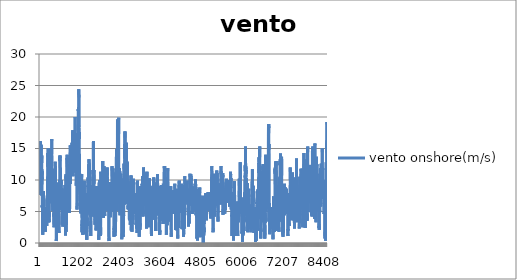
| Category | vento onshore(m/s) |
|---|---|
| 0 | 10.6 |
| 1 | 11 |
| 2 | 11.8 |
| 3 | 12.4 |
| 4 | 12.6 |
| 5 | 12.8 |
| 6 | 13.1 |
| 7 | 13.4 |
| 8 | 13.9 |
| 9 | 14.9 |
| 10 | 16.2 |
| 11 | 15.9 |
| 12 | 15.4 |
| 13 | 15.2 |
| 14 | 13.8 |
| 15 | 13.1 |
| 16 | 10.7 |
| 17 | 9 |
| 18 | 7.6 |
| 19 | 8.2 |
| 20 | 8.9 |
| 21 | 8.7 |
| 22 | 8.4 |
| 23 | 8.2 |
| 24 | 12.3 |
| 25 | 10.7 |
| 26 | 11.8 |
| 27 | 11 |
| 28 | 10.5 |
| 29 | 10.9 |
| 30 | 11.9 |
| 31 | 12.5 |
| 32 | 12.4 |
| 33 | 12.4 |
| 34 | 14 |
| 35 | 15.3 |
| 36 | 15.6 |
| 37 | 14.7 |
| 38 | 14.5 |
| 39 | 12.3 |
| 40 | 12.6 |
| 41 | 11.6 |
| 42 | 10.6 |
| 43 | 10.1 |
| 44 | 10.6 |
| 45 | 10.5 |
| 46 | 13.8 |
| 47 | 12.4 |
| 48 | 13.9 |
| 49 | 13.4 |
| 50 | 12.5 |
| 51 | 11.5 |
| 52 | 11 |
| 53 | 11.7 |
| 54 | 10.2 |
| 55 | 11.4 |
| 56 | 10.1 |
| 57 | 10.4 |
| 58 | 10.5 |
| 59 | 9.3 |
| 60 | 8.6 |
| 61 | 7.5 |
| 62 | 8 |
| 63 | 7.5 |
| 64 | 6 |
| 65 | 5.7 |
| 66 | 6 |
| 67 | 5.8 |
| 68 | 5.6 |
| 69 | 5.9 |
| 70 | 4.9 |
| 71 | 7.1 |
| 72 | 5.2 |
| 73 | 4.1 |
| 74 | 4.2 |
| 75 | 4 |
| 76 | 4 |
| 77 | 1.3 |
| 78 | 1.9 |
| 79 | 3.3 |
| 80 | 4.5 |
| 81 | 6.2 |
| 82 | 7.2 |
| 83 | 7 |
| 84 | 6.5 |
| 85 | 6.1 |
| 86 | 4.8 |
| 87 | 3.1 |
| 88 | 2.8 |
| 89 | 2.8 |
| 90 | 2.8 |
| 91 | 4.2 |
| 92 | 4.7 |
| 93 | 5.9 |
| 94 | 7.5 |
| 95 | 8.2 |
| 96 | 7.6 |
| 97 | 6.8 |
| 98 | 6.7 |
| 99 | 7.4 |
| 100 | 8.2 |
| 101 | 8.3 |
| 102 | 7.3 |
| 103 | 7.5 |
| 104 | 7.9 |
| 105 | 7.9 |
| 106 | 7.8 |
| 107 | 7.2 |
| 108 | 6.2 |
| 109 | 5.8 |
| 110 | 6.9 |
| 111 | 5.7 |
| 112 | 5.4 |
| 113 | 4.5 |
| 114 | 4.7 |
| 115 | 4 |
| 116 | 4.8 |
| 117 | 4.5 |
| 118 | 4.7 |
| 119 | 4.4 |
| 120 | 4.4 |
| 121 | 4 |
| 122 | 3.3 |
| 123 | 2.9 |
| 124 | 3.7 |
| 125 | 4.2 |
| 126 | 4.2 |
| 127 | 4.3 |
| 128 | 4 |
| 129 | 4.1 |
| 130 | 4.1 |
| 131 | 3.6 |
| 132 | 3.5 |
| 133 | 3.6 |
| 134 | 3.2 |
| 135 | 2.9 |
| 136 | 2.4 |
| 137 | 1.9 |
| 138 | 2.6 |
| 139 | 3.6 |
| 140 | 4.2 |
| 141 | 4.2 |
| 142 | 4.5 |
| 143 | 4.5 |
| 144 | 4.4 |
| 145 | 4 |
| 146 | 3.3 |
| 147 | 2.9 |
| 148 | 3.7 |
| 149 | 4.2 |
| 150 | 4.2 |
| 151 | 4.3 |
| 152 | 4 |
| 153 | 4.1 |
| 154 | 4.1 |
| 155 | 3.6 |
| 156 | 3.5 |
| 157 | 3.6 |
| 158 | 3.2 |
| 159 | 2.9 |
| 160 | 2.4 |
| 161 | 1.8 |
| 162 | 2.6 |
| 163 | 3.5 |
| 164 | 4.3 |
| 165 | 4.4 |
| 166 | 4.5 |
| 167 | 4.5 |
| 168 | 3.9 |
| 169 | 3.6 |
| 170 | 3.8 |
| 171 | 4.3 |
| 172 | 5 |
| 173 | 5.1 |
| 174 | 5 |
| 175 | 4.6 |
| 176 | 4.2 |
| 177 | 4.1 |
| 178 | 3.8 |
| 179 | 3.4 |
| 180 | 3.3 |
| 181 | 3.1 |
| 182 | 3.1 |
| 183 | 3.2 |
| 184 | 3.4 |
| 185 | 4 |
| 186 | 4.4 |
| 187 | 5 |
| 188 | 5.5 |
| 189 | 5.7 |
| 190 | 5.8 |
| 191 | 5.5 |
| 192 | 5.4 |
| 193 | 4.4 |
| 194 | 3.5 |
| 195 | 2.7 |
| 196 | 4.1 |
| 197 | 4.3 |
| 198 | 4.5 |
| 199 | 4 |
| 200 | 4.5 |
| 201 | 4.9 |
| 202 | 5.1 |
| 203 | 5.1 |
| 204 | 5.5 |
| 205 | 5.6 |
| 206 | 5.3 |
| 207 | 5.1 |
| 208 | 5.5 |
| 209 | 5.8 |
| 210 | 6 |
| 211 | 6.4 |
| 212 | 6.4 |
| 213 | 6.3 |
| 214 | 7.2 |
| 215 | 5 |
| 216 | 5.6 |
| 217 | 5.6 |
| 218 | 5.7 |
| 219 | 6.5 |
| 220 | 7.9 |
| 221 | 9.4 |
| 222 | 10.4 |
| 223 | 10.5 |
| 224 | 10.7 |
| 225 | 10.7 |
| 226 | 11.7 |
| 227 | 11.9 |
| 228 | 12.6 |
| 229 | 14.3 |
| 230 | 13.6 |
| 231 | 12.2 |
| 232 | 12.5 |
| 233 | 12.7 |
| 234 | 12.6 |
| 235 | 12.1 |
| 236 | 12.2 |
| 237 | 12.1 |
| 238 | 13 |
| 239 | 15 |
| 240 | 10.1 |
| 241 | 10.6 |
| 242 | 9 |
| 243 | 8.5 |
| 244 | 7.5 |
| 245 | 6.9 |
| 246 | 6.8 |
| 247 | 6.8 |
| 248 | 4.9 |
| 249 | 3.9 |
| 250 | 3.3 |
| 251 | 4.3 |
| 252 | 4.6 |
| 253 | 4.7 |
| 254 | 4.5 |
| 255 | 5.3 |
| 256 | 7 |
| 257 | 6.4 |
| 258 | 5.4 |
| 259 | 4.9 |
| 260 | 4.8 |
| 261 | 4.4 |
| 262 | 4.3 |
| 263 | 4.1 |
| 264 | 4.9 |
| 265 | 4.1 |
| 266 | 3.3 |
| 267 | 3.2 |
| 268 | 3.2 |
| 269 | 3.3 |
| 270 | 3.3 |
| 271 | 3.9 |
| 272 | 5 |
| 273 | 6.3 |
| 274 | 6.9 |
| 275 | 7.2 |
| 276 | 7.9 |
| 277 | 9.1 |
| 278 | 10.1 |
| 279 | 10.8 |
| 280 | 11.2 |
| 281 | 11.6 |
| 282 | 12.3 |
| 283 | 12.9 |
| 284 | 13.5 |
| 285 | 14.1 |
| 286 | 14 |
| 287 | 14.4 |
| 288 | 13.6 |
| 289 | 12.5 |
| 290 | 12.2 |
| 291 | 14.3 |
| 292 | 14.9 |
| 293 | 10.3 |
| 294 | 7.3 |
| 295 | 8.2 |
| 296 | 7.6 |
| 297 | 6.9 |
| 298 | 6.8 |
| 299 | 6.5 |
| 300 | 6.3 |
| 301 | 6.5 |
| 302 | 7.6 |
| 303 | 9.1 |
| 304 | 9.4 |
| 305 | 10 |
| 306 | 9.8 |
| 307 | 9.3 |
| 308 | 9.4 |
| 309 | 8.4 |
| 310 | 7.9 |
| 311 | 8.5 |
| 312 | 8.6 |
| 313 | 8.4 |
| 314 | 8.5 |
| 315 | 7.4 |
| 316 | 6.9 |
| 317 | 6.6 |
| 318 | 7.3 |
| 319 | 7.8 |
| 320 | 7.6 |
| 321 | 7 |
| 322 | 8.3 |
| 323 | 8.5 |
| 324 | 9.4 |
| 325 | 9.7 |
| 326 | 10.2 |
| 327 | 10.9 |
| 328 | 10.4 |
| 329 | 9.1 |
| 330 | 8.8 |
| 331 | 8.6 |
| 332 | 8.7 |
| 333 | 10.5 |
| 334 | 12 |
| 335 | 12.4 |
| 336 | 12.7 |
| 337 | 12.1 |
| 338 | 12.1 |
| 339 | 13.1 |
| 340 | 14.6 |
| 341 | 15.9 |
| 342 | 16.1 |
| 343 | 16.5 |
| 344 | 16.2 |
| 345 | 15.5 |
| 346 | 15.6 |
| 347 | 13.8 |
| 348 | 10.8 |
| 349 | 9.3 |
| 350 | 10.3 |
| 351 | 11.2 |
| 352 | 10.1 |
| 353 | 10.2 |
| 354 | 10.6 |
| 355 | 10.2 |
| 356 | 10.3 |
| 357 | 9.5 |
| 358 | 9 |
| 359 | 8.8 |
| 360 | 9.4 |
| 361 | 9.1 |
| 362 | 8.7 |
| 363 | 7.7 |
| 364 | 7.2 |
| 365 | 6.4 |
| 366 | 6.1 |
| 367 | 7.4 |
| 368 | 6.4 |
| 369 | 5.7 |
| 370 | 5.1 |
| 371 | 6.1 |
| 372 | 7.7 |
| 373 | 8 |
| 374 | 8.6 |
| 375 | 8.6 |
| 376 | 8.2 |
| 377 | 9.1 |
| 378 | 10.3 |
| 379 | 10.1 |
| 380 | 9.4 |
| 381 | 9.4 |
| 382 | 10 |
| 383 | 11.8 |
| 384 | 7.3 |
| 385 | 7.8 |
| 386 | 7.7 |
| 387 | 7.4 |
| 388 | 6.5 |
| 389 | 6.2 |
| 390 | 6.8 |
| 391 | 7.7 |
| 392 | 8 |
| 393 | 7 |
| 394 | 6.4 |
| 395 | 7.3 |
| 396 | 6.5 |
| 397 | 6.3 |
| 398 | 6.3 |
| 399 | 5.2 |
| 400 | 5.2 |
| 401 | 4.2 |
| 402 | 4.7 |
| 403 | 4.4 |
| 404 | 3.6 |
| 405 | 3.2 |
| 406 | 2.5 |
| 407 | 2.7 |
| 408 | 4.6 |
| 409 | 5.3 |
| 410 | 5.7 |
| 411 | 6 |
| 412 | 6.2 |
| 413 | 6.5 |
| 414 | 7.1 |
| 415 | 7.3 |
| 416 | 6.2 |
| 417 | 5.6 |
| 418 | 5.2 |
| 419 | 5.2 |
| 420 | 5.6 |
| 421 | 5.6 |
| 422 | 5.7 |
| 423 | 6.1 |
| 424 | 6 |
| 425 | 6.3 |
| 426 | 6.7 |
| 427 | 8.2 |
| 428 | 10.6 |
| 429 | 11.3 |
| 430 | 11.4 |
| 431 | 11.3 |
| 432 | 11 |
| 433 | 10.6 |
| 434 | 10.3 |
| 435 | 10.2 |
| 436 | 10.1 |
| 437 | 10.5 |
| 438 | 10.8 |
| 439 | 10.6 |
| 440 | 10.5 |
| 441 | 10.8 |
| 442 | 11.3 |
| 443 | 11.7 |
| 444 | 12.1 |
| 445 | 12.6 |
| 446 | 12.9 |
| 447 | 12.9 |
| 448 | 12.7 |
| 449 | 12.3 |
| 450 | 12 |
| 451 | 11.6 |
| 452 | 11.3 |
| 453 | 11 |
| 454 | 10.7 |
| 455 | 10.4 |
| 456 | 9.6 |
| 457 | 9.3 |
| 458 | 9.1 |
| 459 | 8.5 |
| 460 | 8 |
| 461 | 7.8 |
| 462 | 7.6 |
| 463 | 7.2 |
| 464 | 6.7 |
| 465 | 6.4 |
| 466 | 6.2 |
| 467 | 6 |
| 468 | 5.9 |
| 469 | 5.8 |
| 470 | 5.6 |
| 471 | 5.4 |
| 472 | 5.1 |
| 473 | 4.6 |
| 474 | 4.1 |
| 475 | 3.1 |
| 476 | 1.8 |
| 477 | 0.8 |
| 478 | 0.3 |
| 479 | 0.7 |
| 480 | 1.9 |
| 481 | 2.2 |
| 482 | 2.1 |
| 483 | 2.5 |
| 484 | 3.1 |
| 485 | 4 |
| 486 | 4.2 |
| 487 | 4 |
| 488 | 4.6 |
| 489 | 5.1 |
| 490 | 5.5 |
| 491 | 5.8 |
| 492 | 6.1 |
| 493 | 6.8 |
| 494 | 7.3 |
| 495 | 7.8 |
| 496 | 7.8 |
| 497 | 7.8 |
| 498 | 8 |
| 499 | 8.2 |
| 500 | 8.3 |
| 501 | 8.3 |
| 502 | 7.9 |
| 503 | 7.7 |
| 504 | 8.8 |
| 505 | 8.1 |
| 506 | 7.5 |
| 507 | 6.7 |
| 508 | 6.4 |
| 509 | 6.7 |
| 510 | 7 |
| 511 | 7.3 |
| 512 | 8 |
| 513 | 8.8 |
| 514 | 9 |
| 515 | 9.2 |
| 516 | 9.3 |
| 517 | 8.8 |
| 518 | 8.8 |
| 519 | 8.3 |
| 520 | 7.2 |
| 521 | 6.6 |
| 522 | 6.3 |
| 523 | 6 |
| 524 | 5.4 |
| 525 | 5.2 |
| 526 | 4.9 |
| 527 | 4.3 |
| 528 | 6.9 |
| 529 | 6.5 |
| 530 | 6.7 |
| 531 | 6.5 |
| 532 | 6.3 |
| 533 | 6.6 |
| 534 | 7.2 |
| 535 | 7.5 |
| 536 | 8 |
| 537 | 8.3 |
| 538 | 8.5 |
| 539 | 8.7 |
| 540 | 9.2 |
| 541 | 9.6 |
| 542 | 9.5 |
| 543 | 9.5 |
| 544 | 9.7 |
| 545 | 9.7 |
| 546 | 9.6 |
| 547 | 9.4 |
| 548 | 9.3 |
| 549 | 9.2 |
| 550 | 8.9 |
| 551 | 8.4 |
| 552 | 2.8 |
| 553 | 1.6 |
| 554 | 1.9 |
| 555 | 2.7 |
| 556 | 4 |
| 557 | 5.3 |
| 558 | 5.4 |
| 559 | 5.2 |
| 560 | 5.2 |
| 561 | 5.2 |
| 562 | 5.7 |
| 563 | 6.9 |
| 564 | 6.9 |
| 565 | 7.1 |
| 566 | 6.9 |
| 567 | 7.5 |
| 568 | 7.8 |
| 569 | 8 |
| 570 | 8.1 |
| 571 | 8.5 |
| 572 | 9.3 |
| 573 | 9.8 |
| 574 | 10.2 |
| 575 | 10.3 |
| 576 | 13.6 |
| 577 | 13.3 |
| 578 | 13.3 |
| 579 | 13 |
| 580 | 13.2 |
| 581 | 13.5 |
| 582 | 13.6 |
| 583 | 13.7 |
| 584 | 13.5 |
| 585 | 13.9 |
| 586 | 13.9 |
| 587 | 13.6 |
| 588 | 13.5 |
| 589 | 13.3 |
| 590 | 12.7 |
| 591 | 12.1 |
| 592 | 12.1 |
| 593 | 12 |
| 594 | 12.1 |
| 595 | 12.1 |
| 596 | 12.2 |
| 597 | 12.1 |
| 598 | 11.9 |
| 599 | 11.4 |
| 600 | 8.3 |
| 601 | 8.1 |
| 602 | 7.2 |
| 603 | 6.4 |
| 604 | 6.6 |
| 605 | 7.8 |
| 606 | 9.3 |
| 607 | 9.7 |
| 608 | 9.2 |
| 609 | 8.6 |
| 610 | 8.4 |
| 611 | 8.2 |
| 612 | 8.1 |
| 613 | 8 |
| 614 | 8.4 |
| 615 | 9.1 |
| 616 | 9.6 |
| 617 | 9.5 |
| 618 | 9.4 |
| 619 | 9.7 |
| 620 | 10 |
| 621 | 9.8 |
| 622 | 9.3 |
| 623 | 9.2 |
| 624 | 7 |
| 625 | 6.6 |
| 626 | 6.3 |
| 627 | 5.8 |
| 628 | 5.4 |
| 629 | 5.2 |
| 630 | 6.5 |
| 631 | 7.8 |
| 632 | 8.3 |
| 633 | 7.4 |
| 634 | 6.4 |
| 635 | 5.9 |
| 636 | 6.4 |
| 637 | 7.4 |
| 638 | 8.5 |
| 639 | 8.7 |
| 640 | 8.5 |
| 641 | 8.3 |
| 642 | 8.2 |
| 643 | 8.4 |
| 644 | 8.6 |
| 645 | 8 |
| 646 | 7.1 |
| 647 | 5.7 |
| 648 | 5.2 |
| 649 | 4.1 |
| 650 | 3.3 |
| 651 | 2.9 |
| 652 | 2.9 |
| 653 | 3.4 |
| 654 | 4.2 |
| 655 | 4.8 |
| 656 | 4.9 |
| 657 | 5.3 |
| 658 | 5.8 |
| 659 | 5.1 |
| 660 | 4.3 |
| 661 | 4.7 |
| 662 | 4.9 |
| 663 | 5.3 |
| 664 | 5.5 |
| 665 | 5 |
| 666 | 4.1 |
| 667 | 3.2 |
| 668 | 2.6 |
| 669 | 2.6 |
| 670 | 2.9 |
| 671 | 3.1 |
| 672 | 4.5 |
| 673 | 4.6 |
| 674 | 4.5 |
| 675 | 4.4 |
| 676 | 4.4 |
| 677 | 4.9 |
| 678 | 5.7 |
| 679 | 5.8 |
| 680 | 6.1 |
| 681 | 6.1 |
| 682 | 5.7 |
| 683 | 5.7 |
| 684 | 5.6 |
| 685 | 5.5 |
| 686 | 5.7 |
| 687 | 6.1 |
| 688 | 6.4 |
| 689 | 6.7 |
| 690 | 6.8 |
| 691 | 6.9 |
| 692 | 6.8 |
| 693 | 6.2 |
| 694 | 5.4 |
| 695 | 4.8 |
| 696 | 6.5 |
| 697 | 6.3 |
| 698 | 6.1 |
| 699 | 5.7 |
| 700 | 5.4 |
| 701 | 5.6 |
| 702 | 6.3 |
| 703 | 6.8 |
| 704 | 7.2 |
| 705 | 7.5 |
| 706 | 7.9 |
| 707 | 8.1 |
| 708 | 7.6 |
| 709 | 7.3 |
| 710 | 7.2 |
| 711 | 8 |
| 712 | 7 |
| 713 | 6.2 |
| 714 | 5.5 |
| 715 | 6.3 |
| 716 | 6.9 |
| 717 | 6.6 |
| 718 | 6.9 |
| 719 | 8.2 |
| 720 | 3.7 |
| 721 | 4.5 |
| 722 | 5.5 |
| 723 | 6.2 |
| 724 | 6.7 |
| 725 | 6.7 |
| 726 | 6.9 |
| 727 | 6.9 |
| 728 | 6.9 |
| 729 | 7.3 |
| 730 | 7.4 |
| 731 | 7.9 |
| 732 | 8.9 |
| 733 | 9.2 |
| 734 | 7.9 |
| 735 | 7.5 |
| 736 | 7.3 |
| 737 | 6.5 |
| 738 | 5.9 |
| 739 | 5.7 |
| 740 | 5.6 |
| 741 | 5.3 |
| 742 | 5.8 |
| 743 | 5.5 |
| 744 | 3.4 |
| 745 | 2.2 |
| 746 | 1.4 |
| 747 | 1.2 |
| 748 | 4.3 |
| 749 | 5.4 |
| 750 | 6.9 |
| 751 | 7.6 |
| 752 | 8.3 |
| 753 | 8.6 |
| 754 | 8.8 |
| 755 | 8.6 |
| 756 | 8.6 |
| 757 | 8.7 |
| 758 | 9.3 |
| 759 | 10.3 |
| 760 | 10.9 |
| 761 | 10.6 |
| 762 | 10.2 |
| 763 | 10.6 |
| 764 | 8.1 |
| 765 | 4.5 |
| 766 | 3.2 |
| 767 | 2.1 |
| 768 | 2 |
| 769 | 1.8 |
| 770 | 2 |
| 771 | 2.8 |
| 772 | 3.4 |
| 773 | 3.4 |
| 774 | 3.8 |
| 775 | 4.2 |
| 776 | 5 |
| 777 | 5.8 |
| 778 | 6.9 |
| 779 | 8.3 |
| 780 | 8.5 |
| 781 | 8.4 |
| 782 | 8.1 |
| 783 | 8.1 |
| 784 | 8.2 |
| 785 | 8.3 |
| 786 | 8.2 |
| 787 | 9 |
| 788 | 10.2 |
| 789 | 10.8 |
| 790 | 8.8 |
| 791 | 8.8 |
| 792 | 13.4 |
| 793 | 14 |
| 794 | 14 |
| 795 | 13.2 |
| 796 | 13.5 |
| 797 | 12.6 |
| 798 | 12.3 |
| 799 | 12.3 |
| 800 | 12.3 |
| 801 | 12 |
| 802 | 12.5 |
| 803 | 9.4 |
| 804 | 9.7 |
| 805 | 8.4 |
| 806 | 8.1 |
| 807 | 8.7 |
| 808 | 9.1 |
| 809 | 9.4 |
| 810 | 10.3 |
| 811 | 10.8 |
| 812 | 10.5 |
| 813 | 9.9 |
| 814 | 9.9 |
| 815 | 9.8 |
| 816 | 6.4 |
| 817 | 6.3 |
| 818 | 6.6 |
| 819 | 6.9 |
| 820 | 6.3 |
| 821 | 5.7 |
| 822 | 6.6 |
| 823 | 7.5 |
| 824 | 8.1 |
| 825 | 9.4 |
| 826 | 8 |
| 827 | 7.8 |
| 828 | 7.8 |
| 829 | 7.4 |
| 830 | 6.3 |
| 831 | 6.3 |
| 832 | 6.9 |
| 833 | 7.4 |
| 834 | 7.4 |
| 835 | 7.2 |
| 836 | 7.2 |
| 837 | 7.7 |
| 838 | 7.7 |
| 839 | 8.2 |
| 840 | 5.8 |
| 841 | 5.4 |
| 842 | 5.4 |
| 843 | 5.6 |
| 844 | 6.1 |
| 845 | 6.4 |
| 846 | 6.8 |
| 847 | 6.8 |
| 848 | 6.9 |
| 849 | 6.9 |
| 850 | 7 |
| 851 | 7.2 |
| 852 | 7.2 |
| 853 | 7 |
| 854 | 6.9 |
| 855 | 6.7 |
| 856 | 6.8 |
| 857 | 7.2 |
| 858 | 7.4 |
| 859 | 7.6 |
| 860 | 7.9 |
| 861 | 7.9 |
| 862 | 7.8 |
| 863 | 8.3 |
| 864 | 4.8 |
| 865 | 5.3 |
| 866 | 5.2 |
| 867 | 5.5 |
| 868 | 5.5 |
| 869 | 5.5 |
| 870 | 6.8 |
| 871 | 8.6 |
| 872 | 9.7 |
| 873 | 11 |
| 874 | 12 |
| 875 | 12.6 |
| 876 | 13 |
| 877 | 13.6 |
| 878 | 14.1 |
| 879 | 14.2 |
| 880 | 14.3 |
| 881 | 14.4 |
| 882 | 14.5 |
| 883 | 14.8 |
| 884 | 15.1 |
| 885 | 15.5 |
| 886 | 15.6 |
| 887 | 15.3 |
| 888 | 14 |
| 889 | 13.2 |
| 890 | 12.1 |
| 891 | 11.3 |
| 892 | 10.2 |
| 893 | 9.4 |
| 894 | 10.5 |
| 895 | 11 |
| 896 | 11.8 |
| 897 | 12.2 |
| 898 | 11.9 |
| 899 | 11.3 |
| 900 | 10.9 |
| 901 | 10.8 |
| 902 | 10.8 |
| 903 | 11.1 |
| 904 | 11.5 |
| 905 | 12 |
| 906 | 12.5 |
| 907 | 13.3 |
| 908 | 14.1 |
| 909 | 14.3 |
| 910 | 13.8 |
| 911 | 13.4 |
| 912 | 13.4 |
| 913 | 12.7 |
| 914 | 11.8 |
| 915 | 11.7 |
| 916 | 11.6 |
| 917 | 11.8 |
| 918 | 12.8 |
| 919 | 13.2 |
| 920 | 13.6 |
| 921 | 13.2 |
| 922 | 12.5 |
| 923 | 12 |
| 924 | 11.4 |
| 925 | 10.7 |
| 926 | 11 |
| 927 | 12.1 |
| 928 | 13 |
| 929 | 13.2 |
| 930 | 13.8 |
| 931 | 14.3 |
| 932 | 15 |
| 933 | 15.4 |
| 934 | 15.6 |
| 935 | 15.9 |
| 936 | 15.3 |
| 937 | 14.3 |
| 938 | 13.6 |
| 939 | 13.4 |
| 940 | 13.5 |
| 941 | 14.1 |
| 942 | 14.5 |
| 943 | 14.7 |
| 944 | 14.4 |
| 945 | 14.2 |
| 946 | 13.8 |
| 947 | 13.4 |
| 948 | 12.8 |
| 949 | 13.1 |
| 950 | 14.4 |
| 951 | 15.8 |
| 952 | 16.9 |
| 953 | 17.4 |
| 954 | 17.7 |
| 955 | 17.8 |
| 956 | 17.9 |
| 957 | 17.7 |
| 958 | 17.1 |
| 959 | 16.3 |
| 960 | 13.1 |
| 961 | 12.2 |
| 962 | 11.4 |
| 963 | 10.6 |
| 964 | 11 |
| 965 | 11.8 |
| 966 | 12.7 |
| 967 | 13.6 |
| 968 | 13.1 |
| 969 | 12.6 |
| 970 | 12.6 |
| 971 | 12.5 |
| 972 | 12.2 |
| 973 | 12.2 |
| 974 | 12.2 |
| 975 | 12.3 |
| 976 | 13 |
| 977 | 13.9 |
| 978 | 14.7 |
| 979 | 15.3 |
| 980 | 15.8 |
| 981 | 16 |
| 982 | 15.9 |
| 983 | 15.6 |
| 984 | 14.6 |
| 985 | 13.7 |
| 986 | 12.8 |
| 987 | 12.8 |
| 988 | 12.7 |
| 989 | 12.1 |
| 990 | 11.6 |
| 991 | 11.6 |
| 992 | 11.6 |
| 993 | 11.2 |
| 994 | 11.3 |
| 995 | 11.7 |
| 996 | 12.2 |
| 997 | 12.8 |
| 998 | 13.3 |
| 999 | 13.7 |
| 1000 | 13.6 |
| 1001 | 13.6 |
| 1002 | 14.1 |
| 1003 | 15.4 |
| 1004 | 16 |
| 1005 | 15.8 |
| 1006 | 15.2 |
| 1007 | 14.3 |
| 1008 | 16.2 |
| 1009 | 16.1 |
| 1010 | 15.4 |
| 1011 | 15.3 |
| 1012 | 15.1 |
| 1013 | 15.1 |
| 1014 | 15.5 |
| 1015 | 16.3 |
| 1016 | 17.2 |
| 1017 | 17.2 |
| 1018 | 17.4 |
| 1019 | 17.3 |
| 1020 | 17.5 |
| 1021 | 18.1 |
| 1022 | 18.6 |
| 1023 | 18.8 |
| 1024 | 18.9 |
| 1025 | 19.5 |
| 1026 | 20 |
| 1027 | 20 |
| 1028 | 19.9 |
| 1029 | 19.8 |
| 1030 | 19 |
| 1031 | 18.1 |
| 1032 | 17.1 |
| 1033 | 16.7 |
| 1034 | 15.1 |
| 1035 | 13.9 |
| 1036 | 12.8 |
| 1037 | 13.5 |
| 1038 | 15.7 |
| 1039 | 16.9 |
| 1040 | 16.8 |
| 1041 | 15.7 |
| 1042 | 15.1 |
| 1043 | 15.4 |
| 1044 | 16.4 |
| 1045 | 16.9 |
| 1046 | 17.1 |
| 1047 | 17 |
| 1048 | 17.1 |
| 1049 | 17.2 |
| 1050 | 17.2 |
| 1051 | 17.2 |
| 1052 | 17.4 |
| 1053 | 17.2 |
| 1054 | 16.7 |
| 1055 | 16.3 |
| 1056 | 12.6 |
| 1057 | 11.9 |
| 1058 | 11.2 |
| 1059 | 10 |
| 1060 | 9.1 |
| 1061 | 9.6 |
| 1062 | 11.1 |
| 1063 | 11.8 |
| 1064 | 13.3 |
| 1065 | 12.3 |
| 1066 | 12.5 |
| 1067 | 12.9 |
| 1068 | 12.8 |
| 1069 | 13.3 |
| 1070 | 12.9 |
| 1071 | 12.4 |
| 1072 | 12.7 |
| 1073 | 13.1 |
| 1074 | 13.3 |
| 1075 | 13.5 |
| 1076 | 13.3 |
| 1077 | 13.4 |
| 1078 | 13.4 |
| 1079 | 13.4 |
| 1080 | 8.7 |
| 1081 | 8.2 |
| 1082 | 7.5 |
| 1083 | 6.6 |
| 1084 | 5.8 |
| 1085 | 5.3 |
| 1086 | 6.4 |
| 1087 | 8.1 |
| 1088 | 8.7 |
| 1089 | 9.3 |
| 1090 | 10.1 |
| 1091 | 10.8 |
| 1092 | 10.8 |
| 1093 | 11.3 |
| 1094 | 11.7 |
| 1095 | 12.2 |
| 1096 | 12.8 |
| 1097 | 13.1 |
| 1098 | 13.2 |
| 1099 | 13.8 |
| 1100 | 14.5 |
| 1101 | 15 |
| 1102 | 15.3 |
| 1103 | 15.3 |
| 1104 | 14.3 |
| 1105 | 14.2 |
| 1106 | 14.1 |
| 1107 | 12.6 |
| 1108 | 11.2 |
| 1109 | 12 |
| 1110 | 14.2 |
| 1111 | 15.1 |
| 1112 | 15.3 |
| 1113 | 16.4 |
| 1114 | 18 |
| 1115 | 19.1 |
| 1116 | 19.1 |
| 1117 | 19.7 |
| 1118 | 20.5 |
| 1119 | 21.2 |
| 1120 | 21.3 |
| 1121 | 21 |
| 1122 | 21 |
| 1123 | 21.5 |
| 1124 | 21 |
| 1125 | 20.7 |
| 1126 | 19.7 |
| 1127 | 19.1 |
| 1128 | 18.5 |
| 1129 | 20 |
| 1130 | 19.8 |
| 1131 | 18.4 |
| 1132 | 18.7 |
| 1133 | 18.8 |
| 1134 | 20.7 |
| 1135 | 23.8 |
| 1136 | 24.4 |
| 1137 | 23.1 |
| 1138 | 22.3 |
| 1139 | 22.4 |
| 1140 | 20.4 |
| 1141 | 19.3 |
| 1142 | 19 |
| 1143 | 19 |
| 1144 | 18.3 |
| 1145 | 17.1 |
| 1146 | 16.5 |
| 1147 | 17.6 |
| 1148 | 17.3 |
| 1149 | 17.4 |
| 1150 | 15.9 |
| 1151 | 15 |
| 1152 | 11.7 |
| 1153 | 12.7 |
| 1154 | 13.1 |
| 1155 | 12.4 |
| 1156 | 12.1 |
| 1157 | 10.7 |
| 1158 | 10 |
| 1159 | 10.3 |
| 1160 | 9.5 |
| 1161 | 11 |
| 1162 | 9.3 |
| 1163 | 8.5 |
| 1164 | 9.2 |
| 1165 | 9.9 |
| 1166 | 10.1 |
| 1167 | 9.8 |
| 1168 | 9.7 |
| 1169 | 8.5 |
| 1170 | 8.2 |
| 1171 | 8.6 |
| 1172 | 8.8 |
| 1173 | 8.9 |
| 1174 | 8 |
| 1175 | 7.7 |
| 1176 | 8.2 |
| 1177 | 7.4 |
| 1178 | 6.9 |
| 1179 | 6.7 |
| 1180 | 7.4 |
| 1181 | 7.3 |
| 1182 | 7 |
| 1183 | 6.4 |
| 1184 | 6.9 |
| 1185 | 5.9 |
| 1186 | 6.3 |
| 1187 | 5.5 |
| 1188 | 5.9 |
| 1189 | 5.2 |
| 1190 | 5.3 |
| 1191 | 4.9 |
| 1192 | 4.7 |
| 1193 | 4.9 |
| 1194 | 5.7 |
| 1195 | 6.5 |
| 1196 | 6.7 |
| 1197 | 6.3 |
| 1198 | 7.3 |
| 1199 | 7.5 |
| 1200 | 5.3 |
| 1201 | 5.2 |
| 1202 | 5.5 |
| 1203 | 6 |
| 1204 | 6.9 |
| 1205 | 8.1 |
| 1206 | 9 |
| 1207 | 9.3 |
| 1208 | 8.8 |
| 1209 | 8.2 |
| 1210 | 8.2 |
| 1211 | 8.6 |
| 1212 | 9 |
| 1213 | 9.6 |
| 1214 | 10 |
| 1215 | 10.5 |
| 1216 | 10.5 |
| 1217 | 10.6 |
| 1218 | 10.9 |
| 1219 | 10.8 |
| 1220 | 10.8 |
| 1221 | 10.9 |
| 1222 | 10.4 |
| 1223 | 10 |
| 1224 | 5.9 |
| 1225 | 5.4 |
| 1226 | 6.5 |
| 1227 | 4 |
| 1228 | 3.2 |
| 1229 | 2.7 |
| 1230 | 2.8 |
| 1231 | 1.7 |
| 1232 | 2.8 |
| 1233 | 3.6 |
| 1234 | 2.7 |
| 1235 | 3 |
| 1236 | 2.9 |
| 1237 | 3 |
| 1238 | 3 |
| 1239 | 2.6 |
| 1240 | 2 |
| 1241 | 2.3 |
| 1242 | 2.2 |
| 1243 | 1.6 |
| 1244 | 2 |
| 1245 | 4 |
| 1246 | 3.4 |
| 1247 | 1.3 |
| 1248 | 3 |
| 1249 | 3.5 |
| 1250 | 3.9 |
| 1251 | 4.6 |
| 1252 | 5.4 |
| 1253 | 5.3 |
| 1254 | 6 |
| 1255 | 6 |
| 1256 | 6.4 |
| 1257 | 5.9 |
| 1258 | 5.6 |
| 1259 | 4.9 |
| 1260 | 5 |
| 1261 | 5.6 |
| 1262 | 6 |
| 1263 | 5.9 |
| 1264 | 5.8 |
| 1265 | 5.6 |
| 1266 | 5.5 |
| 1267 | 5.5 |
| 1268 | 5.4 |
| 1269 | 5.4 |
| 1270 | 5.4 |
| 1271 | 5.3 |
| 1272 | 2.5 |
| 1273 | 2.5 |
| 1274 | 2.8 |
| 1275 | 3.4 |
| 1276 | 3.8 |
| 1277 | 4.1 |
| 1278 | 4.7 |
| 1279 | 5 |
| 1280 | 5.6 |
| 1281 | 5.8 |
| 1282 | 6.2 |
| 1283 | 6.6 |
| 1284 | 7 |
| 1285 | 6.4 |
| 1286 | 6.2 |
| 1287 | 6.9 |
| 1288 | 6.8 |
| 1289 | 7.1 |
| 1290 | 7.9 |
| 1291 | 8.1 |
| 1292 | 8.2 |
| 1293 | 8.2 |
| 1294 | 8.7 |
| 1295 | 9.9 |
| 1296 | 2.1 |
| 1297 | 2.1 |
| 1298 | 1.9 |
| 1299 | 1.4 |
| 1300 | 1.9 |
| 1301 | 3.5 |
| 1302 | 4 |
| 1303 | 4.6 |
| 1304 | 4.9 |
| 1305 | 4.6 |
| 1306 | 4.1 |
| 1307 | 3.8 |
| 1308 | 3.6 |
| 1309 | 3.9 |
| 1310 | 4.2 |
| 1311 | 4.7 |
| 1312 | 3.8 |
| 1313 | 4.3 |
| 1314 | 4.7 |
| 1315 | 5.1 |
| 1316 | 4.3 |
| 1317 | 3.8 |
| 1318 | 3.8 |
| 1319 | 4.7 |
| 1320 | 6.4 |
| 1321 | 6.1 |
| 1322 | 6.4 |
| 1323 | 6.7 |
| 1324 | 7 |
| 1325 | 6.9 |
| 1326 | 7.1 |
| 1327 | 6.7 |
| 1328 | 7.2 |
| 1329 | 7.1 |
| 1330 | 7.7 |
| 1331 | 7.9 |
| 1332 | 7.7 |
| 1333 | 7.1 |
| 1334 | 7.9 |
| 1335 | 5.7 |
| 1336 | 6.8 |
| 1337 | 7.5 |
| 1338 | 5.7 |
| 1339 | 5.4 |
| 1340 | 6.2 |
| 1341 | 6.3 |
| 1342 | 7.2 |
| 1343 | 7.8 |
| 1344 | 7.1 |
| 1345 | 7 |
| 1346 | 7.1 |
| 1347 | 7.4 |
| 1348 | 7.7 |
| 1349 | 7.8 |
| 1350 | 7.7 |
| 1351 | 7.4 |
| 1352 | 6.9 |
| 1353 | 6.4 |
| 1354 | 6.7 |
| 1355 | 7.2 |
| 1356 | 6.1 |
| 1357 | 5.3 |
| 1358 | 4.4 |
| 1359 | 3.1 |
| 1360 | 2.3 |
| 1361 | 1.8 |
| 1362 | 1.4 |
| 1363 | 1.5 |
| 1364 | 2 |
| 1365 | 2.7 |
| 1366 | 3.1 |
| 1367 | 4.1 |
| 1368 | 0.5 |
| 1369 | 1.3 |
| 1370 | 2 |
| 1371 | 2.3 |
| 1372 | 2.5 |
| 1373 | 3.6 |
| 1374 | 4 |
| 1375 | 3.4 |
| 1376 | 3.4 |
| 1377 | 3.3 |
| 1378 | 2.9 |
| 1379 | 2.7 |
| 1380 | 2.7 |
| 1381 | 3.3 |
| 1382 | 4 |
| 1383 | 4.2 |
| 1384 | 4.1 |
| 1385 | 4.1 |
| 1386 | 4.3 |
| 1387 | 5 |
| 1388 | 5.3 |
| 1389 | 5.4 |
| 1390 | 6.1 |
| 1391 | 6 |
| 1392 | 6.2 |
| 1393 | 6 |
| 1394 | 6.1 |
| 1395 | 6.4 |
| 1396 | 7.2 |
| 1397 | 7.7 |
| 1398 | 8.1 |
| 1399 | 9.1 |
| 1400 | 9 |
| 1401 | 8.9 |
| 1402 | 9.3 |
| 1403 | 9.8 |
| 1404 | 10.4 |
| 1405 | 10.5 |
| 1406 | 9.5 |
| 1407 | 8.7 |
| 1408 | 8.1 |
| 1409 | 7.6 |
| 1410 | 7.3 |
| 1411 | 7.6 |
| 1412 | 7.7 |
| 1413 | 7.9 |
| 1414 | 7.9 |
| 1415 | 8.6 |
| 1416 | 8.7 |
| 1417 | 8.7 |
| 1418 | 8.3 |
| 1419 | 7.7 |
| 1420 | 7.2 |
| 1421 | 6.7 |
| 1422 | 7.5 |
| 1423 | 9.8 |
| 1424 | 12.1 |
| 1425 | 12.5 |
| 1426 | 12.5 |
| 1427 | 11.6 |
| 1428 | 10.9 |
| 1429 | 10.8 |
| 1430 | 10.2 |
| 1431 | 10.3 |
| 1432 | 10.8 |
| 1433 | 11.3 |
| 1434 | 10.9 |
| 1435 | 12.2 |
| 1436 | 13.3 |
| 1437 | 13.2 |
| 1438 | 11.1 |
| 1439 | 9.6 |
| 1440 | 11.2 |
| 1441 | 9.4 |
| 1442 | 8.3 |
| 1443 | 8.7 |
| 1444 | 7.7 |
| 1445 | 6.7 |
| 1446 | 6.1 |
| 1447 | 7 |
| 1448 | 7.8 |
| 1449 | 8.1 |
| 1450 | 8.2 |
| 1451 | 8.4 |
| 1452 | 9 |
| 1453 | 9.6 |
| 1454 | 10.5 |
| 1455 | 9.8 |
| 1456 | 8.8 |
| 1457 | 8.9 |
| 1458 | 8.6 |
| 1459 | 7.4 |
| 1460 | 6.7 |
| 1461 | 5.6 |
| 1462 | 4.4 |
| 1463 | 5.1 |
| 1464 | 9.2 |
| 1465 | 7.8 |
| 1466 | 6.6 |
| 1467 | 5.9 |
| 1468 | 5.7 |
| 1469 | 5.3 |
| 1470 | 5.5 |
| 1471 | 5.2 |
| 1472 | 4.7 |
| 1473 | 4.2 |
| 1474 | 4.1 |
| 1475 | 5.3 |
| 1476 | 5.4 |
| 1477 | 4.9 |
| 1478 | 5.6 |
| 1479 | 6.3 |
| 1480 | 6.2 |
| 1481 | 5.5 |
| 1482 | 4.9 |
| 1483 | 4.6 |
| 1484 | 4 |
| 1485 | 2.3 |
| 1486 | 1.1 |
| 1487 | 3.5 |
| 1488 | 7.4 |
| 1489 | 7.7 |
| 1490 | 7.6 |
| 1491 | 7.6 |
| 1492 | 8 |
| 1493 | 7.6 |
| 1494 | 7.7 |
| 1495 | 7.4 |
| 1496 | 6.9 |
| 1497 | 6.9 |
| 1498 | 7.2 |
| 1499 | 7.1 |
| 1500 | 7.3 |
| 1501 | 7.4 |
| 1502 | 7.6 |
| 1503 | 7.6 |
| 1504 | 7.2 |
| 1505 | 7.1 |
| 1506 | 7.1 |
| 1507 | 7.2 |
| 1508 | 7.1 |
| 1509 | 6.5 |
| 1510 | 6.7 |
| 1511 | 7.2 |
| 1512 | 8.9 |
| 1513 | 8.6 |
| 1514 | 8.2 |
| 1515 | 8.2 |
| 1516 | 8.7 |
| 1517 | 7.8 |
| 1518 | 7.1 |
| 1519 | 8.1 |
| 1520 | 6.9 |
| 1521 | 6.7 |
| 1522 | 8.3 |
| 1523 | 7.7 |
| 1524 | 7.9 |
| 1525 | 7.5 |
| 1526 | 6.5 |
| 1527 | 6.7 |
| 1528 | 7.4 |
| 1529 | 7.1 |
| 1530 | 7.3 |
| 1531 | 6.4 |
| 1532 | 6 |
| 1533 | 6 |
| 1534 | 7.4 |
| 1535 | 7 |
| 1536 | 7.7 |
| 1537 | 7.8 |
| 1538 | 8.7 |
| 1539 | 9.1 |
| 1540 | 8 |
| 1541 | 6.4 |
| 1542 | 5.2 |
| 1543 | 4.8 |
| 1544 | 4.2 |
| 1545 | 5.1 |
| 1546 | 5.5 |
| 1547 | 6.6 |
| 1548 | 6.9 |
| 1549 | 9 |
| 1550 | 11.1 |
| 1551 | 11.6 |
| 1552 | 10.9 |
| 1553 | 9.9 |
| 1554 | 8.5 |
| 1555 | 8.6 |
| 1556 | 9.1 |
| 1557 | 11.1 |
| 1558 | 11.3 |
| 1559 | 11.9 |
| 1560 | 15.1 |
| 1561 | 16.2 |
| 1562 | 15.5 |
| 1563 | 13.6 |
| 1564 | 12.5 |
| 1565 | 11.8 |
| 1566 | 11.2 |
| 1567 | 11.1 |
| 1568 | 10.9 |
| 1569 | 10.5 |
| 1570 | 10.2 |
| 1571 | 9.8 |
| 1572 | 9.6 |
| 1573 | 9.6 |
| 1574 | 9.4 |
| 1575 | 10.8 |
| 1576 | 11.6 |
| 1577 | 9.4 |
| 1578 | 8.3 |
| 1579 | 8.2 |
| 1580 | 7.4 |
| 1581 | 7.3 |
| 1582 | 8.3 |
| 1583 | 8 |
| 1584 | 7.5 |
| 1585 | 7.4 |
| 1586 | 6.4 |
| 1587 | 6.3 |
| 1588 | 6.1 |
| 1589 | 6.6 |
| 1590 | 6.7 |
| 1591 | 6.3 |
| 1592 | 5.8 |
| 1593 | 5.3 |
| 1594 | 5 |
| 1595 | 5 |
| 1596 | 4.7 |
| 1597 | 5 |
| 1598 | 6.1 |
| 1599 | 4.7 |
| 1600 | 4.8 |
| 1601 | 4.9 |
| 1602 | 5 |
| 1603 | 4.1 |
| 1604 | 4.1 |
| 1605 | 4.2 |
| 1606 | 3.3 |
| 1607 | 2.9 |
| 1608 | 3.8 |
| 1609 | 4.1 |
| 1610 | 4.4 |
| 1611 | 4.7 |
| 1612 | 4.7 |
| 1613 | 4.4 |
| 1614 | 4.5 |
| 1615 | 4.8 |
| 1616 | 4.7 |
| 1617 | 4.7 |
| 1618 | 5 |
| 1619 | 5.3 |
| 1620 | 5.4 |
| 1621 | 5.4 |
| 1622 | 5.2 |
| 1623 | 5 |
| 1624 | 4.8 |
| 1625 | 4.1 |
| 1626 | 3.8 |
| 1627 | 4.3 |
| 1628 | 5.6 |
| 1629 | 6.6 |
| 1630 | 6.7 |
| 1631 | 6 |
| 1632 | 4.3 |
| 1633 | 3.8 |
| 1634 | 3 |
| 1635 | 2 |
| 1636 | 1.9 |
| 1637 | 2.4 |
| 1638 | 3.8 |
| 1639 | 4.1 |
| 1640 | 4.4 |
| 1641 | 4.6 |
| 1642 | 5 |
| 1643 | 5.4 |
| 1644 | 6.1 |
| 1645 | 7.2 |
| 1646 | 8 |
| 1647 | 8.3 |
| 1648 | 8.6 |
| 1649 | 8.8 |
| 1650 | 8.8 |
| 1651 | 8.8 |
| 1652 | 8.8 |
| 1653 | 9 |
| 1654 | 8.8 |
| 1655 | 8.9 |
| 1656 | 8.8 |
| 1657 | 8.4 |
| 1658 | 7 |
| 1659 | 5.9 |
| 1660 | 5.6 |
| 1661 | 5.4 |
| 1662 | 5.3 |
| 1663 | 3.7 |
| 1664 | 2.6 |
| 1665 | 3.7 |
| 1666 | 5.3 |
| 1667 | 5.8 |
| 1668 | 5.2 |
| 1669 | 4.1 |
| 1670 | 2.8 |
| 1671 | 2.2 |
| 1672 | 2.6 |
| 1673 | 3.2 |
| 1674 | 3.2 |
| 1675 | 3.1 |
| 1676 | 3.6 |
| 1677 | 3.9 |
| 1678 | 5 |
| 1679 | 5.6 |
| 1680 | 9 |
| 1681 | 9.1 |
| 1682 | 9 |
| 1683 | 8.5 |
| 1684 | 8.1 |
| 1685 | 8 |
| 1686 | 7.4 |
| 1687 | 8.3 |
| 1688 | 9 |
| 1689 | 8.6 |
| 1690 | 7.7 |
| 1691 | 8.3 |
| 1692 | 8.2 |
| 1693 | 7.4 |
| 1694 | 6.6 |
| 1695 | 7.2 |
| 1696 | 6.7 |
| 1697 | 5.7 |
| 1698 | 6.1 |
| 1699 | 6 |
| 1700 | 5.9 |
| 1701 | 6.2 |
| 1702 | 5.9 |
| 1703 | 6.1 |
| 1704 | 4.3 |
| 1705 | 4.2 |
| 1706 | 3.9 |
| 1707 | 3.7 |
| 1708 | 3.5 |
| 1709 | 3.2 |
| 1710 | 2.7 |
| 1711 | 2.6 |
| 1712 | 2.7 |
| 1713 | 2.8 |
| 1714 | 2.7 |
| 1715 | 2.6 |
| 1716 | 2.6 |
| 1717 | 2.1 |
| 1718 | 1.8 |
| 1719 | 1.5 |
| 1720 | 0.7 |
| 1721 | 0.5 |
| 1722 | 1.5 |
| 1723 | 2.3 |
| 1724 | 3.6 |
| 1725 | 4.7 |
| 1726 | 4.3 |
| 1727 | 4.1 |
| 1728 | 6 |
| 1729 | 7 |
| 1730 | 7.8 |
| 1731 | 8.7 |
| 1732 | 9.2 |
| 1733 | 9.3 |
| 1734 | 9.6 |
| 1735 | 9.6 |
| 1736 | 8.8 |
| 1737 | 8.4 |
| 1738 | 7.6 |
| 1739 | 7.1 |
| 1740 | 7.4 |
| 1741 | 6.2 |
| 1742 | 6.8 |
| 1743 | 6.6 |
| 1744 | 6.9 |
| 1745 | 7.4 |
| 1746 | 8.4 |
| 1747 | 7.8 |
| 1748 | 8 |
| 1749 | 9.3 |
| 1750 | 10 |
| 1751 | 10.1 |
| 1752 | 8.3 |
| 1753 | 8.5 |
| 1754 | 9 |
| 1755 | 8.7 |
| 1756 | 8.2 |
| 1757 | 7.8 |
| 1758 | 6.5 |
| 1759 | 6.3 |
| 1760 | 6.6 |
| 1761 | 5.5 |
| 1762 | 5.2 |
| 1763 | 5.2 |
| 1764 | 4.3 |
| 1765 | 3.7 |
| 1766 | 2.9 |
| 1767 | 2.1 |
| 1768 | 1.4 |
| 1769 | 1.1 |
| 1770 | 1.3 |
| 1771 | 1.8 |
| 1772 | 1.5 |
| 1773 | 1.3 |
| 1774 | 2.5 |
| 1775 | 3.5 |
| 1776 | 11.3 |
| 1777 | 11 |
| 1778 | 10.9 |
| 1779 | 10.5 |
| 1780 | 10.4 |
| 1781 | 10.4 |
| 1782 | 9.7 |
| 1783 | 10 |
| 1784 | 9.8 |
| 1785 | 9.8 |
| 1786 | 9.7 |
| 1787 | 8.6 |
| 1788 | 7.1 |
| 1789 | 8.3 |
| 1790 | 9.1 |
| 1791 | 9.4 |
| 1792 | 9.1 |
| 1793 | 8.8 |
| 1794 | 8.6 |
| 1795 | 8.2 |
| 1796 | 8.3 |
| 1797 | 8.8 |
| 1798 | 8.5 |
| 1799 | 7.3 |
| 1800 | 9.3 |
| 1801 | 8.5 |
| 1802 | 7.6 |
| 1803 | 6.8 |
| 1804 | 6.4 |
| 1805 | 6.5 |
| 1806 | 6.6 |
| 1807 | 8 |
| 1808 | 8.1 |
| 1809 | 7.1 |
| 1810 | 7.5 |
| 1811 | 8.1 |
| 1812 | 6.9 |
| 1813 | 6.6 |
| 1814 | 7.1 |
| 1815 | 7.2 |
| 1816 | 7 |
| 1817 | 6 |
| 1818 | 6 |
| 1819 | 6.9 |
| 1820 | 5 |
| 1821 | 4.4 |
| 1822 | 5.1 |
| 1823 | 4.4 |
| 1824 | 6.4 |
| 1825 | 6.7 |
| 1826 | 6.9 |
| 1827 | 7.6 |
| 1828 | 8.8 |
| 1829 | 9.5 |
| 1830 | 10.2 |
| 1831 | 10.8 |
| 1832 | 11.3 |
| 1833 | 11.5 |
| 1834 | 11.8 |
| 1835 | 11.8 |
| 1836 | 13 |
| 1837 | 12.9 |
| 1838 | 11.7 |
| 1839 | 10.8 |
| 1840 | 10.4 |
| 1841 | 9.6 |
| 1842 | 7.4 |
| 1843 | 6.5 |
| 1844 | 7.1 |
| 1845 | 7.3 |
| 1846 | 8.3 |
| 1847 | 9.2 |
| 1848 | 8.3 |
| 1849 | 10 |
| 1850 | 10.7 |
| 1851 | 10.3 |
| 1852 | 10.3 |
| 1853 | 8.5 |
| 1854 | 7 |
| 1855 | 6.7 |
| 1856 | 4.7 |
| 1857 | 4 |
| 1858 | 6.1 |
| 1859 | 6.9 |
| 1860 | 7.6 |
| 1861 | 8.8 |
| 1862 | 8.6 |
| 1863 | 8.9 |
| 1864 | 10.4 |
| 1865 | 9.4 |
| 1866 | 9.1 |
| 1867 | 8 |
| 1868 | 8.3 |
| 1869 | 8.7 |
| 1870 | 8.3 |
| 1871 | 8.2 |
| 1872 | 12.2 |
| 1873 | 11.4 |
| 1874 | 10.6 |
| 1875 | 10 |
| 1876 | 9.3 |
| 1877 | 8.7 |
| 1878 | 7.4 |
| 1879 | 6.9 |
| 1880 | 7.4 |
| 1881 | 8.3 |
| 1882 | 9 |
| 1883 | 8.8 |
| 1884 | 6.7 |
| 1885 | 7.7 |
| 1886 | 8.8 |
| 1887 | 8.3 |
| 1888 | 6.7 |
| 1889 | 5.4 |
| 1890 | 4.5 |
| 1891 | 4.3 |
| 1892 | 4.4 |
| 1893 | 7.1 |
| 1894 | 7.5 |
| 1895 | 8.2 |
| 1896 | 8.6 |
| 1897 | 8.9 |
| 1898 | 8.7 |
| 1899 | 8.9 |
| 1900 | 9.2 |
| 1901 | 9.1 |
| 1902 | 9.1 |
| 1903 | 9.3 |
| 1904 | 9.5 |
| 1905 | 9 |
| 1906 | 8.4 |
| 1907 | 7.4 |
| 1908 | 8 |
| 1909 | 8.4 |
| 1910 | 8.8 |
| 1911 | 9.1 |
| 1912 | 8.6 |
| 1913 | 6.8 |
| 1914 | 5.1 |
| 1915 | 6.2 |
| 1916 | 8.2 |
| 1917 | 9.1 |
| 1918 | 8.3 |
| 1919 | 8.2 |
| 1920 | 8.2 |
| 1921 | 8.9 |
| 1922 | 8.7 |
| 1923 | 7.9 |
| 1924 | 7.6 |
| 1925 | 7.7 |
| 1926 | 8.2 |
| 1927 | 8.7 |
| 1928 | 7.8 |
| 1929 | 7.6 |
| 1930 | 8.3 |
| 1931 | 8 |
| 1932 | 7.4 |
| 1933 | 6.8 |
| 1934 | 5.9 |
| 1935 | 5.5 |
| 1936 | 5.5 |
| 1937 | 5.9 |
| 1938 | 6 |
| 1939 | 5.5 |
| 1940 | 6.2 |
| 1941 | 8.3 |
| 1942 | 8.1 |
| 1943 | 7.6 |
| 1944 | 11.2 |
| 1945 | 11.2 |
| 1946 | 11.8 |
| 1947 | 10.9 |
| 1948 | 11 |
| 1949 | 9.1 |
| 1950 | 8.7 |
| 1951 | 8.5 |
| 1952 | 9.9 |
| 1953 | 9.3 |
| 1954 | 8.5 |
| 1955 | 8.6 |
| 1956 | 8.2 |
| 1957 | 7.8 |
| 1958 | 6.9 |
| 1959 | 6.6 |
| 1960 | 7.5 |
| 1961 | 8.6 |
| 1962 | 9.5 |
| 1963 | 10.3 |
| 1964 | 10.3 |
| 1965 | 10.5 |
| 1966 | 11.6 |
| 1967 | 12 |
| 1968 | 10.8 |
| 1969 | 11.1 |
| 1970 | 10.7 |
| 1971 | 9.9 |
| 1972 | 9.2 |
| 1973 | 8.3 |
| 1974 | 7.6 |
| 1975 | 7.9 |
| 1976 | 8.3 |
| 1977 | 8.3 |
| 1978 | 8.4 |
| 1979 | 8.5 |
| 1980 | 7.9 |
| 1981 | 7.3 |
| 1982 | 7.6 |
| 1983 | 8.1 |
| 1984 | 7.8 |
| 1985 | 7.5 |
| 1986 | 7.3 |
| 1987 | 7.1 |
| 1988 | 6.4 |
| 1989 | 6.1 |
| 1990 | 6.2 |
| 1991 | 5.5 |
| 1992 | 5.6 |
| 1993 | 5.7 |
| 1994 | 6 |
| 1995 | 6.2 |
| 1996 | 6.1 |
| 1997 | 5.7 |
| 1998 | 5.4 |
| 1999 | 5.9 |
| 2000 | 6.2 |
| 2001 | 5.6 |
| 2002 | 5.2 |
| 2003 | 5.2 |
| 2004 | 5.7 |
| 2005 | 5.8 |
| 2006 | 5.2 |
| 2007 | 5 |
| 2008 | 4.7 |
| 2009 | 4.1 |
| 2010 | 3.3 |
| 2011 | 2.8 |
| 2012 | 2.1 |
| 2013 | 1.5 |
| 2014 | 1 |
| 2015 | 0.8 |
| 2016 | 0.5 |
| 2017 | 0.3 |
| 2018 | 0.8 |
| 2019 | 1.9 |
| 2020 | 3.8 |
| 2021 | 4.9 |
| 2022 | 5.7 |
| 2023 | 5.9 |
| 2024 | 6.4 |
| 2025 | 6.4 |
| 2026 | 6.3 |
| 2027 | 6 |
| 2028 | 6.1 |
| 2029 | 6.1 |
| 2030 | 5.6 |
| 2031 | 4.9 |
| 2032 | 4.6 |
| 2033 | 5.4 |
| 2034 | 5.4 |
| 2035 | 6.5 |
| 2036 | 5.6 |
| 2037 | 6.6 |
| 2038 | 6.8 |
| 2039 | 7.5 |
| 2040 | 9.7 |
| 2041 | 9.1 |
| 2042 | 8.3 |
| 2043 | 7.9 |
| 2044 | 7.6 |
| 2045 | 7.3 |
| 2046 | 6.7 |
| 2047 | 7 |
| 2048 | 7.3 |
| 2049 | 7.4 |
| 2050 | 6.1 |
| 2051 | 4.1 |
| 2052 | 4.6 |
| 2053 | 6.6 |
| 2054 | 6.9 |
| 2055 | 6 |
| 2056 | 5.1 |
| 2057 | 4.8 |
| 2058 | 5.2 |
| 2059 | 5.7 |
| 2060 | 5.4 |
| 2061 | 5.5 |
| 2062 | 5.7 |
| 2063 | 5.8 |
| 2064 | 4.6 |
| 2065 | 5.1 |
| 2066 | 5.4 |
| 2067 | 5.7 |
| 2068 | 6.1 |
| 2069 | 6.7 |
| 2070 | 6.9 |
| 2071 | 7.2 |
| 2072 | 7.4 |
| 2073 | 7.1 |
| 2074 | 6.4 |
| 2075 | 5.8 |
| 2076 | 6.4 |
| 2077 | 7.7 |
| 2078 | 6.7 |
| 2079 | 7.8 |
| 2080 | 8 |
| 2081 | 7.7 |
| 2082 | 7.3 |
| 2083 | 7.3 |
| 2084 | 7.1 |
| 2085 | 7 |
| 2086 | 7.7 |
| 2087 | 8.3 |
| 2088 | 6.5 |
| 2089 | 5.2 |
| 2090 | 5.1 |
| 2091 | 5 |
| 2092 | 4.9 |
| 2093 | 5.3 |
| 2094 | 5.9 |
| 2095 | 7 |
| 2096 | 7.1 |
| 2097 | 6.7 |
| 2098 | 6.4 |
| 2099 | 7 |
| 2100 | 6.7 |
| 2101 | 7.1 |
| 2102 | 8.1 |
| 2103 | 9.9 |
| 2104 | 11.5 |
| 2105 | 12.2 |
| 2106 | 12.3 |
| 2107 | 12.1 |
| 2108 | 11.5 |
| 2109 | 10.8 |
| 2110 | 9.8 |
| 2111 | 8.8 |
| 2112 | 9.1 |
| 2113 | 8.3 |
| 2114 | 7.9 |
| 2115 | 7.4 |
| 2116 | 6.9 |
| 2117 | 6.2 |
| 2118 | 5.5 |
| 2119 | 6.5 |
| 2120 | 6.8 |
| 2121 | 6.5 |
| 2122 | 7 |
| 2123 | 7.5 |
| 2124 | 8.1 |
| 2125 | 9.3 |
| 2126 | 10.3 |
| 2127 | 11 |
| 2128 | 11.7 |
| 2129 | 11.9 |
| 2130 | 11.6 |
| 2131 | 11.1 |
| 2132 | 10.8 |
| 2133 | 10.5 |
| 2134 | 10.3 |
| 2135 | 8.9 |
| 2136 | 8.9 |
| 2137 | 7.5 |
| 2138 | 6.5 |
| 2139 | 6.3 |
| 2140 | 6.6 |
| 2141 | 6.6 |
| 2142 | 6.5 |
| 2143 | 7.5 |
| 2144 | 7.5 |
| 2145 | 7.1 |
| 2146 | 7 |
| 2147 | 7.6 |
| 2148 | 8.7 |
| 2149 | 9.4 |
| 2150 | 10.1 |
| 2151 | 10.2 |
| 2152 | 10.3 |
| 2153 | 10.8 |
| 2154 | 11.2 |
| 2155 | 11.3 |
| 2156 | 11 |
| 2157 | 10.5 |
| 2158 | 9.8 |
| 2159 | 8.8 |
| 2160 | 6 |
| 2161 | 4.6 |
| 2162 | 3.7 |
| 2163 | 2.9 |
| 2164 | 2.3 |
| 2165 | 1.8 |
| 2166 | 1 |
| 2167 | 1.9 |
| 2168 | 2.4 |
| 2169 | 2.5 |
| 2170 | 2.1 |
| 2171 | 2.7 |
| 2172 | 5.1 |
| 2173 | 7.4 |
| 2174 | 8 |
| 2175 | 8.6 |
| 2176 | 9.3 |
| 2177 | 9.9 |
| 2178 | 10 |
| 2179 | 10.2 |
| 2180 | 10 |
| 2181 | 9.6 |
| 2182 | 8.9 |
| 2183 | 8.1 |
| 2184 | 7.6 |
| 2185 | 6.1 |
| 2186 | 4.6 |
| 2187 | 3.6 |
| 2188 | 3.5 |
| 2189 | 3.8 |
| 2190 | 3.9 |
| 2191 | 2.2 |
| 2192 | 1.1 |
| 2193 | 2.5 |
| 2194 | 4.3 |
| 2195 | 3.3 |
| 2196 | 3.2 |
| 2197 | 3.1 |
| 2198 | 2.2 |
| 2199 | 1.7 |
| 2200 | 2 |
| 2201 | 3 |
| 2202 | 3.9 |
| 2203 | 4.8 |
| 2204 | 5.4 |
| 2205 | 5 |
| 2206 | 4.4 |
| 2207 | 4.4 |
| 2208 | 3 |
| 2209 | 3 |
| 2210 | 3.2 |
| 2211 | 3.3 |
| 2212 | 3.4 |
| 2213 | 3.7 |
| 2214 | 3.7 |
| 2215 | 4.3 |
| 2216 | 4.2 |
| 2217 | 4.9 |
| 2218 | 5.7 |
| 2219 | 5.7 |
| 2220 | 5.7 |
| 2221 | 5.6 |
| 2222 | 5.8 |
| 2223 | 7 |
| 2224 | 8.3 |
| 2225 | 8.8 |
| 2226 | 8.9 |
| 2227 | 9 |
| 2228 | 9.1 |
| 2229 | 10.3 |
| 2230 | 8.1 |
| 2231 | 11.8 |
| 2232 | 11.2 |
| 2233 | 11.4 |
| 2234 | 14.9 |
| 2235 | 14.1 |
| 2236 | 14 |
| 2237 | 13.9 |
| 2238 | 13 |
| 2239 | 12.6 |
| 2240 | 10.9 |
| 2241 | 11.5 |
| 2242 | 11.6 |
| 2243 | 13.8 |
| 2244 | 13.6 |
| 2245 | 13.8 |
| 2246 | 13.3 |
| 2247 | 13.7 |
| 2248 | 13.6 |
| 2249 | 11.8 |
| 2250 | 11.6 |
| 2251 | 11.4 |
| 2252 | 10.9 |
| 2253 | 10.1 |
| 2254 | 10.1 |
| 2255 | 8.8 |
| 2256 | 5.1 |
| 2257 | 7.1 |
| 2258 | 7.8 |
| 2259 | 6.2 |
| 2260 | 7.9 |
| 2261 | 9.6 |
| 2262 | 6.8 |
| 2263 | 11.2 |
| 2264 | 15.1 |
| 2265 | 17.1 |
| 2266 | 19.6 |
| 2267 | 19.3 |
| 2268 | 17.7 |
| 2269 | 15.7 |
| 2270 | 14.1 |
| 2271 | 12.4 |
| 2272 | 12.4 |
| 2273 | 11.9 |
| 2274 | 11 |
| 2275 | 11 |
| 2276 | 12.2 |
| 2277 | 11.5 |
| 2278 | 13.5 |
| 2279 | 16.3 |
| 2280 | 17.6 |
| 2281 | 17 |
| 2282 | 16.5 |
| 2283 | 16 |
| 2284 | 15.4 |
| 2285 | 15 |
| 2286 | 13.7 |
| 2287 | 13.1 |
| 2288 | 10.8 |
| 2289 | 11.1 |
| 2290 | 9.3 |
| 2291 | 9.9 |
| 2292 | 12.7 |
| 2293 | 14.5 |
| 2294 | 15.9 |
| 2295 | 16.4 |
| 2296 | 16.8 |
| 2297 | 16.3 |
| 2298 | 17.4 |
| 2299 | 19.4 |
| 2300 | 19.9 |
| 2301 | 17.3 |
| 2302 | 13.2 |
| 2303 | 9.8 |
| 2304 | 8.6 |
| 2305 | 8.8 |
| 2306 | 9.6 |
| 2307 | 10.3 |
| 2308 | 10.3 |
| 2309 | 10.1 |
| 2310 | 9.7 |
| 2311 | 8.3 |
| 2312 | 8.8 |
| 2313 | 9.3 |
| 2314 | 9 |
| 2315 | 8.4 |
| 2316 | 10.3 |
| 2317 | 10.6 |
| 2318 | 9.2 |
| 2319 | 9.8 |
| 2320 | 10.5 |
| 2321 | 10.5 |
| 2322 | 10.2 |
| 2323 | 10 |
| 2324 | 11.9 |
| 2325 | 11.9 |
| 2326 | 9.9 |
| 2327 | 10.2 |
| 2328 | 10.8 |
| 2329 | 10 |
| 2330 | 11.4 |
| 2331 | 10.7 |
| 2332 | 10.6 |
| 2333 | 10.3 |
| 2334 | 9.7 |
| 2335 | 8.2 |
| 2336 | 7.7 |
| 2337 | 7.6 |
| 2338 | 7.3 |
| 2339 | 6.6 |
| 2340 | 5.4 |
| 2341 | 4.4 |
| 2342 | 6.4 |
| 2343 | 6.3 |
| 2344 | 5.7 |
| 2345 | 4.8 |
| 2346 | 4.9 |
| 2347 | 5.2 |
| 2348 | 6.2 |
| 2349 | 6.2 |
| 2350 | 5.4 |
| 2351 | 6.3 |
| 2352 | 7 |
| 2353 | 7.2 |
| 2354 | 6.8 |
| 2355 | 7.7 |
| 2356 | 7.7 |
| 2357 | 7.4 |
| 2358 | 7 |
| 2359 | 7 |
| 2360 | 8.1 |
| 2361 | 9.6 |
| 2362 | 10.3 |
| 2363 | 10 |
| 2364 | 11 |
| 2365 | 10.7 |
| 2366 | 10.4 |
| 2367 | 10.1 |
| 2368 | 8.9 |
| 2369 | 7.7 |
| 2370 | 7.2 |
| 2371 | 7.3 |
| 2372 | 7.2 |
| 2373 | 7.4 |
| 2374 | 6.8 |
| 2375 | 7.3 |
| 2376 | 8.8 |
| 2377 | 8.8 |
| 2378 | 8.5 |
| 2379 | 8.7 |
| 2380 | 8.7 |
| 2381 | 7.9 |
| 2382 | 7.5 |
| 2383 | 6.6 |
| 2384 | 6.2 |
| 2385 | 6.1 |
| 2386 | 6.4 |
| 2387 | 6.6 |
| 2388 | 5.9 |
| 2389 | 5.1 |
| 2390 | 3.6 |
| 2391 | 2.8 |
| 2392 | 1.9 |
| 2393 | 0.6 |
| 2394 | 0.5 |
| 2395 | 0.6 |
| 2396 | 0.7 |
| 2397 | 0.7 |
| 2398 | 1.5 |
| 2399 | 2.3 |
| 2400 | 3.8 |
| 2401 | 4.3 |
| 2402 | 4.7 |
| 2403 | 4.9 |
| 2404 | 5 |
| 2405 | 5.5 |
| 2406 | 6.7 |
| 2407 | 6.6 |
| 2408 | 6.6 |
| 2409 | 7.2 |
| 2410 | 7.1 |
| 2411 | 6.8 |
| 2412 | 6.4 |
| 2413 | 5.9 |
| 2414 | 5.2 |
| 2415 | 4.5 |
| 2416 | 4.4 |
| 2417 | 5.1 |
| 2418 | 6.9 |
| 2419 | 8.9 |
| 2420 | 9.3 |
| 2421 | 8.6 |
| 2422 | 8 |
| 2423 | 7.5 |
| 2424 | 10.2 |
| 2425 | 7.6 |
| 2426 | 6 |
| 2427 | 5.5 |
| 2428 | 5.2 |
| 2429 | 5 |
| 2430 | 2.4 |
| 2431 | 2.8 |
| 2432 | 1.8 |
| 2433 | 2.2 |
| 2434 | 2.4 |
| 2435 | 1.6 |
| 2436 | 1.4 |
| 2437 | 1 |
| 2438 | 1.3 |
| 2439 | 2.5 |
| 2440 | 3.1 |
| 2441 | 3.6 |
| 2442 | 4.2 |
| 2443 | 4.9 |
| 2444 | 3.9 |
| 2445 | 3.8 |
| 2446 | 4.4 |
| 2447 | 4.6 |
| 2448 | 6.1 |
| 2449 | 6.6 |
| 2450 | 6.4 |
| 2451 | 6.7 |
| 2452 | 7.7 |
| 2453 | 8.2 |
| 2454 | 8.4 |
| 2455 | 9.1 |
| 2456 | 11.5 |
| 2457 | 12.2 |
| 2458 | 12.6 |
| 2459 | 11.7 |
| 2460 | 11.7 |
| 2461 | 10.3 |
| 2462 | 9 |
| 2463 | 7.8 |
| 2464 | 7.4 |
| 2465 | 7.2 |
| 2466 | 7.2 |
| 2467 | 7 |
| 2468 | 6.1 |
| 2469 | 6.5 |
| 2470 | 6.9 |
| 2471 | 7 |
| 2472 | 9.4 |
| 2473 | 9.5 |
| 2474 | 8.7 |
| 2475 | 8 |
| 2476 | 9.3 |
| 2477 | 8.6 |
| 2478 | 9.5 |
| 2479 | 12.2 |
| 2480 | 13 |
| 2481 | 15 |
| 2482 | 15.7 |
| 2483 | 13.4 |
| 2484 | 17.7 |
| 2485 | 16.7 |
| 2486 | 15.8 |
| 2487 | 14.3 |
| 2488 | 12.6 |
| 2489 | 11 |
| 2490 | 9.4 |
| 2491 | 9.6 |
| 2492 | 10.3 |
| 2493 | 11.3 |
| 2494 | 10.8 |
| 2495 | 11.4 |
| 2496 | 13.2 |
| 2497 | 11.9 |
| 2498 | 11.5 |
| 2499 | 11.5 |
| 2500 | 11 |
| 2501 | 10.7 |
| 2502 | 10.8 |
| 2503 | 10.7 |
| 2504 | 10 |
| 2505 | 10.5 |
| 2506 | 10.6 |
| 2507 | 10.1 |
| 2508 | 9.2 |
| 2509 | 8.7 |
| 2510 | 9 |
| 2511 | 10 |
| 2512 | 10.3 |
| 2513 | 9.4 |
| 2514 | 8.5 |
| 2515 | 6.9 |
| 2516 | 11.3 |
| 2517 | 14.2 |
| 2518 | 13.6 |
| 2519 | 12.5 |
| 2520 | 14.7 |
| 2521 | 15.6 |
| 2522 | 14.9 |
| 2523 | 12.7 |
| 2524 | 12.8 |
| 2525 | 15.9 |
| 2526 | 14.2 |
| 2527 | 11 |
| 2528 | 12 |
| 2529 | 12.6 |
| 2530 | 14.3 |
| 2531 | 13.9 |
| 2532 | 11.4 |
| 2533 | 9.8 |
| 2534 | 12.2 |
| 2535 | 13 |
| 2536 | 13 |
| 2537 | 10.1 |
| 2538 | 8.8 |
| 2539 | 9.8 |
| 2540 | 10.2 |
| 2541 | 10.2 |
| 2542 | 9.4 |
| 2543 | 8.5 |
| 2544 | 8.8 |
| 2545 | 10.6 |
| 2546 | 11.1 |
| 2547 | 11.5 |
| 2548 | 12.4 |
| 2549 | 12.8 |
| 2550 | 9.6 |
| 2551 | 7.9 |
| 2552 | 8.8 |
| 2553 | 9.5 |
| 2554 | 9.8 |
| 2555 | 9.5 |
| 2556 | 7.6 |
| 2557 | 6.7 |
| 2558 | 6.2 |
| 2559 | 7.4 |
| 2560 | 8.7 |
| 2561 | 7.9 |
| 2562 | 7.2 |
| 2563 | 6.8 |
| 2564 | 8.5 |
| 2565 | 9.3 |
| 2566 | 9.8 |
| 2567 | 8.7 |
| 2568 | 8.1 |
| 2569 | 7.9 |
| 2570 | 7.7 |
| 2571 | 7.2 |
| 2572 | 6.9 |
| 2573 | 7 |
| 2574 | 7.2 |
| 2575 | 7 |
| 2576 | 6.4 |
| 2577 | 5.8 |
| 2578 | 5.3 |
| 2579 | 5.9 |
| 2580 | 5.4 |
| 2581 | 5.6 |
| 2582 | 6.8 |
| 2583 | 7 |
| 2584 | 7.5 |
| 2585 | 7.5 |
| 2586 | 7.3 |
| 2587 | 7.4 |
| 2588 | 7.3 |
| 2589 | 7.9 |
| 2590 | 7.5 |
| 2591 | 7.3 |
| 2592 | 6.2 |
| 2593 | 6.3 |
| 2594 | 6.6 |
| 2595 | 7.1 |
| 2596 | 7.2 |
| 2597 | 7.5 |
| 2598 | 8.2 |
| 2599 | 8.9 |
| 2600 | 9.2 |
| 2601 | 9.2 |
| 2602 | 8.7 |
| 2603 | 8.1 |
| 2604 | 8.6 |
| 2605 | 9.2 |
| 2606 | 8.6 |
| 2607 | 8.4 |
| 2608 | 8 |
| 2609 | 7.5 |
| 2610 | 6.9 |
| 2611 | 6.2 |
| 2612 | 5.2 |
| 2613 | 4.3 |
| 2614 | 3.6 |
| 2615 | 3.8 |
| 2616 | 4.1 |
| 2617 | 4.5 |
| 2618 | 5.1 |
| 2619 | 5.7 |
| 2620 | 6 |
| 2621 | 6.4 |
| 2622 | 6.2 |
| 2623 | 5.8 |
| 2624 | 5.4 |
| 2625 | 5.2 |
| 2626 | 5.2 |
| 2627 | 5.2 |
| 2628 | 5.5 |
| 2629 | 5.9 |
| 2630 | 6.1 |
| 2631 | 6.2 |
| 2632 | 6.1 |
| 2633 | 6.4 |
| 2634 | 6.7 |
| 2635 | 6.2 |
| 2636 | 5.6 |
| 2637 | 6 |
| 2638 | 5.5 |
| 2639 | 5 |
| 2640 | 2.9 |
| 2641 | 2.8 |
| 2642 | 3.1 |
| 2643 | 4 |
| 2644 | 5 |
| 2645 | 5.6 |
| 2646 | 6.5 |
| 2647 | 7.6 |
| 2648 | 8 |
| 2649 | 7.7 |
| 2650 | 6.9 |
| 2651 | 6.6 |
| 2652 | 6.5 |
| 2653 | 6.3 |
| 2654 | 6.3 |
| 2655 | 6.5 |
| 2656 | 7.3 |
| 2657 | 8.4 |
| 2658 | 9.6 |
| 2659 | 9.8 |
| 2660 | 9.3 |
| 2661 | 8.6 |
| 2662 | 7.8 |
| 2663 | 6.6 |
| 2664 | 10.7 |
| 2665 | 8.7 |
| 2666 | 7.2 |
| 2667 | 6.1 |
| 2668 | 5.5 |
| 2669 | 5.4 |
| 2670 | 5.1 |
| 2671 | 2 |
| 2672 | 2.6 |
| 2673 | 3.8 |
| 2674 | 5.4 |
| 2675 | 7.5 |
| 2676 | 8.3 |
| 2677 | 8 |
| 2678 | 7.2 |
| 2679 | 7 |
| 2680 | 7.6 |
| 2681 | 8.1 |
| 2682 | 8.3 |
| 2683 | 8.6 |
| 2684 | 8.8 |
| 2685 | 8.8 |
| 2686 | 8.1 |
| 2687 | 7.1 |
| 2688 | 3.4 |
| 2689 | 3 |
| 2690 | 2.6 |
| 2691 | 1.8 |
| 2692 | 3.4 |
| 2693 | 4.8 |
| 2694 | 6.1 |
| 2695 | 6.2 |
| 2696 | 5.7 |
| 2697 | 5.4 |
| 2698 | 5.7 |
| 2699 | 5.7 |
| 2700 | 5.5 |
| 2701 | 5 |
| 2702 | 4.6 |
| 2703 | 4.4 |
| 2704 | 4.3 |
| 2705 | 4.2 |
| 2706 | 3.7 |
| 2707 | 3.2 |
| 2708 | 3 |
| 2709 | 3.8 |
| 2710 | 4.4 |
| 2711 | 4.4 |
| 2712 | 3.7 |
| 2713 | 4.4 |
| 2714 | 5.2 |
| 2715 | 6.2 |
| 2716 | 7.3 |
| 2717 | 8.2 |
| 2718 | 8.7 |
| 2719 | 9.1 |
| 2720 | 9.4 |
| 2721 | 9.3 |
| 2722 | 9.4 |
| 2723 | 9.6 |
| 2724 | 9.6 |
| 2725 | 9.3 |
| 2726 | 9.1 |
| 2727 | 9.1 |
| 2728 | 9.1 |
| 2729 | 9 |
| 2730 | 9 |
| 2731 | 9.2 |
| 2732 | 9.5 |
| 2733 | 9.9 |
| 2734 | 10.2 |
| 2735 | 10.3 |
| 2736 | 8.3 |
| 2737 | 8.9 |
| 2738 | 9.4 |
| 2739 | 9.7 |
| 2740 | 9.6 |
| 2741 | 9.4 |
| 2742 | 9 |
| 2743 | 9 |
| 2744 | 9 |
| 2745 | 8 |
| 2746 | 7.9 |
| 2747 | 7.3 |
| 2748 | 6.2 |
| 2749 | 6.9 |
| 2750 | 6.3 |
| 2751 | 6.1 |
| 2752 | 5.8 |
| 2753 | 5.8 |
| 2754 | 6.3 |
| 2755 | 6.2 |
| 2756 | 6.3 |
| 2757 | 4.6 |
| 2758 | 5.3 |
| 2759 | 5.7 |
| 2760 | 7.5 |
| 2761 | 7.4 |
| 2762 | 7.6 |
| 2763 | 7.9 |
| 2764 | 7.9 |
| 2765 | 7.6 |
| 2766 | 7.7 |
| 2767 | 6.9 |
| 2768 | 6.3 |
| 2769 | 6.5 |
| 2770 | 6.5 |
| 2771 | 6 |
| 2772 | 5.2 |
| 2773 | 6.6 |
| 2774 | 6 |
| 2775 | 6 |
| 2776 | 5.4 |
| 2777 | 5.5 |
| 2778 | 5 |
| 2779 | 4.8 |
| 2780 | 6.2 |
| 2781 | 5.5 |
| 2782 | 5.5 |
| 2783 | 6.6 |
| 2784 | 6.3 |
| 2785 | 5.8 |
| 2786 | 7.2 |
| 2787 | 6.7 |
| 2788 | 6.1 |
| 2789 | 5.8 |
| 2790 | 5.8 |
| 2791 | 6.3 |
| 2792 | 7.1 |
| 2793 | 7 |
| 2794 | 6.8 |
| 2795 | 6.6 |
| 2796 | 6.4 |
| 2797 | 6.1 |
| 2798 | 5.9 |
| 2799 | 5.3 |
| 2800 | 4.8 |
| 2801 | 4.5 |
| 2802 | 4.5 |
| 2803 | 4.5 |
| 2804 | 4.2 |
| 2805 | 4.1 |
| 2806 | 3.2 |
| 2807 | 3.1 |
| 2808 | 2.9 |
| 2809 | 3.2 |
| 2810 | 3.5 |
| 2811 | 3.7 |
| 2812 | 3.9 |
| 2813 | 4.5 |
| 2814 | 5.7 |
| 2815 | 6 |
| 2816 | 5.6 |
| 2817 | 6 |
| 2818 | 6.4 |
| 2819 | 6.4 |
| 2820 | 6 |
| 2821 | 5.6 |
| 2822 | 5.3 |
| 2823 | 4.4 |
| 2824 | 3.5 |
| 2825 | 2.7 |
| 2826 | 2.3 |
| 2827 | 4 |
| 2828 | 5 |
| 2829 | 4.3 |
| 2830 | 5 |
| 2831 | 5.9 |
| 2832 | 7 |
| 2833 | 6.8 |
| 2834 | 6.4 |
| 2835 | 5.8 |
| 2836 | 5.3 |
| 2837 | 4.6 |
| 2838 | 2.4 |
| 2839 | 2.4 |
| 2840 | 1.6 |
| 2841 | 1.5 |
| 2842 | 3.1 |
| 2843 | 6.4 |
| 2844 | 9 |
| 2845 | 9.5 |
| 2846 | 9.6 |
| 2847 | 9.4 |
| 2848 | 9.3 |
| 2849 | 9.6 |
| 2850 | 9.7 |
| 2851 | 9.7 |
| 2852 | 9.9 |
| 2853 | 9.7 |
| 2854 | 9.1 |
| 2855 | 8.4 |
| 2856 | 8.9 |
| 2857 | 8.3 |
| 2858 | 7.5 |
| 2859 | 6.7 |
| 2860 | 5.8 |
| 2861 | 4.3 |
| 2862 | 3.5 |
| 2863 | 4.2 |
| 2864 | 4.8 |
| 2865 | 4.4 |
| 2866 | 4.3 |
| 2867 | 4.2 |
| 2868 | 3.9 |
| 2869 | 3.4 |
| 2870 | 2.8 |
| 2871 | 2.2 |
| 2872 | 2.3 |
| 2873 | 2.8 |
| 2874 | 3.4 |
| 2875 | 4 |
| 2876 | 4.5 |
| 2877 | 4.9 |
| 2878 | 4.8 |
| 2879 | 4.9 |
| 2880 | 2.4 |
| 2881 | 2.4 |
| 2882 | 3.5 |
| 2883 | 4.2 |
| 2884 | 5.6 |
| 2885 | 6.4 |
| 2886 | 6.9 |
| 2887 | 7.4 |
| 2888 | 7.6 |
| 2889 | 7.7 |
| 2890 | 7.7 |
| 2891 | 7.4 |
| 2892 | 7.3 |
| 2893 | 7.8 |
| 2894 | 7.6 |
| 2895 | 7.5 |
| 2896 | 7.6 |
| 2897 | 7.4 |
| 2898 | 7.3 |
| 2899 | 6.6 |
| 2900 | 5.5 |
| 2901 | 5.3 |
| 2902 | 4.2 |
| 2903 | 3.3 |
| 2904 | 1 |
| 2905 | 2.2 |
| 2906 | 3.8 |
| 2907 | 4.8 |
| 2908 | 5.2 |
| 2909 | 5.4 |
| 2910 | 6 |
| 2911 | 7 |
| 2912 | 7.3 |
| 2913 | 7.7 |
| 2914 | 7.7 |
| 2915 | 7.6 |
| 2916 | 7.3 |
| 2917 | 7.1 |
| 2918 | 6.6 |
| 2919 | 6.1 |
| 2920 | 5.7 |
| 2921 | 5.4 |
| 2922 | 5 |
| 2923 | 3.7 |
| 2924 | 2.8 |
| 2925 | 3.1 |
| 2926 | 2.5 |
| 2927 | 2.1 |
| 2928 | 5.4 |
| 2929 | 5.8 |
| 2930 | 6.5 |
| 2931 | 7.2 |
| 2932 | 7.8 |
| 2933 | 8.1 |
| 2934 | 8.2 |
| 2935 | 8.5 |
| 2936 | 8.8 |
| 2937 | 9 |
| 2938 | 8.9 |
| 2939 | 9 |
| 2940 | 9.1 |
| 2941 | 8.9 |
| 2942 | 8.9 |
| 2943 | 8.8 |
| 2944 | 8.5 |
| 2945 | 8.3 |
| 2946 | 8.3 |
| 2947 | 8.1 |
| 2948 | 8.3 |
| 2949 | 8.2 |
| 2950 | 7.1 |
| 2951 | 6.6 |
| 2952 | 7.6 |
| 2953 | 7.3 |
| 2954 | 6.2 |
| 2955 | 6.2 |
| 2956 | 7.2 |
| 2957 | 7.9 |
| 2958 | 7.8 |
| 2959 | 7.7 |
| 2960 | 7.5 |
| 2961 | 6.9 |
| 2962 | 7.1 |
| 2963 | 6.9 |
| 2964 | 6.8 |
| 2965 | 6.5 |
| 2966 | 6.2 |
| 2967 | 6.2 |
| 2968 | 6.4 |
| 2969 | 6.1 |
| 2970 | 5.7 |
| 2971 | 5.2 |
| 2972 | 5.2 |
| 2973 | 5.2 |
| 2974 | 5.1 |
| 2975 | 4.7 |
| 2976 | 5.8 |
| 2977 | 5.9 |
| 2978 | 6.2 |
| 2979 | 6.5 |
| 2980 | 7.6 |
| 2981 | 8.9 |
| 2982 | 9.4 |
| 2983 | 9.2 |
| 2984 | 8.9 |
| 2985 | 8.5 |
| 2986 | 8.3 |
| 2987 | 8.4 |
| 2988 | 8.3 |
| 2989 | 8.5 |
| 2990 | 8.6 |
| 2991 | 8.7 |
| 2992 | 8.9 |
| 2993 | 8.7 |
| 2994 | 8.4 |
| 2995 | 8.8 |
| 2996 | 9.8 |
| 2997 | 10.4 |
| 2998 | 10.6 |
| 2999 | 9.8 |
| 3000 | 6.8 |
| 3001 | 7.6 |
| 3002 | 8.2 |
| 3003 | 9 |
| 3004 | 9.3 |
| 3005 | 9.1 |
| 3006 | 8.1 |
| 3007 | 7 |
| 3008 | 6.1 |
| 3009 | 5.9 |
| 3010 | 6.8 |
| 3011 | 6.6 |
| 3012 | 5.8 |
| 3013 | 4.2 |
| 3014 | 4.6 |
| 3015 | 5.5 |
| 3016 | 6.5 |
| 3017 | 6.8 |
| 3018 | 6 |
| 3019 | 6 |
| 3020 | 7.3 |
| 3021 | 6.9 |
| 3022 | 7.5 |
| 3023 | 8.3 |
| 3024 | 9.1 |
| 3025 | 9.4 |
| 3026 | 9.9 |
| 3027 | 11.3 |
| 3028 | 12 |
| 3029 | 11.8 |
| 3030 | 11.5 |
| 3031 | 11 |
| 3032 | 11.3 |
| 3033 | 10.6 |
| 3034 | 9.9 |
| 3035 | 9.8 |
| 3036 | 10.6 |
| 3037 | 10.6 |
| 3038 | 9.7 |
| 3039 | 10.8 |
| 3040 | 10.4 |
| 3041 | 10.5 |
| 3042 | 10.5 |
| 3043 | 10.6 |
| 3044 | 10.3 |
| 3045 | 11.1 |
| 3046 | 9.5 |
| 3047 | 9.5 |
| 3048 | 9 |
| 3049 | 9.1 |
| 3050 | 9.4 |
| 3051 | 9.3 |
| 3052 | 9.4 |
| 3053 | 10 |
| 3054 | 9.3 |
| 3055 | 8.8 |
| 3056 | 8.3 |
| 3057 | 8.4 |
| 3058 | 7.8 |
| 3059 | 7.4 |
| 3060 | 7.9 |
| 3061 | 7.8 |
| 3062 | 8.1 |
| 3063 | 8 |
| 3064 | 7.5 |
| 3065 | 7.4 |
| 3066 | 7.5 |
| 3067 | 7.1 |
| 3068 | 6.6 |
| 3069 | 6.5 |
| 3070 | 6.6 |
| 3071 | 5.9 |
| 3072 | 6.2 |
| 3073 | 6.3 |
| 3074 | 6.9 |
| 3075 | 7.9 |
| 3076 | 7.3 |
| 3077 | 7.5 |
| 3078 | 7 |
| 3079 | 6.7 |
| 3080 | 7.2 |
| 3081 | 7.3 |
| 3082 | 7.3 |
| 3083 | 7.2 |
| 3084 | 7.1 |
| 3085 | 7 |
| 3086 | 7 |
| 3087 | 6.9 |
| 3088 | 6.7 |
| 3089 | 6.5 |
| 3090 | 6.1 |
| 3091 | 5.7 |
| 3092 | 5.4 |
| 3093 | 4.6 |
| 3094 | 5.3 |
| 3095 | 5.2 |
| 3096 | 6 |
| 3097 | 6.8 |
| 3098 | 6.8 |
| 3099 | 6.8 |
| 3100 | 6.5 |
| 3101 | 6.3 |
| 3102 | 6.3 |
| 3103 | 6.9 |
| 3104 | 6.8 |
| 3105 | 6.5 |
| 3106 | 6.4 |
| 3107 | 6 |
| 3108 | 5.5 |
| 3109 | 4.8 |
| 3110 | 4.3 |
| 3111 | 5.5 |
| 3112 | 4.3 |
| 3113 | 4 |
| 3114 | 2.3 |
| 3115 | 3 |
| 3116 | 4.2 |
| 3117 | 4.7 |
| 3118 | 5 |
| 3119 | 5.3 |
| 3120 | 9.5 |
| 3121 | 9.5 |
| 3122 | 9.4 |
| 3123 | 8.9 |
| 3124 | 8.8 |
| 3125 | 8.4 |
| 3126 | 8.7 |
| 3127 | 9.2 |
| 3128 | 10.5 |
| 3129 | 11.3 |
| 3130 | 10.6 |
| 3131 | 10.6 |
| 3132 | 10 |
| 3133 | 9.6 |
| 3134 | 8.3 |
| 3135 | 7.1 |
| 3136 | 7.5 |
| 3137 | 7.9 |
| 3138 | 7.1 |
| 3139 | 7.5 |
| 3140 | 8.6 |
| 3141 | 7.8 |
| 3142 | 7.5 |
| 3143 | 7.2 |
| 3144 | 4 |
| 3145 | 5 |
| 3146 | 4.5 |
| 3147 | 5.3 |
| 3148 | 5.3 |
| 3149 | 5.3 |
| 3150 | 4.8 |
| 3151 | 5 |
| 3152 | 4.9 |
| 3153 | 4.7 |
| 3154 | 4.3 |
| 3155 | 4.3 |
| 3156 | 4.7 |
| 3157 | 4.2 |
| 3158 | 5.4 |
| 3159 | 5.8 |
| 3160 | 5 |
| 3161 | 3.9 |
| 3162 | 3.6 |
| 3163 | 3 |
| 3164 | 2.5 |
| 3165 | 2.5 |
| 3166 | 3.4 |
| 3167 | 3.4 |
| 3168 | 5 |
| 3169 | 5.3 |
| 3170 | 5.6 |
| 3171 | 5.8 |
| 3172 | 6.6 |
| 3173 | 6.9 |
| 3174 | 7.2 |
| 3175 | 6.9 |
| 3176 | 7.3 |
| 3177 | 7.3 |
| 3178 | 7.1 |
| 3179 | 6.2 |
| 3180 | 5.3 |
| 3181 | 5.9 |
| 3182 | 7 |
| 3183 | 8.2 |
| 3184 | 8.8 |
| 3185 | 8.1 |
| 3186 | 6.8 |
| 3187 | 8.3 |
| 3188 | 9.2 |
| 3189 | 8.2 |
| 3190 | 7.7 |
| 3191 | 8 |
| 3192 | 8.7 |
| 3193 | 9 |
| 3194 | 8.9 |
| 3195 | 8.8 |
| 3196 | 8.7 |
| 3197 | 8.7 |
| 3198 | 9.3 |
| 3199 | 9.5 |
| 3200 | 9.7 |
| 3201 | 10.3 |
| 3202 | 8.7 |
| 3203 | 9 |
| 3204 | 9.3 |
| 3205 | 8.9 |
| 3206 | 7 |
| 3207 | 7.2 |
| 3208 | 8.2 |
| 3209 | 7.4 |
| 3210 | 6.3 |
| 3211 | 7 |
| 3212 | 7.9 |
| 3213 | 7.9 |
| 3214 | 7.8 |
| 3215 | 9 |
| 3216 | 7.8 |
| 3217 | 8.5 |
| 3218 | 9.1 |
| 3219 | 9 |
| 3220 | 8 |
| 3221 | 7.4 |
| 3222 | 6.2 |
| 3223 | 5.5 |
| 3224 | 5.4 |
| 3225 | 7.2 |
| 3226 | 8.1 |
| 3227 | 8.5 |
| 3228 | 8 |
| 3229 | 7.2 |
| 3230 | 5.6 |
| 3231 | 5.6 |
| 3232 | 5.5 |
| 3233 | 5.3 |
| 3234 | 5.5 |
| 3235 | 3.3 |
| 3236 | 4.5 |
| 3237 | 5.7 |
| 3238 | 6.4 |
| 3239 | 6 |
| 3240 | 6.3 |
| 3241 | 6.4 |
| 3242 | 6.7 |
| 3243 | 6.9 |
| 3244 | 6.9 |
| 3245 | 6 |
| 3246 | 5.6 |
| 3247 | 6.2 |
| 3248 | 5.8 |
| 3249 | 5.4 |
| 3250 | 5 |
| 3251 | 5 |
| 3252 | 4.8 |
| 3253 | 4.4 |
| 3254 | 4.2 |
| 3255 | 3.4 |
| 3256 | 2.7 |
| 3257 | 1.6 |
| 3258 | 1.1 |
| 3259 | 2 |
| 3260 | 3.1 |
| 3261 | 2.8 |
| 3262 | 2.6 |
| 3263 | 3.1 |
| 3264 | 4.1 |
| 3265 | 4.6 |
| 3266 | 5 |
| 3267 | 6.2 |
| 3268 | 7.1 |
| 3269 | 7.3 |
| 3270 | 7.5 |
| 3271 | 6.6 |
| 3272 | 6.4 |
| 3273 | 6.4 |
| 3274 | 6.4 |
| 3275 | 6 |
| 3276 | 5.8 |
| 3277 | 5.4 |
| 3278 | 5 |
| 3279 | 5.9 |
| 3280 | 5.1 |
| 3281 | 5.5 |
| 3282 | 5.4 |
| 3283 | 3.7 |
| 3284 | 4.2 |
| 3285 | 5 |
| 3286 | 5.1 |
| 3287 | 5.5 |
| 3288 | 4.7 |
| 3289 | 5.1 |
| 3290 | 5.8 |
| 3291 | 6.3 |
| 3292 | 6.5 |
| 3293 | 6.8 |
| 3294 | 7 |
| 3295 | 7.1 |
| 3296 | 6.9 |
| 3297 | 6.7 |
| 3298 | 6.3 |
| 3299 | 5.5 |
| 3300 | 4.6 |
| 3301 | 4 |
| 3302 | 4.2 |
| 3303 | 4.8 |
| 3304 | 5.5 |
| 3305 | 6.1 |
| 3306 | 6.4 |
| 3307 | 6.2 |
| 3308 | 6.2 |
| 3309 | 6.9 |
| 3310 | 7.8 |
| 3311 | 7.6 |
| 3312 | 6.4 |
| 3313 | 6.5 |
| 3314 | 8.5 |
| 3315 | 8.4 |
| 3316 | 7.6 |
| 3317 | 6.8 |
| 3318 | 7.5 |
| 3319 | 8.5 |
| 3320 | 9.6 |
| 3321 | 9.8 |
| 3322 | 10.1 |
| 3323 | 9.8 |
| 3324 | 9.6 |
| 3325 | 10.4 |
| 3326 | 8.9 |
| 3327 | 7.9 |
| 3328 | 8.2 |
| 3329 | 7.5 |
| 3330 | 5.9 |
| 3331 | 6.9 |
| 3332 | 7.5 |
| 3333 | 7.4 |
| 3334 | 6.9 |
| 3335 | 6.1 |
| 3336 | 8.7 |
| 3337 | 8.5 |
| 3338 | 8.1 |
| 3339 | 8.1 |
| 3340 | 8.1 |
| 3341 | 8 |
| 3342 | 7.2 |
| 3343 | 6.6 |
| 3344 | 6.6 |
| 3345 | 6.8 |
| 3346 | 6.4 |
| 3347 | 6.4 |
| 3348 | 5.5 |
| 3349 | 5.5 |
| 3350 | 6.8 |
| 3351 | 6.9 |
| 3352 | 6.7 |
| 3353 | 6.7 |
| 3354 | 5.5 |
| 3355 | 5.2 |
| 3356 | 4.8 |
| 3357 | 4.9 |
| 3358 | 5 |
| 3359 | 6 |
| 3360 | 9.6 |
| 3361 | 9 |
| 3362 | 8.8 |
| 3363 | 9 |
| 3364 | 7.9 |
| 3365 | 7.4 |
| 3366 | 7.6 |
| 3367 | 8.1 |
| 3368 | 7 |
| 3369 | 7.3 |
| 3370 | 7.9 |
| 3371 | 7.9 |
| 3372 | 7.5 |
| 3373 | 7 |
| 3374 | 7 |
| 3375 | 5.9 |
| 3376 | 5.5 |
| 3377 | 6.2 |
| 3378 | 6.4 |
| 3379 | 5 |
| 3380 | 3.2 |
| 3381 | 3.3 |
| 3382 | 3.3 |
| 3383 | 4.2 |
| 3384 | 1.9 |
| 3385 | 3.3 |
| 3386 | 3.5 |
| 3387 | 4.3 |
| 3388 | 5.3 |
| 3389 | 6 |
| 3390 | 6.9 |
| 3391 | 7.3 |
| 3392 | 7 |
| 3393 | 6.4 |
| 3394 | 6.6 |
| 3395 | 6.5 |
| 3396 | 5.8 |
| 3397 | 5.2 |
| 3398 | 5 |
| 3399 | 5.6 |
| 3400 | 5.3 |
| 3401 | 4.6 |
| 3402 | 4.4 |
| 3403 | 5.3 |
| 3404 | 7 |
| 3405 | 7.5 |
| 3406 | 7.2 |
| 3407 | 8.4 |
| 3408 | 8.8 |
| 3409 | 8.3 |
| 3410 | 7.8 |
| 3411 | 6.9 |
| 3412 | 6.9 |
| 3413 | 6.9 |
| 3414 | 7.5 |
| 3415 | 8.5 |
| 3416 | 9 |
| 3417 | 9.1 |
| 3418 | 8.7 |
| 3419 | 7.7 |
| 3420 | 6.8 |
| 3421 | 5.9 |
| 3422 | 5 |
| 3423 | 5.5 |
| 3424 | 5.6 |
| 3425 | 6.1 |
| 3426 | 7.5 |
| 3427 | 6.5 |
| 3428 | 5.3 |
| 3429 | 5 |
| 3430 | 6.1 |
| 3431 | 6.4 |
| 3432 | 4.8 |
| 3433 | 4.4 |
| 3434 | 6.4 |
| 3435 | 7.2 |
| 3436 | 9 |
| 3437 | 10.1 |
| 3438 | 10.9 |
| 3439 | 10 |
| 3440 | 9.5 |
| 3441 | 9.4 |
| 3442 | 9 |
| 3443 | 8 |
| 3444 | 7.8 |
| 3445 | 7.4 |
| 3446 | 7.4 |
| 3447 | 7 |
| 3448 | 6.7 |
| 3449 | 7 |
| 3450 | 7.9 |
| 3451 | 7.9 |
| 3452 | 8.1 |
| 3453 | 7.7 |
| 3454 | 7.3 |
| 3455 | 6.8 |
| 3456 | 6.7 |
| 3457 | 6.6 |
| 3458 | 7.2 |
| 3459 | 7.5 |
| 3460 | 8.1 |
| 3461 | 8.1 |
| 3462 | 7.9 |
| 3463 | 7.6 |
| 3464 | 8.5 |
| 3465 | 9 |
| 3466 | 8.6 |
| 3467 | 8.4 |
| 3468 | 7.2 |
| 3469 | 6.7 |
| 3470 | 8.2 |
| 3471 | 8.2 |
| 3472 | 7.7 |
| 3473 | 7.6 |
| 3474 | 5.7 |
| 3475 | 4.4 |
| 3476 | 6.7 |
| 3477 | 7.1 |
| 3478 | 7.4 |
| 3479 | 7 |
| 3480 | 6.4 |
| 3481 | 6 |
| 3482 | 6.1 |
| 3483 | 6.3 |
| 3484 | 6.7 |
| 3485 | 7.3 |
| 3486 | 7.5 |
| 3487 | 7.9 |
| 3488 | 8.4 |
| 3489 | 8.8 |
| 3490 | 8.3 |
| 3491 | 7 |
| 3492 | 6.2 |
| 3493 | 5.6 |
| 3494 | 4.9 |
| 3495 | 4.4 |
| 3496 | 3.9 |
| 3497 | 3.7 |
| 3498 | 1.4 |
| 3499 | 2 |
| 3500 | 1.3 |
| 3501 | 2.1 |
| 3502 | 2.3 |
| 3503 | 4.1 |
| 3504 | 4.5 |
| 3505 | 5.5 |
| 3506 | 6.2 |
| 3507 | 6.3 |
| 3508 | 6.6 |
| 3509 | 7 |
| 3510 | 6.9 |
| 3511 | 6.9 |
| 3512 | 6.6 |
| 3513 | 6.2 |
| 3514 | 5.6 |
| 3515 | 5.5 |
| 3516 | 5.6 |
| 3517 | 5.4 |
| 3518 | 4.8 |
| 3519 | 4.4 |
| 3520 | 3.7 |
| 3521 | 3.5 |
| 3522 | 3.5 |
| 3523 | 3.9 |
| 3524 | 4.5 |
| 3525 | 5.2 |
| 3526 | 5.7 |
| 3527 | 5.5 |
| 3528 | 7.3 |
| 3529 | 7.8 |
| 3530 | 8.7 |
| 3531 | 9.1 |
| 3532 | 9.1 |
| 3533 | 9 |
| 3534 | 8.3 |
| 3535 | 7.9 |
| 3536 | 7 |
| 3537 | 6 |
| 3538 | 6.3 |
| 3539 | 6.9 |
| 3540 | 8.2 |
| 3541 | 8.3 |
| 3542 | 8.1 |
| 3543 | 7.7 |
| 3544 | 7.4 |
| 3545 | 6.8 |
| 3546 | 6.8 |
| 3547 | 8.1 |
| 3548 | 8.3 |
| 3549 | 6.6 |
| 3550 | 7.1 |
| 3551 | 7.6 |
| 3552 | 7.8 |
| 3553 | 7.6 |
| 3554 | 8.1 |
| 3555 | 8.1 |
| 3556 | 8.8 |
| 3557 | 8.9 |
| 3558 | 9.2 |
| 3559 | 9.3 |
| 3560 | 9 |
| 3561 | 8.3 |
| 3562 | 8.7 |
| 3563 | 8.4 |
| 3564 | 7.8 |
| 3565 | 7.8 |
| 3566 | 7.9 |
| 3567 | 6.9 |
| 3568 | 6.1 |
| 3569 | 5.6 |
| 3570 | 5.6 |
| 3571 | 5.8 |
| 3572 | 7.5 |
| 3573 | 5.8 |
| 3574 | 5.5 |
| 3575 | 6.7 |
| 3576 | 5.7 |
| 3577 | 5.7 |
| 3578 | 6.2 |
| 3579 | 6.6 |
| 3580 | 6.6 |
| 3581 | 6.6 |
| 3582 | 6.3 |
| 3583 | 5.6 |
| 3584 | 5.4 |
| 3585 | 5.1 |
| 3586 | 5 |
| 3587 | 5.1 |
| 3588 | 4.7 |
| 3589 | 4.2 |
| 3590 | 4.3 |
| 3591 | 4.4 |
| 3592 | 4.6 |
| 3593 | 4.6 |
| 3594 | 4.6 |
| 3595 | 4.1 |
| 3596 | 3.5 |
| 3597 | 3 |
| 3598 | 3.4 |
| 3599 | 3.6 |
| 3600 | 5 |
| 3601 | 5 |
| 3602 | 5.6 |
| 3603 | 6.3 |
| 3604 | 7.1 |
| 3605 | 8.4 |
| 3606 | 9.1 |
| 3607 | 9.2 |
| 3608 | 9.4 |
| 3609 | 9.4 |
| 3610 | 9.3 |
| 3611 | 9 |
| 3612 | 8.5 |
| 3613 | 8.1 |
| 3614 | 8.2 |
| 3615 | 8.3 |
| 3616 | 8 |
| 3617 | 7.2 |
| 3618 | 6.6 |
| 3619 | 6.4 |
| 3620 | 6.1 |
| 3621 | 6.3 |
| 3622 | 7.3 |
| 3623 | 7.9 |
| 3624 | 7.9 |
| 3625 | 8.5 |
| 3626 | 8.7 |
| 3627 | 9.2 |
| 3628 | 10.3 |
| 3629 | 10.9 |
| 3630 | 11.2 |
| 3631 | 11.5 |
| 3632 | 11.4 |
| 3633 | 11.5 |
| 3634 | 11.7 |
| 3635 | 11.9 |
| 3636 | 12 |
| 3637 | 12.2 |
| 3638 | 11.7 |
| 3639 | 10.9 |
| 3640 | 10.6 |
| 3641 | 10.8 |
| 3642 | 11.2 |
| 3643 | 11.7 |
| 3644 | 11.1 |
| 3645 | 12.2 |
| 3646 | 10.4 |
| 3647 | 8.5 |
| 3648 | 6.8 |
| 3649 | 7.6 |
| 3650 | 8.4 |
| 3651 | 8.4 |
| 3652 | 9 |
| 3653 | 10.1 |
| 3654 | 9.9 |
| 3655 | 9.6 |
| 3656 | 9.9 |
| 3657 | 9.8 |
| 3658 | 9.9 |
| 3659 | 10.2 |
| 3660 | 10.4 |
| 3661 | 10.1 |
| 3662 | 10.4 |
| 3663 | 8.6 |
| 3664 | 7.8 |
| 3665 | 7.9 |
| 3666 | 8.3 |
| 3667 | 8.6 |
| 3668 | 8.6 |
| 3669 | 7.7 |
| 3670 | 7.7 |
| 3671 | 7.7 |
| 3672 | 3.1 |
| 3673 | 4 |
| 3674 | 5 |
| 3675 | 5.7 |
| 3676 | 6.3 |
| 3677 | 7 |
| 3678 | 7.8 |
| 3679 | 7.8 |
| 3680 | 7.8 |
| 3681 | 8.4 |
| 3682 | 8.7 |
| 3683 | 8.6 |
| 3684 | 8.6 |
| 3685 | 8.5 |
| 3686 | 8.4 |
| 3687 | 7.8 |
| 3688 | 6.9 |
| 3689 | 6.6 |
| 3690 | 6.2 |
| 3691 | 5.1 |
| 3692 | 4.4 |
| 3693 | 3.7 |
| 3694 | 2.4 |
| 3695 | 2.4 |
| 3696 | 1.3 |
| 3697 | 2.2 |
| 3698 | 3.7 |
| 3699 | 5.1 |
| 3700 | 5.8 |
| 3701 | 6.4 |
| 3702 | 7 |
| 3703 | 7.2 |
| 3704 | 7.7 |
| 3705 | 8.3 |
| 3706 | 8.1 |
| 3707 | 7.4 |
| 3708 | 6.3 |
| 3709 | 5.6 |
| 3710 | 5.1 |
| 3711 | 4.4 |
| 3712 | 3.8 |
| 3713 | 3.2 |
| 3714 | 3.2 |
| 3715 | 4.5 |
| 3716 | 5.1 |
| 3717 | 4.7 |
| 3718 | 3.4 |
| 3719 | 2.8 |
| 3720 | 5.6 |
| 3721 | 6.7 |
| 3722 | 7 |
| 3723 | 7.5 |
| 3724 | 7.8 |
| 3725 | 8.2 |
| 3726 | 8.4 |
| 3727 | 9.6 |
| 3728 | 9.2 |
| 3729 | 8.8 |
| 3730 | 8.2 |
| 3731 | 8.1 |
| 3732 | 8.2 |
| 3733 | 7.1 |
| 3734 | 6.6 |
| 3735 | 9.7 |
| 3736 | 11.9 |
| 3737 | 11.4 |
| 3738 | 10.9 |
| 3739 | 9.8 |
| 3740 | 8.2 |
| 3741 | 7.1 |
| 3742 | 5.9 |
| 3743 | 5.7 |
| 3744 | 6.6 |
| 3745 | 6.7 |
| 3746 | 6.9 |
| 3747 | 7.6 |
| 3748 | 8.1 |
| 3749 | 7.8 |
| 3750 | 6.7 |
| 3751 | 5.7 |
| 3752 | 7.3 |
| 3753 | 7.8 |
| 3754 | 7.9 |
| 3755 | 7.7 |
| 3756 | 8 |
| 3757 | 9 |
| 3758 | 9.1 |
| 3759 | 8.8 |
| 3760 | 8.4 |
| 3761 | 7.7 |
| 3762 | 7.2 |
| 3763 | 7.4 |
| 3764 | 6.7 |
| 3765 | 4.9 |
| 3766 | 4.3 |
| 3767 | 3.8 |
| 3768 | 4 |
| 3769 | 4.6 |
| 3770 | 5.1 |
| 3771 | 5.2 |
| 3772 | 5.2 |
| 3773 | 6 |
| 3774 | 7 |
| 3775 | 7.6 |
| 3776 | 7.5 |
| 3777 | 7.1 |
| 3778 | 7 |
| 3779 | 6.9 |
| 3780 | 6.4 |
| 3781 | 5.9 |
| 3782 | 6.1 |
| 3783 | 5.2 |
| 3784 | 4.5 |
| 3785 | 4.8 |
| 3786 | 5.8 |
| 3787 | 6.3 |
| 3788 | 4.4 |
| 3789 | 3.5 |
| 3790 | 3.8 |
| 3791 | 3.7 |
| 3792 | 4.8 |
| 3793 | 5 |
| 3794 | 5 |
| 3795 | 5.3 |
| 3796 | 7 |
| 3797 | 7.7 |
| 3798 | 8.6 |
| 3799 | 8.7 |
| 3800 | 8 |
| 3801 | 7.5 |
| 3802 | 7 |
| 3803 | 6.2 |
| 3804 | 5.7 |
| 3805 | 5.6 |
| 3806 | 6.6 |
| 3807 | 8.1 |
| 3808 | 8.7 |
| 3809 | 8.8 |
| 3810 | 8.3 |
| 3811 | 7.2 |
| 3812 | 5.1 |
| 3813 | 3.4 |
| 3814 | 4.6 |
| 3815 | 5.2 |
| 3816 | 5 |
| 3817 | 5 |
| 3818 | 5.1 |
| 3819 | 5.3 |
| 3820 | 5.6 |
| 3821 | 6.3 |
| 3822 | 6.7 |
| 3823 | 7.7 |
| 3824 | 8 |
| 3825 | 8.6 |
| 3826 | 9 |
| 3827 | 9 |
| 3828 | 7.4 |
| 3829 | 6.3 |
| 3830 | 5 |
| 3831 | 4.3 |
| 3832 | 4.4 |
| 3833 | 4.1 |
| 3834 | 2.4 |
| 3835 | 2.1 |
| 3836 | 1.9 |
| 3837 | 1 |
| 3838 | 1.6 |
| 3839 | 2 |
| 3840 | 2.9 |
| 3841 | 3.8 |
| 3842 | 4.4 |
| 3843 | 5.1 |
| 3844 | 5.6 |
| 3845 | 6.2 |
| 3846 | 6.7 |
| 3847 | 7.3 |
| 3848 | 7 |
| 3849 | 6.9 |
| 3850 | 7.5 |
| 3851 | 7.9 |
| 3852 | 8.2 |
| 3853 | 8.1 |
| 3854 | 7.9 |
| 3855 | 7.8 |
| 3856 | 7.7 |
| 3857 | 7.4 |
| 3858 | 7.2 |
| 3859 | 7 |
| 3860 | 7 |
| 3861 | 6.8 |
| 3862 | 6.7 |
| 3863 | 6.2 |
| 3864 | 5.7 |
| 3865 | 6.3 |
| 3866 | 6.8 |
| 3867 | 7.3 |
| 3868 | 7.8 |
| 3869 | 8 |
| 3870 | 8 |
| 3871 | 8 |
| 3872 | 7.8 |
| 3873 | 7.4 |
| 3874 | 7.5 |
| 3875 | 7.8 |
| 3876 | 8.1 |
| 3877 | 8.3 |
| 3878 | 8.2 |
| 3879 | 7.8 |
| 3880 | 7.3 |
| 3881 | 7.1 |
| 3882 | 7.1 |
| 3883 | 7 |
| 3884 | 6.3 |
| 3885 | 6.2 |
| 3886 | 5.9 |
| 3887 | 5.6 |
| 3888 | 6.5 |
| 3889 | 6.9 |
| 3890 | 7.1 |
| 3891 | 7.1 |
| 3892 | 7.1 |
| 3893 | 7.8 |
| 3894 | 8.2 |
| 3895 | 8.1 |
| 3896 | 7.8 |
| 3897 | 7.7 |
| 3898 | 7.4 |
| 3899 | 7.6 |
| 3900 | 7.4 |
| 3901 | 7.6 |
| 3902 | 8.2 |
| 3903 | 7.9 |
| 3904 | 6.8 |
| 3905 | 6 |
| 3906 | 5.3 |
| 3907 | 5.2 |
| 3908 | 5.7 |
| 3909 | 6.8 |
| 3910 | 7.1 |
| 3911 | 7.4 |
| 3912 | 7.8 |
| 3913 | 7.8 |
| 3914 | 7.7 |
| 3915 | 8.4 |
| 3916 | 8.5 |
| 3917 | 8.1 |
| 3918 | 7.8 |
| 3919 | 7.9 |
| 3920 | 8.2 |
| 3921 | 8.3 |
| 3922 | 8.3 |
| 3923 | 8 |
| 3924 | 7.6 |
| 3925 | 7.8 |
| 3926 | 7.9 |
| 3927 | 7.8 |
| 3928 | 7.7 |
| 3929 | 7.2 |
| 3930 | 6.7 |
| 3931 | 6.6 |
| 3932 | 5.7 |
| 3933 | 5.4 |
| 3934 | 4.9 |
| 3935 | 4.6 |
| 3936 | 5.1 |
| 3937 | 5.6 |
| 3938 | 6.6 |
| 3939 | 8 |
| 3940 | 9.2 |
| 3941 | 9.4 |
| 3942 | 9.1 |
| 3943 | 8.8 |
| 3944 | 8.7 |
| 3945 | 8.6 |
| 3946 | 8.6 |
| 3947 | 8.5 |
| 3948 | 8.5 |
| 3949 | 8.2 |
| 3950 | 7.8 |
| 3951 | 7.4 |
| 3952 | 7.1 |
| 3953 | 7.1 |
| 3954 | 7.1 |
| 3955 | 7 |
| 3956 | 6.3 |
| 3957 | 5.7 |
| 3958 | 6 |
| 3959 | 6.4 |
| 3960 | 2.1 |
| 3961 | 3 |
| 3962 | 4 |
| 3963 | 4.7 |
| 3964 | 5.2 |
| 3965 | 5.5 |
| 3966 | 6.2 |
| 3967 | 7.4 |
| 3968 | 7.6 |
| 3969 | 7.2 |
| 3970 | 7.2 |
| 3971 | 7.1 |
| 3972 | 7.2 |
| 3973 | 7.4 |
| 3974 | 7.6 |
| 3975 | 7.8 |
| 3976 | 7.9 |
| 3977 | 7.8 |
| 3978 | 7.5 |
| 3979 | 7.1 |
| 3980 | 6.6 |
| 3981 | 5.9 |
| 3982 | 5.2 |
| 3983 | 5 |
| 3984 | 2.9 |
| 3985 | 2.9 |
| 3986 | 3 |
| 3987 | 3.5 |
| 3988 | 4.2 |
| 3989 | 4.5 |
| 3990 | 5.5 |
| 3991 | 6.2 |
| 3992 | 5.9 |
| 3993 | 6 |
| 3994 | 6 |
| 3995 | 5.7 |
| 3996 | 5.7 |
| 3997 | 6 |
| 3998 | 6.1 |
| 3999 | 6 |
| 4000 | 5.6 |
| 4001 | 5.3 |
| 4002 | 4.9 |
| 4003 | 4.4 |
| 4004 | 3.8 |
| 4005 | 3.2 |
| 4006 | 2.3 |
| 4007 | 2 |
| 4008 | 2.6 |
| 4009 | 3.5 |
| 4010 | 4.7 |
| 4011 | 5.4 |
| 4012 | 5.9 |
| 4013 | 7 |
| 4014 | 6.9 |
| 4015 | 7 |
| 4016 | 7.9 |
| 4017 | 8.6 |
| 4018 | 8.7 |
| 4019 | 8.4 |
| 4020 | 7.6 |
| 4021 | 6.9 |
| 4022 | 7 |
| 4023 | 6.6 |
| 4024 | 6.4 |
| 4025 | 5.6 |
| 4026 | 5.1 |
| 4027 | 4.3 |
| 4028 | 3.4 |
| 4029 | 2 |
| 4030 | 0.7 |
| 4031 | 1.3 |
| 4032 | 3 |
| 4033 | 3.7 |
| 4034 | 3.5 |
| 4035 | 4.2 |
| 4036 | 4.9 |
| 4037 | 4.8 |
| 4038 | 5.7 |
| 4039 | 6.1 |
| 4040 | 5.6 |
| 4041 | 5.2 |
| 4042 | 5.8 |
| 4043 | 6.1 |
| 4044 | 6.6 |
| 4045 | 6.6 |
| 4046 | 6.4 |
| 4047 | 6.6 |
| 4048 | 6.4 |
| 4049 | 5.7 |
| 4050 | 4.9 |
| 4051 | 4.2 |
| 4052 | 3.8 |
| 4053 | 4 |
| 4054 | 4 |
| 4055 | 3.3 |
| 4056 | 2.4 |
| 4057 | 2.7 |
| 4058 | 3.4 |
| 4059 | 4.1 |
| 4060 | 5.4 |
| 4061 | 6.6 |
| 4062 | 7.8 |
| 4063 | 8.2 |
| 4064 | 8.7 |
| 4065 | 8.9 |
| 4066 | 9.3 |
| 4067 | 9.3 |
| 4068 | 9.3 |
| 4069 | 9.4 |
| 4070 | 9.9 |
| 4071 | 9.5 |
| 4072 | 8.8 |
| 4073 | 9 |
| 4074 | 9.2 |
| 4075 | 8.4 |
| 4076 | 7.5 |
| 4077 | 6.8 |
| 4078 | 5.8 |
| 4079 | 5.8 |
| 4080 | 6.5 |
| 4081 | 6.2 |
| 4082 | 6.7 |
| 4083 | 7.4 |
| 4084 | 8.2 |
| 4085 | 8.7 |
| 4086 | 8.6 |
| 4087 | 8.4 |
| 4088 | 8.1 |
| 4089 | 7.8 |
| 4090 | 7.4 |
| 4091 | 7.3 |
| 4092 | 7.6 |
| 4093 | 7 |
| 4094 | 6.4 |
| 4095 | 6 |
| 4096 | 5.9 |
| 4097 | 6.1 |
| 4098 | 6.5 |
| 4099 | 6 |
| 4100 | 5.1 |
| 4101 | 5.5 |
| 4102 | 6 |
| 4103 | 6.9 |
| 4104 | 7.1 |
| 4105 | 8.1 |
| 4106 | 8.6 |
| 4107 | 8.9 |
| 4108 | 8.5 |
| 4109 | 8.4 |
| 4110 | 8 |
| 4111 | 7.4 |
| 4112 | 7.7 |
| 4113 | 8.2 |
| 4114 | 8.7 |
| 4115 | 8.8 |
| 4116 | 8.9 |
| 4117 | 9 |
| 4118 | 9.2 |
| 4119 | 9.3 |
| 4120 | 9 |
| 4121 | 9 |
| 4122 | 8.9 |
| 4123 | 8.7 |
| 4124 | 8.3 |
| 4125 | 7.5 |
| 4126 | 6.6 |
| 4127 | 5.4 |
| 4128 | 4.8 |
| 4129 | 5.3 |
| 4130 | 6.1 |
| 4131 | 7.2 |
| 4132 | 7.8 |
| 4133 | 7.8 |
| 4134 | 7.5 |
| 4135 | 7.8 |
| 4136 | 8.8 |
| 4137 | 9.4 |
| 4138 | 9.5 |
| 4139 | 9.3 |
| 4140 | 9.1 |
| 4141 | 8.9 |
| 4142 | 8.4 |
| 4143 | 7.8 |
| 4144 | 7.5 |
| 4145 | 7.2 |
| 4146 | 6.7 |
| 4147 | 6.4 |
| 4148 | 5.9 |
| 4149 | 5.9 |
| 4150 | 6 |
| 4151 | 5.6 |
| 4152 | 2.2 |
| 4153 | 2.5 |
| 4154 | 3.2 |
| 4155 | 4.2 |
| 4156 | 5.1 |
| 4157 | 7.1 |
| 4158 | 8.2 |
| 4159 | 8.1 |
| 4160 | 8.1 |
| 4161 | 7.9 |
| 4162 | 7.7 |
| 4163 | 7.7 |
| 4164 | 7.8 |
| 4165 | 8 |
| 4166 | 8.4 |
| 4167 | 8.6 |
| 4168 | 8.7 |
| 4169 | 9 |
| 4170 | 9.1 |
| 4171 | 9.2 |
| 4172 | 8.9 |
| 4173 | 8 |
| 4174 | 7.1 |
| 4175 | 6.7 |
| 4176 | 3.4 |
| 4177 | 3.8 |
| 4178 | 4.5 |
| 4179 | 5.5 |
| 4180 | 6.1 |
| 4181 | 6.4 |
| 4182 | 6.8 |
| 4183 | 7.9 |
| 4184 | 7.8 |
| 4185 | 7.7 |
| 4186 | 8 |
| 4187 | 8.1 |
| 4188 | 7.6 |
| 4189 | 7 |
| 4190 | 6.5 |
| 4191 | 6 |
| 4192 | 5.5 |
| 4193 | 4.9 |
| 4194 | 3.9 |
| 4195 | 2.7 |
| 4196 | 2 |
| 4197 | 1 |
| 4198 | 1.3 |
| 4199 | 1.7 |
| 4200 | 1.7 |
| 4201 | 1.4 |
| 4202 | 2.1 |
| 4203 | 4.7 |
| 4204 | 5.3 |
| 4205 | 5.8 |
| 4206 | 6.3 |
| 4207 | 7.2 |
| 4208 | 7.1 |
| 4209 | 7.3 |
| 4210 | 7.4 |
| 4211 | 7.3 |
| 4212 | 7.1 |
| 4213 | 6.7 |
| 4214 | 6.2 |
| 4215 | 5.7 |
| 4216 | 5.6 |
| 4217 | 5.7 |
| 4218 | 5.7 |
| 4219 | 4.9 |
| 4220 | 4.1 |
| 4221 | 4 |
| 4222 | 3 |
| 4223 | 2.3 |
| 4224 | 4.7 |
| 4225 | 5.3 |
| 4226 | 6.5 |
| 4227 | 7.6 |
| 4228 | 7.8 |
| 4229 | 8 |
| 4230 | 8.9 |
| 4231 | 9.9 |
| 4232 | 10.6 |
| 4233 | 10.4 |
| 4234 | 10 |
| 4235 | 9.8 |
| 4236 | 9.5 |
| 4237 | 9.5 |
| 4238 | 9.1 |
| 4239 | 8.9 |
| 4240 | 8.8 |
| 4241 | 8.6 |
| 4242 | 8.4 |
| 4243 | 8.3 |
| 4244 | 9 |
| 4245 | 8.5 |
| 4246 | 7.5 |
| 4247 | 6.5 |
| 4248 | 6.1 |
| 4249 | 6.5 |
| 4250 | 7 |
| 4251 | 7.7 |
| 4252 | 8.5 |
| 4253 | 9.2 |
| 4254 | 9.6 |
| 4255 | 9 |
| 4256 | 8.8 |
| 4257 | 8.8 |
| 4258 | 8.8 |
| 4259 | 9 |
| 4260 | 9.2 |
| 4261 | 9.5 |
| 4262 | 9.4 |
| 4263 | 9.2 |
| 4264 | 8.8 |
| 4265 | 8.6 |
| 4266 | 8.8 |
| 4267 | 9 |
| 4268 | 8.6 |
| 4269 | 8.1 |
| 4270 | 7.8 |
| 4271 | 7.3 |
| 4272 | 8.6 |
| 4273 | 8 |
| 4274 | 7.7 |
| 4275 | 7.8 |
| 4276 | 7.9 |
| 4277 | 7.6 |
| 4278 | 7.4 |
| 4279 | 8 |
| 4280 | 8.1 |
| 4281 | 8.1 |
| 4282 | 8.1 |
| 4283 | 8.2 |
| 4284 | 8.1 |
| 4285 | 7.8 |
| 4286 | 7.3 |
| 4287 | 6.9 |
| 4288 | 6.5 |
| 4289 | 6.4 |
| 4290 | 6.6 |
| 4291 | 6.6 |
| 4292 | 6.7 |
| 4293 | 6.7 |
| 4294 | 7.1 |
| 4295 | 7.1 |
| 4296 | 7.1 |
| 4297 | 7.3 |
| 4298 | 7.5 |
| 4299 | 7.7 |
| 4300 | 8 |
| 4301 | 8.5 |
| 4302 | 9.1 |
| 4303 | 9.7 |
| 4304 | 9.9 |
| 4305 | 10 |
| 4306 | 9.7 |
| 4307 | 9 |
| 4308 | 8.5 |
| 4309 | 8.6 |
| 4310 | 8.6 |
| 4311 | 8.3 |
| 4312 | 8.2 |
| 4313 | 8.6 |
| 4314 | 8.2 |
| 4315 | 7.6 |
| 4316 | 8.1 |
| 4317 | 7.8 |
| 4318 | 7.9 |
| 4319 | 7.8 |
| 4320 | 7.2 |
| 4321 | 6.9 |
| 4322 | 6.8 |
| 4323 | 7 |
| 4324 | 7.3 |
| 4325 | 7.5 |
| 4326 | 7.4 |
| 4327 | 7.1 |
| 4328 | 6.8 |
| 4329 | 6.2 |
| 4330 | 5.8 |
| 4331 | 5.4 |
| 4332 | 5.1 |
| 4333 | 5.1 |
| 4334 | 4.7 |
| 4335 | 4.4 |
| 4336 | 4.7 |
| 4337 | 5.6 |
| 4338 | 5.7 |
| 4339 | 5.3 |
| 4340 | 4.9 |
| 4341 | 4.1 |
| 4342 | 3.6 |
| 4343 | 2.6 |
| 4344 | 3.8 |
| 4345 | 4.2 |
| 4346 | 4.4 |
| 4347 | 4.6 |
| 4348 | 4.8 |
| 4349 | 5.3 |
| 4350 | 5.8 |
| 4351 | 6.6 |
| 4352 | 6.9 |
| 4353 | 6.9 |
| 4354 | 6.7 |
| 4355 | 6.4 |
| 4356 | 5.9 |
| 4357 | 5 |
| 4358 | 4.8 |
| 4359 | 5.1 |
| 4360 | 5 |
| 4361 | 3.8 |
| 4362 | 3.1 |
| 4363 | 3.9 |
| 4364 | 4.3 |
| 4365 | 4.6 |
| 4366 | 4.2 |
| 4367 | 4.3 |
| 4368 | 4.9 |
| 4369 | 6.1 |
| 4370 | 6.8 |
| 4371 | 7.2 |
| 4372 | 7.8 |
| 4373 | 8.2 |
| 4374 | 8.1 |
| 4375 | 8 |
| 4376 | 8.3 |
| 4377 | 8.4 |
| 4378 | 8.3 |
| 4379 | 8.4 |
| 4380 | 8.5 |
| 4381 | 8.8 |
| 4382 | 9.3 |
| 4383 | 9.6 |
| 4384 | 9.7 |
| 4385 | 9.9 |
| 4386 | 10.1 |
| 4387 | 11 |
| 4388 | 11 |
| 4389 | 10.5 |
| 4390 | 9.8 |
| 4391 | 9.6 |
| 4392 | 9.6 |
| 4393 | 9.7 |
| 4394 | 9.3 |
| 4395 | 9.2 |
| 4396 | 9.4 |
| 4397 | 9.6 |
| 4398 | 9.7 |
| 4399 | 9.8 |
| 4400 | 9.9 |
| 4401 | 10.1 |
| 4402 | 10.5 |
| 4403 | 10.6 |
| 4404 | 10.6 |
| 4405 | 10.7 |
| 4406 | 10.5 |
| 4407 | 10.6 |
| 4408 | 10.9 |
| 4409 | 10.9 |
| 4410 | 10.4 |
| 4411 | 9.9 |
| 4412 | 9.3 |
| 4413 | 8.5 |
| 4414 | 7.8 |
| 4415 | 7.8 |
| 4416 | 9.6 |
| 4417 | 10.1 |
| 4418 | 10.4 |
| 4419 | 10.6 |
| 4420 | 10.4 |
| 4421 | 10.1 |
| 4422 | 9.9 |
| 4423 | 10 |
| 4424 | 10.3 |
| 4425 | 10.1 |
| 4426 | 9.6 |
| 4427 | 8.9 |
| 4428 | 8.5 |
| 4429 | 8.6 |
| 4430 | 8.4 |
| 4431 | 8.4 |
| 4432 | 8.3 |
| 4433 | 8.1 |
| 4434 | 8.5 |
| 4435 | 8.5 |
| 4436 | 7.5 |
| 4437 | 6.6 |
| 4438 | 6.1 |
| 4439 | 5.9 |
| 4440 | 6.2 |
| 4441 | 6.2 |
| 4442 | 6.6 |
| 4443 | 7.4 |
| 4444 | 8.2 |
| 4445 | 8.5 |
| 4446 | 8.1 |
| 4447 | 7.6 |
| 4448 | 7.9 |
| 4449 | 8.4 |
| 4450 | 8.6 |
| 4451 | 8.8 |
| 4452 | 9 |
| 4453 | 9 |
| 4454 | 8.9 |
| 4455 | 8.7 |
| 4456 | 8.6 |
| 4457 | 8.4 |
| 4458 | 8.2 |
| 4459 | 8 |
| 4460 | 7.9 |
| 4461 | 7.6 |
| 4462 | 6.7 |
| 4463 | 5.8 |
| 4464 | 4.6 |
| 4465 | 5 |
| 4466 | 5.1 |
| 4467 | 5.4 |
| 4468 | 5.9 |
| 4469 | 6.3 |
| 4470 | 6.7 |
| 4471 | 7 |
| 4472 | 7.6 |
| 4473 | 7.9 |
| 4474 | 8.1 |
| 4475 | 8.1 |
| 4476 | 8.1 |
| 4477 | 7.8 |
| 4478 | 7.4 |
| 4479 | 7.4 |
| 4480 | 7.7 |
| 4481 | 8.2 |
| 4482 | 8.9 |
| 4483 | 8.9 |
| 4484 | 8.1 |
| 4485 | 7.5 |
| 4486 | 6.7 |
| 4487 | 7 |
| 4488 | 7 |
| 4489 | 7.1 |
| 4490 | 6.8 |
| 4491 | 6.8 |
| 4492 | 7.1 |
| 4493 | 7.7 |
| 4494 | 8.1 |
| 4495 | 8.4 |
| 4496 | 8.5 |
| 4497 | 8 |
| 4498 | 8.2 |
| 4499 | 8.3 |
| 4500 | 7.9 |
| 4501 | 7.8 |
| 4502 | 7.4 |
| 4503 | 6.7 |
| 4504 | 6.5 |
| 4505 | 6.5 |
| 4506 | 6 |
| 4507 | 5.9 |
| 4508 | 5.1 |
| 4509 | 5.4 |
| 4510 | 5.8 |
| 4511 | 5.7 |
| 4512 | 7 |
| 4513 | 7.5 |
| 4514 | 7.3 |
| 4515 | 7.3 |
| 4516 | 7.3 |
| 4517 | 7 |
| 4518 | 7.1 |
| 4519 | 7 |
| 4520 | 7.3 |
| 4521 | 7.5 |
| 4522 | 7.7 |
| 4523 | 7.7 |
| 4524 | 7.6 |
| 4525 | 7.9 |
| 4526 | 7.3 |
| 4527 | 7.2 |
| 4528 | 7.2 |
| 4529 | 7.1 |
| 4530 | 7.1 |
| 4531 | 6.8 |
| 4532 | 6.5 |
| 4533 | 5.8 |
| 4534 | 6 |
| 4535 | 6.8 |
| 4536 | 8.7 |
| 4537 | 8.5 |
| 4538 | 8.9 |
| 4539 | 9.1 |
| 4540 | 9.4 |
| 4541 | 9 |
| 4542 | 8.4 |
| 4543 | 8.4 |
| 4544 | 9.4 |
| 4545 | 8.9 |
| 4546 | 8.3 |
| 4547 | 8.7 |
| 4548 | 9.5 |
| 4549 | 9.9 |
| 4550 | 10.1 |
| 4551 | 10 |
| 4552 | 9.1 |
| 4553 | 8.6 |
| 4554 | 8.9 |
| 4555 | 8.9 |
| 4556 | 8.3 |
| 4557 | 7.5 |
| 4558 | 7.3 |
| 4559 | 7.2 |
| 4560 | 4.4 |
| 4561 | 4.8 |
| 4562 | 5.8 |
| 4563 | 6.5 |
| 4564 | 7.6 |
| 4565 | 8.6 |
| 4566 | 8.4 |
| 4567 | 8 |
| 4568 | 8.1 |
| 4569 | 8.5 |
| 4570 | 8.4 |
| 4571 | 8.6 |
| 4572 | 8.6 |
| 4573 | 8.5 |
| 4574 | 8.5 |
| 4575 | 8.5 |
| 4576 | 8.4 |
| 4577 | 8.1 |
| 4578 | 8.3 |
| 4579 | 8.2 |
| 4580 | 7.6 |
| 4581 | 6.6 |
| 4582 | 5.6 |
| 4583 | 3.9 |
| 4584 | 2 |
| 4585 | 0.7 |
| 4586 | 0.9 |
| 4587 | 2.4 |
| 4588 | 4.5 |
| 4589 | 4.1 |
| 4590 | 5.3 |
| 4591 | 6.1 |
| 4592 | 5.8 |
| 4593 | 5.5 |
| 4594 | 5.5 |
| 4595 | 6.1 |
| 4596 | 6.1 |
| 4597 | 6.2 |
| 4598 | 5.4 |
| 4599 | 4.8 |
| 4600 | 3.1 |
| 4601 | 2.9 |
| 4602 | 2.6 |
| 4603 | 2 |
| 4604 | 1.3 |
| 4605 | 0.4 |
| 4606 | 0.5 |
| 4607 | 1.1 |
| 4608 | 1.5 |
| 4609 | 2.6 |
| 4610 | 4.2 |
| 4611 | 5.1 |
| 4612 | 4.9 |
| 4613 | 5.1 |
| 4614 | 5.9 |
| 4615 | 6.7 |
| 4616 | 6.6 |
| 4617 | 6.5 |
| 4618 | 6.8 |
| 4619 | 6.9 |
| 4620 | 6.7 |
| 4621 | 6.2 |
| 4622 | 5.9 |
| 4623 | 5.9 |
| 4624 | 6 |
| 4625 | 6 |
| 4626 | 6 |
| 4627 | 5.5 |
| 4628 | 4.7 |
| 4629 | 4.6 |
| 4630 | 3.5 |
| 4631 | 3.1 |
| 4632 | 2.6 |
| 4633 | 2.9 |
| 4634 | 3.7 |
| 4635 | 4.3 |
| 4636 | 4.7 |
| 4637 | 5.5 |
| 4638 | 6.5 |
| 4639 | 7.4 |
| 4640 | 7 |
| 4641 | 6.5 |
| 4642 | 6.6 |
| 4643 | 6.9 |
| 4644 | 6.7 |
| 4645 | 6.7 |
| 4646 | 6.6 |
| 4647 | 6 |
| 4648 | 5.7 |
| 4649 | 5.6 |
| 4650 | 5.4 |
| 4651 | 4.6 |
| 4652 | 4.8 |
| 4653 | 5 |
| 4654 | 5 |
| 4655 | 4.3 |
| 4656 | 4.4 |
| 4657 | 4.5 |
| 4658 | 4.8 |
| 4659 | 5.1 |
| 4660 | 6 |
| 4661 | 6.5 |
| 4662 | 7.1 |
| 4663 | 7.9 |
| 4664 | 8.7 |
| 4665 | 8.8 |
| 4666 | 8.7 |
| 4667 | 8.3 |
| 4668 | 7.9 |
| 4669 | 8 |
| 4670 | 8.1 |
| 4671 | 8.3 |
| 4672 | 8.5 |
| 4673 | 8.8 |
| 4674 | 8.5 |
| 4675 | 7.9 |
| 4676 | 7.6 |
| 4677 | 7.1 |
| 4678 | 6.4 |
| 4679 | 5.8 |
| 4680 | 4 |
| 4681 | 3.4 |
| 4682 | 2.3 |
| 4683 | 0.9 |
| 4684 | 4.2 |
| 4685 | 4.9 |
| 4686 | 5.7 |
| 4687 | 5.9 |
| 4688 | 5.5 |
| 4689 | 5.3 |
| 4690 | 5.6 |
| 4691 | 5.5 |
| 4692 | 5.4 |
| 4693 | 5.6 |
| 4694 | 4.9 |
| 4695 | 5 |
| 4696 | 4.5 |
| 4697 | 3.8 |
| 4698 | 3.4 |
| 4699 | 3.4 |
| 4700 | 2.8 |
| 4701 | 2.3 |
| 4702 | 1 |
| 4703 | 0.9 |
| 4704 | 6.9 |
| 4705 | 6.1 |
| 4706 | 5.2 |
| 4707 | 4 |
| 4708 | 3.1 |
| 4709 | 3.3 |
| 4710 | 3.6 |
| 4711 | 3.7 |
| 4712 | 3.9 |
| 4713 | 3.1 |
| 4714 | 3.2 |
| 4715 | 3 |
| 4716 | 2.5 |
| 4717 | 2.2 |
| 4718 | 1.7 |
| 4719 | 1.6 |
| 4720 | 1.8 |
| 4721 | 2.1 |
| 4722 | 2.1 |
| 4723 | 1.8 |
| 4724 | 1.8 |
| 4725 | 2 |
| 4726 | 1.8 |
| 4727 | 1.7 |
| 4728 | 2.3 |
| 4729 | 2.2 |
| 4730 | 3.3 |
| 4731 | 4.9 |
| 4732 | 5.1 |
| 4733 | 5.4 |
| 4734 | 6.4 |
| 4735 | 6.7 |
| 4736 | 6.2 |
| 4737 | 5.3 |
| 4738 | 4.9 |
| 4739 | 4.9 |
| 4740 | 4.7 |
| 4741 | 4.3 |
| 4742 | 4.3 |
| 4743 | 4.4 |
| 4744 | 4.9 |
| 4745 | 5.2 |
| 4746 | 5 |
| 4747 | 4.8 |
| 4748 | 4.5 |
| 4749 | 4.3 |
| 4750 | 4.5 |
| 4751 | 3.5 |
| 4752 | 2.5 |
| 4753 | 2.9 |
| 4754 | 3.3 |
| 4755 | 4.2 |
| 4756 | 4.9 |
| 4757 | 6.4 |
| 4758 | 7.5 |
| 4759 | 7 |
| 4760 | 6 |
| 4761 | 5.5 |
| 4762 | 5.4 |
| 4763 | 5 |
| 4764 | 4.4 |
| 4765 | 3.8 |
| 4766 | 3.2 |
| 4767 | 2.8 |
| 4768 | 2.7 |
| 4769 | 2.7 |
| 4770 | 3.1 |
| 4771 | 3 |
| 4772 | 2.2 |
| 4773 | 1.7 |
| 4774 | 1.1 |
| 4775 | 0 |
| 4776 | 3.1 |
| 4777 | 2.9 |
| 4778 | 2.4 |
| 4779 | 2.2 |
| 4780 | 2.8 |
| 4781 | 3.9 |
| 4782 | 4.7 |
| 4783 | 5.5 |
| 4784 | 5 |
| 4785 | 4.2 |
| 4786 | 3.6 |
| 4787 | 3 |
| 4788 | 2.2 |
| 4789 | 1.6 |
| 4790 | 1.6 |
| 4791 | 1.2 |
| 4792 | 1.3 |
| 4793 | 1.5 |
| 4794 | 2.1 |
| 4795 | 2.4 |
| 4796 | 1.7 |
| 4797 | 1.7 |
| 4798 | 2.6 |
| 4799 | 3.2 |
| 4800 | 3 |
| 4801 | 4.1 |
| 4802 | 5.2 |
| 4803 | 5.4 |
| 4804 | 4.9 |
| 4805 | 4.6 |
| 4806 | 5.3 |
| 4807 | 6.5 |
| 4808 | 7.2 |
| 4809 | 7.4 |
| 4810 | 7.3 |
| 4811 | 6.9 |
| 4812 | 6.6 |
| 4813 | 6.4 |
| 4814 | 6.1 |
| 4815 | 5.4 |
| 4816 | 5 |
| 4817 | 5.1 |
| 4818 | 5.7 |
| 4819 | 5.7 |
| 4820 | 5.6 |
| 4821 | 5.2 |
| 4822 | 5.3 |
| 4823 | 5.8 |
| 4824 | 4.6 |
| 4825 | 5 |
| 4826 | 5.4 |
| 4827 | 5.6 |
| 4828 | 5.7 |
| 4829 | 5.8 |
| 4830 | 5.8 |
| 4831 | 5.9 |
| 4832 | 6.4 |
| 4833 | 6.4 |
| 4834 | 6.3 |
| 4835 | 6 |
| 4836 | 5.7 |
| 4837 | 5.4 |
| 4838 | 6.3 |
| 4839 | 6.4 |
| 4840 | 7.1 |
| 4841 | 7.9 |
| 4842 | 7 |
| 4843 | 6.6 |
| 4844 | 5.3 |
| 4845 | 4.8 |
| 4846 | 4.4 |
| 4847 | 4.2 |
| 4848 | 4.1 |
| 4849 | 4.2 |
| 4850 | 4.1 |
| 4851 | 4.3 |
| 4852 | 5.4 |
| 4853 | 6.1 |
| 4854 | 7.1 |
| 4855 | 7.2 |
| 4856 | 6.5 |
| 4857 | 5.8 |
| 4858 | 4.9 |
| 4859 | 4.3 |
| 4860 | 3.9 |
| 4861 | 4 |
| 4862 | 4 |
| 4863 | 4 |
| 4864 | 4.4 |
| 4865 | 4.4 |
| 4866 | 4.8 |
| 4867 | 5.2 |
| 4868 | 5.5 |
| 4869 | 5.3 |
| 4870 | 5.7 |
| 4871 | 5.6 |
| 4872 | 3.6 |
| 4873 | 4.5 |
| 4874 | 4.7 |
| 4875 | 4.9 |
| 4876 | 5.1 |
| 4877 | 5.4 |
| 4878 | 5.8 |
| 4879 | 6.3 |
| 4880 | 6.6 |
| 4881 | 6.4 |
| 4882 | 6.6 |
| 4883 | 6.6 |
| 4884 | 6.7 |
| 4885 | 7 |
| 4886 | 7.1 |
| 4887 | 6.9 |
| 4888 | 6.7 |
| 4889 | 6.4 |
| 4890 | 5.7 |
| 4891 | 5.9 |
| 4892 | 5.9 |
| 4893 | 5.1 |
| 4894 | 5.3 |
| 4895 | 5.5 |
| 4896 | 5.1 |
| 4897 | 5.4 |
| 4898 | 5.8 |
| 4899 | 5.9 |
| 4900 | 6 |
| 4901 | 6.4 |
| 4902 | 6.9 |
| 4903 | 7.6 |
| 4904 | 8 |
| 4905 | 7.6 |
| 4906 | 7 |
| 4907 | 6.3 |
| 4908 | 5.9 |
| 4909 | 6 |
| 4910 | 5.9 |
| 4911 | 5.9 |
| 4912 | 5.6 |
| 4913 | 5.9 |
| 4914 | 6.1 |
| 4915 | 5.8 |
| 4916 | 5.1 |
| 4917 | 5.4 |
| 4918 | 6 |
| 4919 | 6.3 |
| 4920 | 6.6 |
| 4921 | 6.6 |
| 4922 | 6.8 |
| 4923 | 7.2 |
| 4924 | 7.7 |
| 4925 | 7.7 |
| 4926 | 7.9 |
| 4927 | 8.1 |
| 4928 | 8.2 |
| 4929 | 8.1 |
| 4930 | 7.6 |
| 4931 | 7.1 |
| 4932 | 6.7 |
| 4933 | 6.5 |
| 4934 | 6.4 |
| 4935 | 6.2 |
| 4936 | 6.2 |
| 4937 | 6.9 |
| 4938 | 7.5 |
| 4939 | 8 |
| 4940 | 7.8 |
| 4941 | 6.9 |
| 4942 | 6.1 |
| 4943 | 6.5 |
| 4944 | 6.1 |
| 4945 | 6.8 |
| 4946 | 7.2 |
| 4947 | 7.6 |
| 4948 | 7.7 |
| 4949 | 7.3 |
| 4950 | 7.1 |
| 4951 | 7.3 |
| 4952 | 7.9 |
| 4953 | 7.9 |
| 4954 | 7.7 |
| 4955 | 7.4 |
| 4956 | 7.3 |
| 4957 | 7.3 |
| 4958 | 7.2 |
| 4959 | 7.1 |
| 4960 | 7 |
| 4961 | 6.8 |
| 4962 | 6.4 |
| 4963 | 6.2 |
| 4964 | 6.1 |
| 4965 | 6 |
| 4966 | 6.3 |
| 4967 | 6 |
| 4968 | 6 |
| 4969 | 6 |
| 4970 | 6.2 |
| 4971 | 6.4 |
| 4972 | 7 |
| 4973 | 7.7 |
| 4974 | 7.9 |
| 4975 | 8 |
| 4976 | 8 |
| 4977 | 7.6 |
| 4978 | 7.4 |
| 4979 | 7.1 |
| 4980 | 7 |
| 4981 | 6.8 |
| 4982 | 6.3 |
| 4983 | 6.1 |
| 4984 | 6 |
| 4985 | 5.7 |
| 4986 | 5.5 |
| 4987 | 5.3 |
| 4988 | 5.4 |
| 4989 | 5.1 |
| 4990 | 4.4 |
| 4991 | 3.9 |
| 4992 | 4 |
| 4993 | 4.6 |
| 4994 | 5 |
| 4995 | 5.1 |
| 4996 | 5.7 |
| 4997 | 6.2 |
| 4998 | 6.6 |
| 4999 | 6.8 |
| 5000 | 7.2 |
| 5001 | 7 |
| 5002 | 6.1 |
| 5003 | 6 |
| 5004 | 7.5 |
| 5005 | 7.6 |
| 5006 | 7.7 |
| 5007 | 7.1 |
| 5008 | 6.7 |
| 5009 | 6.5 |
| 5010 | 6.5 |
| 5011 | 6.7 |
| 5012 | 7 |
| 5013 | 7.9 |
| 5014 | 8.4 |
| 5015 | 8.4 |
| 5016 | 8.9 |
| 5017 | 9.8 |
| 5018 | 10.4 |
| 5019 | 10.5 |
| 5020 | 10.3 |
| 5021 | 10.6 |
| 5022 | 11 |
| 5023 | 11.6 |
| 5024 | 12.2 |
| 5025 | 12 |
| 5026 | 11.6 |
| 5027 | 11.4 |
| 5028 | 11.3 |
| 5029 | 10.6 |
| 5030 | 10 |
| 5031 | 9.7 |
| 5032 | 9.7 |
| 5033 | 10 |
| 5034 | 10.2 |
| 5035 | 10.6 |
| 5036 | 10.9 |
| 5037 | 10.8 |
| 5038 | 10.6 |
| 5039 | 10.2 |
| 5040 | 7.9 |
| 5041 | 7.9 |
| 5042 | 8 |
| 5043 | 8.5 |
| 5044 | 8.8 |
| 5045 | 8.6 |
| 5046 | 8.3 |
| 5047 | 8.9 |
| 5048 | 9.8 |
| 5049 | 9.2 |
| 5050 | 8.6 |
| 5051 | 8.4 |
| 5052 | 8.3 |
| 5053 | 8 |
| 5054 | 7.7 |
| 5055 | 7.4 |
| 5056 | 7.4 |
| 5057 | 7.4 |
| 5058 | 7.1 |
| 5059 | 6.3 |
| 5060 | 4.9 |
| 5061 | 3.8 |
| 5062 | 3.1 |
| 5063 | 1.7 |
| 5064 | 1.8 |
| 5065 | 2.4 |
| 5066 | 3.6 |
| 5067 | 4.3 |
| 5068 | 4.6 |
| 5069 | 6.2 |
| 5070 | 7.7 |
| 5071 | 8.3 |
| 5072 | 8.3 |
| 5073 | 8.5 |
| 5074 | 8.8 |
| 5075 | 9.1 |
| 5076 | 9.3 |
| 5077 | 9.4 |
| 5078 | 9.5 |
| 5079 | 9.7 |
| 5080 | 10 |
| 5081 | 9.9 |
| 5082 | 9.6 |
| 5083 | 8.8 |
| 5084 | 7.7 |
| 5085 | 6.7 |
| 5086 | 6.3 |
| 5087 | 7.1 |
| 5088 | 6.1 |
| 5089 | 5.5 |
| 5090 | 5.6 |
| 5091 | 6.1 |
| 5092 | 7 |
| 5093 | 7.6 |
| 5094 | 8.1 |
| 5095 | 9.1 |
| 5096 | 10.2 |
| 5097 | 10.8 |
| 5098 | 11 |
| 5099 | 10.9 |
| 5100 | 10.5 |
| 5101 | 9.8 |
| 5102 | 8.9 |
| 5103 | 8.4 |
| 5104 | 8.2 |
| 5105 | 7.8 |
| 5106 | 7.3 |
| 5107 | 6.5 |
| 5108 | 5.8 |
| 5109 | 5.2 |
| 5110 | 4.8 |
| 5111 | 4.2 |
| 5112 | 6.3 |
| 5113 | 5.6 |
| 5114 | 5.7 |
| 5115 | 5.8 |
| 5116 | 6.3 |
| 5117 | 7.2 |
| 5118 | 7.9 |
| 5119 | 8.6 |
| 5120 | 8.7 |
| 5121 | 8.7 |
| 5122 | 8.8 |
| 5123 | 8.8 |
| 5124 | 8.6 |
| 5125 | 8.6 |
| 5126 | 8.7 |
| 5127 | 8.6 |
| 5128 | 8.4 |
| 5129 | 8.1 |
| 5130 | 7.9 |
| 5131 | 7.7 |
| 5132 | 7.6 |
| 5133 | 7.9 |
| 5134 | 7.2 |
| 5135 | 6.4 |
| 5136 | 6.2 |
| 5137 | 6.5 |
| 5138 | 6.6 |
| 5139 | 6.3 |
| 5140 | 6 |
| 5141 | 6.1 |
| 5142 | 6.6 |
| 5143 | 7.2 |
| 5144 | 7.4 |
| 5145 | 7.4 |
| 5146 | 7.1 |
| 5147 | 6.5 |
| 5148 | 6.4 |
| 5149 | 6.4 |
| 5150 | 6.6 |
| 5151 | 6.7 |
| 5152 | 7 |
| 5153 | 7.4 |
| 5154 | 6.7 |
| 5155 | 6.7 |
| 5156 | 6.4 |
| 5157 | 5.9 |
| 5158 | 5.9 |
| 5159 | 5.9 |
| 5160 | 7.9 |
| 5161 | 8.4 |
| 5162 | 9.1 |
| 5163 | 9.7 |
| 5164 | 9.9 |
| 5165 | 10.2 |
| 5166 | 10.6 |
| 5167 | 10.6 |
| 5168 | 9.8 |
| 5169 | 9.6 |
| 5170 | 10.4 |
| 5171 | 11.2 |
| 5172 | 11.5 |
| 5173 | 10.9 |
| 5174 | 10.1 |
| 5175 | 10.2 |
| 5176 | 10.1 |
| 5177 | 9.7 |
| 5178 | 10.6 |
| 5179 | 10.7 |
| 5180 | 11.1 |
| 5181 | 11.1 |
| 5182 | 10.6 |
| 5183 | 9.9 |
| 5184 | 8 |
| 5185 | 8 |
| 5186 | 8.4 |
| 5187 | 9.1 |
| 5188 | 9.6 |
| 5189 | 9.6 |
| 5190 | 9.4 |
| 5191 | 9.3 |
| 5192 | 9.1 |
| 5193 | 8.9 |
| 5194 | 8.7 |
| 5195 | 8.4 |
| 5196 | 7.9 |
| 5197 | 7.6 |
| 5198 | 7.3 |
| 5199 | 7.1 |
| 5200 | 7.2 |
| 5201 | 7.3 |
| 5202 | 7.4 |
| 5203 | 7.3 |
| 5204 | 7.7 |
| 5205 | 7.1 |
| 5206 | 6.3 |
| 5207 | 5.9 |
| 5208 | 3.4 |
| 5209 | 4.2 |
| 5210 | 4.9 |
| 5211 | 5.7 |
| 5212 | 6.3 |
| 5213 | 6.9 |
| 5214 | 7.5 |
| 5215 | 8.2 |
| 5216 | 8.3 |
| 5217 | 8.5 |
| 5218 | 8.5 |
| 5219 | 8.6 |
| 5220 | 8.8 |
| 5221 | 8.9 |
| 5222 | 9 |
| 5223 | 8.9 |
| 5224 | 8.5 |
| 5225 | 8.5 |
| 5226 | 8.5 |
| 5227 | 8.4 |
| 5228 | 8.1 |
| 5229 | 7.5 |
| 5230 | 7.2 |
| 5231 | 7 |
| 5232 | 6.3 |
| 5233 | 6.8 |
| 5234 | 7.3 |
| 5235 | 7.6 |
| 5236 | 7.9 |
| 5237 | 8.1 |
| 5238 | 8.3 |
| 5239 | 8.5 |
| 5240 | 8.8 |
| 5241 | 9 |
| 5242 | 9.1 |
| 5243 | 8.5 |
| 5244 | 8 |
| 5245 | 7.8 |
| 5246 | 7.7 |
| 5247 | 8.1 |
| 5248 | 8 |
| 5249 | 8 |
| 5250 | 7.8 |
| 5251 | 7.5 |
| 5252 | 7.1 |
| 5253 | 6.9 |
| 5254 | 6.6 |
| 5255 | 6.8 |
| 5256 | 6.5 |
| 5257 | 6.7 |
| 5258 | 7.2 |
| 5259 | 7.4 |
| 5260 | 7.6 |
| 5261 | 7.7 |
| 5262 | 7.6 |
| 5263 | 7.1 |
| 5264 | 7.4 |
| 5265 | 7 |
| 5266 | 6.5 |
| 5267 | 6.4 |
| 5268 | 7.2 |
| 5269 | 8.1 |
| 5270 | 8.9 |
| 5271 | 8.9 |
| 5272 | 8.7 |
| 5273 | 8.8 |
| 5274 | 9.1 |
| 5275 | 9.4 |
| 5276 | 8.8 |
| 5277 | 6.7 |
| 5278 | 6.6 |
| 5279 | 6.1 |
| 5280 | 6 |
| 5281 | 6.5 |
| 5282 | 7.3 |
| 5283 | 8 |
| 5284 | 8.9 |
| 5285 | 9.5 |
| 5286 | 9.3 |
| 5287 | 9.1 |
| 5288 | 9.1 |
| 5289 | 9.4 |
| 5290 | 10.1 |
| 5291 | 10.8 |
| 5292 | 11.6 |
| 5293 | 12.2 |
| 5294 | 12.3 |
| 5295 | 12 |
| 5296 | 11.6 |
| 5297 | 11.3 |
| 5298 | 10.9 |
| 5299 | 11.2 |
| 5300 | 11.4 |
| 5301 | 10.5 |
| 5302 | 10.1 |
| 5303 | 9.2 |
| 5304 | 7.9 |
| 5305 | 7.6 |
| 5306 | 8.5 |
| 5307 | 9.5 |
| 5308 | 10.5 |
| 5309 | 10.8 |
| 5310 | 10.6 |
| 5311 | 10 |
| 5312 | 9.9 |
| 5313 | 10.4 |
| 5314 | 10.4 |
| 5315 | 10.3 |
| 5316 | 10.5 |
| 5317 | 10.3 |
| 5318 | 10.1 |
| 5319 | 10 |
| 5320 | 9.8 |
| 5321 | 9.4 |
| 5322 | 9.1 |
| 5323 | 9 |
| 5324 | 9.7 |
| 5325 | 10.1 |
| 5326 | 10.6 |
| 5327 | 10.6 |
| 5328 | 9.5 |
| 5329 | 9.5 |
| 5330 | 9.7 |
| 5331 | 10 |
| 5332 | 10 |
| 5333 | 9.7 |
| 5334 | 9.6 |
| 5335 | 9.4 |
| 5336 | 9.3 |
| 5337 | 9.6 |
| 5338 | 10 |
| 5339 | 10.1 |
| 5340 | 10.1 |
| 5341 | 10.2 |
| 5342 | 10.7 |
| 5343 | 11.1 |
| 5344 | 11 |
| 5345 | 10.7 |
| 5346 | 10.6 |
| 5347 | 10.5 |
| 5348 | 10.8 |
| 5349 | 10.5 |
| 5350 | 8.8 |
| 5351 | 8 |
| 5352 | 4.5 |
| 5353 | 5.4 |
| 5354 | 6 |
| 5355 | 6.2 |
| 5356 | 6.6 |
| 5357 | 7.4 |
| 5358 | 7.4 |
| 5359 | 7.3 |
| 5360 | 7.5 |
| 5361 | 7.7 |
| 5362 | 8 |
| 5363 | 8.4 |
| 5364 | 8.6 |
| 5365 | 8.8 |
| 5366 | 8.6 |
| 5367 | 8.1 |
| 5368 | 7.6 |
| 5369 | 7.4 |
| 5370 | 7.4 |
| 5371 | 7.2 |
| 5372 | 6.5 |
| 5373 | 6.2 |
| 5374 | 5.6 |
| 5375 | 5.1 |
| 5376 | 7.2 |
| 5377 | 7.7 |
| 5378 | 7.8 |
| 5379 | 7.9 |
| 5380 | 7.6 |
| 5381 | 7.8 |
| 5382 | 7.5 |
| 5383 | 7.2 |
| 5384 | 7.5 |
| 5385 | 7.1 |
| 5386 | 7.4 |
| 5387 | 7.5 |
| 5388 | 7.4 |
| 5389 | 7.2 |
| 5390 | 7.2 |
| 5391 | 7.4 |
| 5392 | 6.7 |
| 5393 | 7.3 |
| 5394 | 7 |
| 5395 | 7.6 |
| 5396 | 6.5 |
| 5397 | 5.1 |
| 5398 | 5.3 |
| 5399 | 6 |
| 5400 | 4.7 |
| 5401 | 5 |
| 5402 | 5.3 |
| 5403 | 5.7 |
| 5404 | 5.7 |
| 5405 | 6.3 |
| 5406 | 6.7 |
| 5407 | 7.1 |
| 5408 | 6.8 |
| 5409 | 6.2 |
| 5410 | 5.9 |
| 5411 | 5.7 |
| 5412 | 5.6 |
| 5413 | 6 |
| 5414 | 6.7 |
| 5415 | 6.9 |
| 5416 | 6.8 |
| 5417 | 6.9 |
| 5418 | 7.1 |
| 5419 | 7 |
| 5420 | 7.1 |
| 5421 | 7 |
| 5422 | 6.8 |
| 5423 | 6.4 |
| 5424 | 5.5 |
| 5425 | 5.2 |
| 5426 | 6.1 |
| 5427 | 7 |
| 5428 | 7.9 |
| 5429 | 8.1 |
| 5430 | 8.1 |
| 5431 | 8.5 |
| 5432 | 8.9 |
| 5433 | 8.9 |
| 5434 | 9 |
| 5435 | 9 |
| 5436 | 8.9 |
| 5437 | 8.9 |
| 5438 | 8.9 |
| 5439 | 9.1 |
| 5440 | 9.3 |
| 5441 | 9.5 |
| 5442 | 9.4 |
| 5443 | 9.6 |
| 5444 | 9.8 |
| 5445 | 8.9 |
| 5446 | 9.2 |
| 5447 | 9.6 |
| 5448 | 8.6 |
| 5449 | 8.6 |
| 5450 | 9.2 |
| 5451 | 9.5 |
| 5452 | 9.7 |
| 5453 | 10 |
| 5454 | 10.2 |
| 5455 | 10.1 |
| 5456 | 10.1 |
| 5457 | 9.7 |
| 5458 | 9.4 |
| 5459 | 9.2 |
| 5460 | 9 |
| 5461 | 8.7 |
| 5462 | 8.6 |
| 5463 | 8.8 |
| 5464 | 9.2 |
| 5465 | 9.3 |
| 5466 | 9.1 |
| 5467 | 9.1 |
| 5468 | 8.9 |
| 5469 | 8.3 |
| 5470 | 7.3 |
| 5471 | 6.6 |
| 5472 | 6.4 |
| 5473 | 6.8 |
| 5474 | 7.4 |
| 5475 | 7.8 |
| 5476 | 7.8 |
| 5477 | 7.6 |
| 5478 | 7.6 |
| 5479 | 8.1 |
| 5480 | 8.5 |
| 5481 | 8.8 |
| 5482 | 8.7 |
| 5483 | 8.6 |
| 5484 | 8.7 |
| 5485 | 8.9 |
| 5486 | 8.7 |
| 5487 | 8.3 |
| 5488 | 8.3 |
| 5489 | 8.4 |
| 5490 | 8.7 |
| 5491 | 8.9 |
| 5492 | 8.9 |
| 5493 | 8.5 |
| 5494 | 8.1 |
| 5495 | 7.2 |
| 5496 | 6.9 |
| 5497 | 7.1 |
| 5498 | 6.9 |
| 5499 | 7 |
| 5500 | 7 |
| 5501 | 7 |
| 5502 | 7.5 |
| 5503 | 8.3 |
| 5504 | 9.2 |
| 5505 | 9.9 |
| 5506 | 9.9 |
| 5507 | 9.5 |
| 5508 | 8.9 |
| 5509 | 8.7 |
| 5510 | 8.6 |
| 5511 | 8.3 |
| 5512 | 8.2 |
| 5513 | 8.2 |
| 5514 | 8.4 |
| 5515 | 8.9 |
| 5516 | 9.6 |
| 5517 | 9.3 |
| 5518 | 9.8 |
| 5519 | 9.2 |
| 5520 | 8.6 |
| 5521 | 8.8 |
| 5522 | 9.3 |
| 5523 | 9.9 |
| 5524 | 10 |
| 5525 | 9.3 |
| 5526 | 9.1 |
| 5527 | 9.5 |
| 5528 | 10 |
| 5529 | 9.9 |
| 5530 | 9.8 |
| 5531 | 9.5 |
| 5532 | 9.2 |
| 5533 | 8.9 |
| 5534 | 8.8 |
| 5535 | 8.6 |
| 5536 | 8.4 |
| 5537 | 8.1 |
| 5538 | 8.3 |
| 5539 | 8.3 |
| 5540 | 8.4 |
| 5541 | 8.5 |
| 5542 | 8.5 |
| 5543 | 8.6 |
| 5544 | 5.8 |
| 5545 | 5.7 |
| 5546 | 6.5 |
| 5547 | 7.7 |
| 5548 | 8.2 |
| 5549 | 8 |
| 5550 | 7.8 |
| 5551 | 7.9 |
| 5552 | 8.6 |
| 5553 | 8.6 |
| 5554 | 8.5 |
| 5555 | 8.4 |
| 5556 | 8.6 |
| 5557 | 8.5 |
| 5558 | 8.6 |
| 5559 | 8.5 |
| 5560 | 8.3 |
| 5561 | 8.3 |
| 5562 | 8.3 |
| 5563 | 8.3 |
| 5564 | 8.3 |
| 5565 | 7.9 |
| 5566 | 6.9 |
| 5567 | 6.3 |
| 5568 | 9 |
| 5569 | 9.2 |
| 5570 | 9.1 |
| 5571 | 9.5 |
| 5572 | 10 |
| 5573 | 10.4 |
| 5574 | 11.3 |
| 5575 | 11.2 |
| 5576 | 10.8 |
| 5577 | 10.7 |
| 5578 | 10.1 |
| 5579 | 9.9 |
| 5580 | 9.5 |
| 5581 | 9.1 |
| 5582 | 8.7 |
| 5583 | 8.6 |
| 5584 | 8.6 |
| 5585 | 8.9 |
| 5586 | 9.1 |
| 5587 | 9.4 |
| 5588 | 10.3 |
| 5589 | 10.2 |
| 5590 | 9.9 |
| 5591 | 9.6 |
| 5592 | 5.3 |
| 5593 | 5.9 |
| 5594 | 6.4 |
| 5595 | 6.7 |
| 5596 | 7 |
| 5597 | 6.9 |
| 5598 | 7 |
| 5599 | 7.5 |
| 5600 | 7.6 |
| 5601 | 7.6 |
| 5602 | 7.9 |
| 5603 | 8.1 |
| 5604 | 8.2 |
| 5605 | 8.2 |
| 5606 | 8.2 |
| 5607 | 7.8 |
| 5608 | 6.8 |
| 5609 | 5.8 |
| 5610 | 5.4 |
| 5611 | 5 |
| 5612 | 4.6 |
| 5613 | 3.4 |
| 5614 | 2.3 |
| 5615 | 1.1 |
| 5616 | 4.5 |
| 5617 | 4.2 |
| 5618 | 4.7 |
| 5619 | 5.1 |
| 5620 | 5.4 |
| 5621 | 6 |
| 5622 | 7.1 |
| 5623 | 7.7 |
| 5624 | 7.2 |
| 5625 | 7 |
| 5626 | 6.9 |
| 5627 | 6.8 |
| 5628 | 6.5 |
| 5629 | 6.2 |
| 5630 | 5.9 |
| 5631 | 5.6 |
| 5632 | 5.4 |
| 5633 | 5.5 |
| 5634 | 5.3 |
| 5635 | 4.8 |
| 5636 | 4.4 |
| 5637 | 3.8 |
| 5638 | 3.7 |
| 5639 | 1.9 |
| 5640 | 2.7 |
| 5641 | 2.5 |
| 5642 | 3 |
| 5643 | 3.7 |
| 5644 | 4.1 |
| 5645 | 3.9 |
| 5646 | 6 |
| 5647 | 6 |
| 5648 | 5.4 |
| 5649 | 5.3 |
| 5650 | 5.2 |
| 5651 | 4.8 |
| 5652 | 4.4 |
| 5653 | 4.2 |
| 5654 | 4.3 |
| 5655 | 4.3 |
| 5656 | 3.9 |
| 5657 | 2.6 |
| 5658 | 2.4 |
| 5659 | 0.4 |
| 5660 | 3 |
| 5661 | 2.2 |
| 5662 | 3.3 |
| 5663 | 2.7 |
| 5664 | 5.4 |
| 5665 | 5.4 |
| 5666 | 4.9 |
| 5667 | 4.8 |
| 5668 | 4.5 |
| 5669 | 1.8 |
| 5670 | 4.5 |
| 5671 | 5.7 |
| 5672 | 5.7 |
| 5673 | 6.4 |
| 5674 | 7.7 |
| 5675 | 6.5 |
| 5676 | 3.5 |
| 5677 | 3.7 |
| 5678 | 4.4 |
| 5679 | 3.7 |
| 5680 | 2.4 |
| 5681 | 4.2 |
| 5682 | 3.2 |
| 5683 | 3.5 |
| 5684 | 4.5 |
| 5685 | 4.6 |
| 5686 | 4.6 |
| 5687 | 5.2 |
| 5688 | 8.9 |
| 5689 | 9.8 |
| 5690 | 9.6 |
| 5691 | 9.2 |
| 5692 | 8 |
| 5693 | 6.9 |
| 5694 | 4.4 |
| 5695 | 3.2 |
| 5696 | 4 |
| 5697 | 4.5 |
| 5698 | 4 |
| 5699 | 3.9 |
| 5700 | 1.1 |
| 5701 | 3.5 |
| 5702 | 6 |
| 5703 | 5.8 |
| 5704 | 5.8 |
| 5705 | 6.3 |
| 5706 | 6.6 |
| 5707 | 6.1 |
| 5708 | 5.7 |
| 5709 | 4.8 |
| 5710 | 4.7 |
| 5711 | 5.3 |
| 5712 | 4.3 |
| 5713 | 4.9 |
| 5714 | 3.7 |
| 5715 | 3.7 |
| 5716 | 4.2 |
| 5717 | 4.7 |
| 5718 | 4.8 |
| 5719 | 5.5 |
| 5720 | 5.6 |
| 5721 | 6 |
| 5722 | 5.8 |
| 5723 | 5.4 |
| 5724 | 4.8 |
| 5725 | 4.4 |
| 5726 | 3.8 |
| 5727 | 4 |
| 5728 | 4.7 |
| 5729 | 4.1 |
| 5730 | 3.7 |
| 5731 | 6 |
| 5732 | 6.2 |
| 5733 | 5 |
| 5734 | 5 |
| 5735 | 3.6 |
| 5736 | 2.9 |
| 5737 | 3.5 |
| 5738 | 4.1 |
| 5739 | 4.7 |
| 5740 | 4.7 |
| 5741 | 5 |
| 5742 | 5.2 |
| 5743 | 5.8 |
| 5744 | 5.8 |
| 5745 | 5.5 |
| 5746 | 5.2 |
| 5747 | 5.2 |
| 5748 | 5.4 |
| 5749 | 5.7 |
| 5750 | 5.6 |
| 5751 | 5.3 |
| 5752 | 5.5 |
| 5753 | 5.4 |
| 5754 | 5.4 |
| 5755 | 5.4 |
| 5756 | 5.1 |
| 5757 | 4.8 |
| 5758 | 4.6 |
| 5759 | 4.8 |
| 5760 | 3.2 |
| 5761 | 4 |
| 5762 | 4.4 |
| 5763 | 4.4 |
| 5764 | 5 |
| 5765 | 5.8 |
| 5766 | 5.8 |
| 5767 | 6.2 |
| 5768 | 5.9 |
| 5769 | 5.7 |
| 5770 | 5.5 |
| 5771 | 5.1 |
| 5772 | 4.4 |
| 5773 | 4.4 |
| 5774 | 4 |
| 5775 | 2.8 |
| 5776 | 2.1 |
| 5777 | 2.4 |
| 5778 | 3 |
| 5779 | 2.7 |
| 5780 | 2.1 |
| 5781 | 1.1 |
| 5782 | 1.3 |
| 5783 | 1.9 |
| 5784 | 3.2 |
| 5785 | 3.6 |
| 5786 | 4.7 |
| 5787 | 5.1 |
| 5788 | 6.3 |
| 5789 | 6.6 |
| 5790 | 6.3 |
| 5791 | 6.5 |
| 5792 | 6.4 |
| 5793 | 6.3 |
| 5794 | 6.2 |
| 5795 | 5.7 |
| 5796 | 5.5 |
| 5797 | 5.3 |
| 5798 | 4.7 |
| 5799 | 4.1 |
| 5800 | 4.5 |
| 5801 | 4.8 |
| 5802 | 4.7 |
| 5803 | 4.8 |
| 5804 | 4.6 |
| 5805 | 4 |
| 5806 | 3.3 |
| 5807 | 3.5 |
| 5808 | 3.9 |
| 5809 | 4.4 |
| 5810 | 4.9 |
| 5811 | 5 |
| 5812 | 5.1 |
| 5813 | 4.9 |
| 5814 | 4.5 |
| 5815 | 4.2 |
| 5816 | 5 |
| 5817 | 6.3 |
| 5818 | 6.4 |
| 5819 | 6.3 |
| 5820 | 6.2 |
| 5821 | 6.2 |
| 5822 | 7 |
| 5823 | 7.7 |
| 5824 | 8.2 |
| 5825 | 9 |
| 5826 | 9.9 |
| 5827 | 10.2 |
| 5828 | 9.1 |
| 5829 | 8.9 |
| 5830 | 8.1 |
| 5831 | 7.8 |
| 5832 | 6 |
| 5833 | 5.9 |
| 5834 | 6.1 |
| 5835 | 6 |
| 5836 | 6.3 |
| 5837 | 6.7 |
| 5838 | 6.7 |
| 5839 | 6.4 |
| 5840 | 6.1 |
| 5841 | 5.3 |
| 5842 | 4.6 |
| 5843 | 4.6 |
| 5844 | 5 |
| 5845 | 5.3 |
| 5846 | 5.7 |
| 5847 | 6.1 |
| 5848 | 6.6 |
| 5849 | 6.9 |
| 5850 | 7 |
| 5851 | 7.8 |
| 5852 | 8.5 |
| 5853 | 9.2 |
| 5854 | 10 |
| 5855 | 10.5 |
| 5856 | 11 |
| 5857 | 11.6 |
| 5858 | 12.8 |
| 5859 | 10.1 |
| 5860 | 9.1 |
| 5861 | 10.8 |
| 5862 | 11.1 |
| 5863 | 12.1 |
| 5864 | 7.8 |
| 5865 | 6.4 |
| 5866 | 5.9 |
| 5867 | 5.8 |
| 5868 | 5.5 |
| 5869 | 5.3 |
| 5870 | 5.3 |
| 5871 | 5.7 |
| 5872 | 5.9 |
| 5873 | 6.3 |
| 5874 | 6.5 |
| 5875 | 7 |
| 5876 | 6.6 |
| 5877 | 6 |
| 5878 | 6.8 |
| 5879 | 6.7 |
| 5880 | 5.4 |
| 5881 | 5.2 |
| 5882 | 5 |
| 5883 | 4.6 |
| 5884 | 5 |
| 5885 | 5.2 |
| 5886 | 5.6 |
| 5887 | 6.5 |
| 5888 | 6.4 |
| 5889 | 6.4 |
| 5890 | 6.9 |
| 5891 | 7.2 |
| 5892 | 7.3 |
| 5893 | 7.3 |
| 5894 | 7.1 |
| 5895 | 7 |
| 5896 | 6.8 |
| 5897 | 6.6 |
| 5898 | 6.6 |
| 5899 | 6.6 |
| 5900 | 6.6 |
| 5901 | 6.4 |
| 5902 | 5.8 |
| 5903 | 5.1 |
| 5904 | 1.5 |
| 5905 | 1.8 |
| 5906 | 2.2 |
| 5907 | 2.9 |
| 5908 | 3.8 |
| 5909 | 4.9 |
| 5910 | 5.3 |
| 5911 | 6 |
| 5912 | 5.7 |
| 5913 | 5.4 |
| 5914 | 5.4 |
| 5915 | 5 |
| 5916 | 4.5 |
| 5917 | 4.6 |
| 5918 | 4.3 |
| 5919 | 3.6 |
| 5920 | 2.4 |
| 5921 | 0.2 |
| 5922 | 2.1 |
| 5923 | 3.9 |
| 5924 | 4.6 |
| 5925 | 4.3 |
| 5926 | 4.6 |
| 5927 | 5 |
| 5928 | 6.4 |
| 5929 | 6 |
| 5930 | 5.3 |
| 5931 | 4.7 |
| 5932 | 3.9 |
| 5933 | 3.1 |
| 5934 | 2.9 |
| 5935 | 3.1 |
| 5936 | 2.3 |
| 5937 | 2.7 |
| 5938 | 2.9 |
| 5939 | 1.8 |
| 5940 | 1.2 |
| 5941 | 2.6 |
| 5942 | 3.5 |
| 5943 | 5 |
| 5944 | 4.5 |
| 5945 | 4 |
| 5946 | 3.7 |
| 5947 | 3.5 |
| 5948 | 2.6 |
| 5949 | 1.5 |
| 5950 | 1.8 |
| 5951 | 2.5 |
| 5952 | 4.1 |
| 5953 | 4.2 |
| 5954 | 4 |
| 5955 | 4.3 |
| 5956 | 5.8 |
| 5957 | 6.6 |
| 5958 | 6.3 |
| 5959 | 5.5 |
| 5960 | 5.3 |
| 5961 | 4.5 |
| 5962 | 3.6 |
| 5963 | 2.7 |
| 5964 | 2.5 |
| 5965 | 2.6 |
| 5966 | 2.4 |
| 5967 | 2.2 |
| 5968 | 1.9 |
| 5969 | 2.6 |
| 5970 | 3.1 |
| 5971 | 3.2 |
| 5972 | 3.8 |
| 5973 | 3.8 |
| 5974 | 3.8 |
| 5975 | 3.4 |
| 5976 | 3.3 |
| 5977 | 3.8 |
| 5978 | 4.6 |
| 5979 | 4.9 |
| 5980 | 5.7 |
| 5981 | 6.7 |
| 5982 | 7 |
| 5983 | 7.7 |
| 5984 | 8 |
| 5985 | 7.7 |
| 5986 | 7.4 |
| 5987 | 7.4 |
| 5988 | 7.4 |
| 5989 | 7.2 |
| 5990 | 7.3 |
| 5991 | 6.8 |
| 5992 | 6.7 |
| 5993 | 6.7 |
| 5994 | 6.5 |
| 5995 | 6.3 |
| 5996 | 6.9 |
| 5997 | 7.9 |
| 5998 | 7.6 |
| 5999 | 7.5 |
| 6000 | 10.7 |
| 6001 | 10.4 |
| 6002 | 11.1 |
| 6003 | 11.5 |
| 6004 | 12.4 |
| 6005 | 12 |
| 6006 | 11.4 |
| 6007 | 11.4 |
| 6008 | 13.2 |
| 6009 | 14.5 |
| 6010 | 15 |
| 6011 | 15.3 |
| 6012 | 14.9 |
| 6013 | 13.9 |
| 6014 | 12.7 |
| 6015 | 12.4 |
| 6016 | 12.3 |
| 6017 | 12.2 |
| 6018 | 11.9 |
| 6019 | 11.4 |
| 6020 | 12 |
| 6021 | 12.2 |
| 6022 | 11.7 |
| 6023 | 11 |
| 6024 | 11.6 |
| 6025 | 10.5 |
| 6026 | 9.9 |
| 6027 | 9.8 |
| 6028 | 10 |
| 6029 | 9.8 |
| 6030 | 9.8 |
| 6031 | 10 |
| 6032 | 9.9 |
| 6033 | 9.9 |
| 6034 | 10.3 |
| 6035 | 10.3 |
| 6036 | 9.9 |
| 6037 | 9.7 |
| 6038 | 9.3 |
| 6039 | 8.8 |
| 6040 | 8.9 |
| 6041 | 8.6 |
| 6042 | 8.3 |
| 6043 | 8.6 |
| 6044 | 8.9 |
| 6045 | 8.8 |
| 6046 | 7.8 |
| 6047 | 7.1 |
| 6048 | 3.7 |
| 6049 | 3.6 |
| 6050 | 3.7 |
| 6051 | 4.2 |
| 6052 | 4.8 |
| 6053 | 5.5 |
| 6054 | 6.1 |
| 6055 | 6.4 |
| 6056 | 6.5 |
| 6057 | 6.9 |
| 6058 | 7.5 |
| 6059 | 7.4 |
| 6060 | 7.1 |
| 6061 | 6.6 |
| 6062 | 6.4 |
| 6063 | 6.8 |
| 6064 | 7.3 |
| 6065 | 7.9 |
| 6066 | 8.8 |
| 6067 | 9.5 |
| 6068 | 9.4 |
| 6069 | 8.4 |
| 6070 | 6.8 |
| 6071 | 5.2 |
| 6072 | 2.9 |
| 6073 | 2.6 |
| 6074 | 1.9 |
| 6075 | 1.7 |
| 6076 | 3.5 |
| 6077 | 4.8 |
| 6078 | 5.5 |
| 6079 | 6.2 |
| 6080 | 6.5 |
| 6081 | 6.8 |
| 6082 | 6.9 |
| 6083 | 6.9 |
| 6084 | 6.9 |
| 6085 | 7 |
| 6086 | 6.9 |
| 6087 | 6.8 |
| 6088 | 6.7 |
| 6089 | 6.5 |
| 6090 | 6.3 |
| 6091 | 5.9 |
| 6092 | 4.7 |
| 6093 | 3.3 |
| 6094 | 3.1 |
| 6095 | 2.4 |
| 6096 | 5.1 |
| 6097 | 4.7 |
| 6098 | 4.9 |
| 6099 | 5.6 |
| 6100 | 6.4 |
| 6101 | 7.4 |
| 6102 | 8.4 |
| 6103 | 8.6 |
| 6104 | 8.2 |
| 6105 | 7.8 |
| 6106 | 7.5 |
| 6107 | 7.6 |
| 6108 | 7.7 |
| 6109 | 7.8 |
| 6110 | 7.7 |
| 6111 | 7.3 |
| 6112 | 6.7 |
| 6113 | 6 |
| 6114 | 5.6 |
| 6115 | 5.6 |
| 6116 | 5.5 |
| 6117 | 4.9 |
| 6118 | 4.6 |
| 6119 | 4.1 |
| 6120 | 3.6 |
| 6121 | 3.6 |
| 6122 | 3.3 |
| 6123 | 3.2 |
| 6124 | 3.4 |
| 6125 | 3.8 |
| 6126 | 4.3 |
| 6127 | 5 |
| 6128 | 5.2 |
| 6129 | 5 |
| 6130 | 5 |
| 6131 | 5.3 |
| 6132 | 5.6 |
| 6133 | 5 |
| 6134 | 4.5 |
| 6135 | 4.6 |
| 6136 | 5.1 |
| 6137 | 4.9 |
| 6138 | 4.1 |
| 6139 | 3.1 |
| 6140 | 3.1 |
| 6141 | 2.7 |
| 6142 | 2.3 |
| 6143 | 3.8 |
| 6144 | 5.3 |
| 6145 | 5.2 |
| 6146 | 5.5 |
| 6147 | 5.9 |
| 6148 | 5.6 |
| 6149 | 4.3 |
| 6150 | 4.2 |
| 6151 | 3.8 |
| 6152 | 3.6 |
| 6153 | 3.6 |
| 6154 | 4.1 |
| 6155 | 4.2 |
| 6156 | 4.5 |
| 6157 | 4.6 |
| 6158 | 4.8 |
| 6159 | 5.3 |
| 6160 | 5.7 |
| 6161 | 5.8 |
| 6162 | 5.8 |
| 6163 | 5.8 |
| 6164 | 5.2 |
| 6165 | 3.6 |
| 6166 | 3.3 |
| 6167 | 3 |
| 6168 | 1.7 |
| 6169 | 2.7 |
| 6170 | 3.1 |
| 6171 | 3.2 |
| 6172 | 2.8 |
| 6173 | 2.8 |
| 6174 | 2.2 |
| 6175 | 3.7 |
| 6176 | 4.7 |
| 6177 | 6.1 |
| 6178 | 5.6 |
| 6179 | 4.4 |
| 6180 | 3.8 |
| 6181 | 2.9 |
| 6182 | 2.4 |
| 6183 | 2.6 |
| 6184 | 2.7 |
| 6185 | 2.8 |
| 6186 | 3.4 |
| 6187 | 4.1 |
| 6188 | 4.1 |
| 6189 | 3.1 |
| 6190 | 2.7 |
| 6191 | 2.9 |
| 6192 | 5.6 |
| 6193 | 4.1 |
| 6194 | 3.7 |
| 6195 | 3.3 |
| 6196 | 3.3 |
| 6197 | 4.2 |
| 6198 | 5.6 |
| 6199 | 5.6 |
| 6200 | 5.8 |
| 6201 | 6.9 |
| 6202 | 7.8 |
| 6203 | 8.5 |
| 6204 | 9.3 |
| 6205 | 9.8 |
| 6206 | 9.5 |
| 6207 | 8.1 |
| 6208 | 7.2 |
| 6209 | 5.3 |
| 6210 | 5.3 |
| 6211 | 7.1 |
| 6212 | 9.6 |
| 6213 | 11.7 |
| 6214 | 6 |
| 6215 | 5.1 |
| 6216 | 9.5 |
| 6217 | 8.7 |
| 6218 | 6.6 |
| 6219 | 6.3 |
| 6220 | 6.8 |
| 6221 | 7.8 |
| 6222 | 5.8 |
| 6223 | 2.8 |
| 6224 | 2.2 |
| 6225 | 5.4 |
| 6226 | 8.2 |
| 6227 | 7.3 |
| 6228 | 7.1 |
| 6229 | 6.5 |
| 6230 | 6.5 |
| 6231 | 7.3 |
| 6232 | 7.6 |
| 6233 | 8.6 |
| 6234 | 8.7 |
| 6235 | 9.1 |
| 6236 | 8.1 |
| 6237 | 5.8 |
| 6238 | 4.3 |
| 6239 | 3.1 |
| 6240 | 3.3 |
| 6241 | 3.7 |
| 6242 | 3.6 |
| 6243 | 4.3 |
| 6244 | 4.4 |
| 6245 | 4.8 |
| 6246 | 4.9 |
| 6247 | 4.5 |
| 6248 | 5.4 |
| 6249 | 5.4 |
| 6250 | 4.9 |
| 6251 | 4.3 |
| 6252 | 4.1 |
| 6253 | 3 |
| 6254 | 2.6 |
| 6255 | 2.8 |
| 6256 | 3 |
| 6257 | 3.4 |
| 6258 | 3.7 |
| 6259 | 3.3 |
| 6260 | 2.8 |
| 6261 | 2.2 |
| 6262 | 1.6 |
| 6263 | 2.3 |
| 6264 | 4.5 |
| 6265 | 5.4 |
| 6266 | 5.4 |
| 6267 | 5.1 |
| 6268 | 4.9 |
| 6269 | 4.6 |
| 6270 | 4.7 |
| 6271 | 4.3 |
| 6272 | 3.8 |
| 6273 | 3.4 |
| 6274 | 3.9 |
| 6275 | 4.5 |
| 6276 | 4.5 |
| 6277 | 4.4 |
| 6278 | 4.7 |
| 6279 | 4.3 |
| 6280 | 3.7 |
| 6281 | 3 |
| 6282 | 3.2 |
| 6283 | 2.6 |
| 6284 | 2.3 |
| 6285 | 2 |
| 6286 | 1.9 |
| 6287 | 1.8 |
| 6288 | 1.6 |
| 6289 | 2.2 |
| 6290 | 2.9 |
| 6291 | 4.5 |
| 6292 | 5.5 |
| 6293 | 5 |
| 6294 | 5.7 |
| 6295 | 5.7 |
| 6296 | 5.2 |
| 6297 | 4.4 |
| 6298 | 3.3 |
| 6299 | 3.7 |
| 6300 | 4 |
| 6301 | 2.7 |
| 6302 | 0.7 |
| 6303 | 0.5 |
| 6304 | 0.8 |
| 6305 | 0.2 |
| 6306 | 1.1 |
| 6307 | 1.4 |
| 6308 | 1.6 |
| 6309 | 1 |
| 6310 | 0.3 |
| 6311 | 1.7 |
| 6312 | 2.4 |
| 6313 | 2.2 |
| 6314 | 1.6 |
| 6315 | 1.7 |
| 6316 | 3.5 |
| 6317 | 3.8 |
| 6318 | 4.8 |
| 6319 | 5.3 |
| 6320 | 4.9 |
| 6321 | 4.4 |
| 6322 | 4.2 |
| 6323 | 4.3 |
| 6324 | 3.8 |
| 6325 | 3.3 |
| 6326 | 3.2 |
| 6327 | 2.7 |
| 6328 | 2 |
| 6329 | 0.9 |
| 6330 | 0.4 |
| 6331 | 0.5 |
| 6332 | 0.6 |
| 6333 | 0.5 |
| 6334 | 2.1 |
| 6335 | 2.8 |
| 6336 | 2.2 |
| 6337 | 2.4 |
| 6338 | 2.9 |
| 6339 | 3.7 |
| 6340 | 4.4 |
| 6341 | 4.9 |
| 6342 | 5.9 |
| 6343 | 5.9 |
| 6344 | 6.3 |
| 6345 | 6.4 |
| 6346 | 6.5 |
| 6347 | 6.6 |
| 6348 | 6.2 |
| 6349 | 6.2 |
| 6350 | 6.9 |
| 6351 | 7.4 |
| 6352 | 7.6 |
| 6353 | 8 |
| 6354 | 8.2 |
| 6355 | 7.9 |
| 6356 | 7.9 |
| 6357 | 7.2 |
| 6358 | 6 |
| 6359 | 4.1 |
| 6360 | 5 |
| 6361 | 3.7 |
| 6362 | 2.9 |
| 6363 | 2.7 |
| 6364 | 2.7 |
| 6365 | 3 |
| 6366 | 2 |
| 6367 | 3.2 |
| 6368 | 5.5 |
| 6369 | 6.3 |
| 6370 | 5.8 |
| 6371 | 4.9 |
| 6372 | 6.1 |
| 6373 | 7.2 |
| 6374 | 7.6 |
| 6375 | 8 |
| 6376 | 8.5 |
| 6377 | 8.4 |
| 6378 | 8.3 |
| 6379 | 8.1 |
| 6380 | 7.7 |
| 6381 | 7.2 |
| 6382 | 7.4 |
| 6383 | 6.4 |
| 6384 | 8.5 |
| 6385 | 6.8 |
| 6386 | 6 |
| 6387 | 4.9 |
| 6388 | 4.6 |
| 6389 | 4.6 |
| 6390 | 5.6 |
| 6391 | 7.5 |
| 6392 | 9 |
| 6393 | 9.1 |
| 6394 | 10 |
| 6395 | 10.3 |
| 6396 | 10.1 |
| 6397 | 10.5 |
| 6398 | 11.3 |
| 6399 | 11.1 |
| 6400 | 11 |
| 6401 | 11.7 |
| 6402 | 12.7 |
| 6403 | 13.4 |
| 6404 | 13.6 |
| 6405 | 13.5 |
| 6406 | 12.8 |
| 6407 | 12.5 |
| 6408 | 12.7 |
| 6409 | 11.4 |
| 6410 | 10.4 |
| 6411 | 9.8 |
| 6412 | 8.9 |
| 6413 | 7.9 |
| 6414 | 7.6 |
| 6415 | 9.3 |
| 6416 | 9.1 |
| 6417 | 10.8 |
| 6418 | 12.1 |
| 6419 | 11 |
| 6420 | 9.9 |
| 6421 | 11.9 |
| 6422 | 13.3 |
| 6423 | 14.1 |
| 6424 | 15.3 |
| 6425 | 13.6 |
| 6426 | 11.4 |
| 6427 | 11.2 |
| 6428 | 11.2 |
| 6429 | 11.1 |
| 6430 | 9.7 |
| 6431 | 8.7 |
| 6432 | 6.6 |
| 6433 | 6.3 |
| 6434 | 5.3 |
| 6435 | 4.8 |
| 6436 | 4.4 |
| 6437 | 4.4 |
| 6438 | 5.4 |
| 6439 | 6.5 |
| 6440 | 7 |
| 6441 | 6.3 |
| 6442 | 6.3 |
| 6443 | 6.7 |
| 6444 | 7.1 |
| 6445 | 7.3 |
| 6446 | 7 |
| 6447 | 6.6 |
| 6448 | 6.3 |
| 6449 | 6 |
| 6450 | 5.6 |
| 6451 | 5.3 |
| 6452 | 4.7 |
| 6453 | 3.7 |
| 6454 | 3.6 |
| 6455 | 3.3 |
| 6456 | 0.7 |
| 6457 | 2.4 |
| 6458 | 3.7 |
| 6459 | 4.1 |
| 6460 | 3.9 |
| 6461 | 4 |
| 6462 | 5.2 |
| 6463 | 6 |
| 6464 | 6.5 |
| 6465 | 6.8 |
| 6466 | 6.7 |
| 6467 | 6.4 |
| 6468 | 5.7 |
| 6469 | 5.3 |
| 6470 | 5.2 |
| 6471 | 4.9 |
| 6472 | 5.1 |
| 6473 | 5.1 |
| 6474 | 5.7 |
| 6475 | 5.8 |
| 6476 | 4.8 |
| 6477 | 4.1 |
| 6478 | 4.5 |
| 6479 | 4.3 |
| 6480 | 3.6 |
| 6481 | 3.3 |
| 6482 | 3.8 |
| 6483 | 4.9 |
| 6484 | 5.7 |
| 6485 | 6.3 |
| 6486 | 6.6 |
| 6487 | 7 |
| 6488 | 7 |
| 6489 | 6.8 |
| 6490 | 6.6 |
| 6491 | 6.7 |
| 6492 | 6.8 |
| 6493 | 6.4 |
| 6494 | 6.2 |
| 6495 | 6.5 |
| 6496 | 7.4 |
| 6497 | 8.3 |
| 6498 | 8.5 |
| 6499 | 8.3 |
| 6500 | 7.9 |
| 6501 | 9.2 |
| 6502 | 9.4 |
| 6503 | 9.2 |
| 6504 | 7.9 |
| 6505 | 8.5 |
| 6506 | 8.9 |
| 6507 | 9.6 |
| 6508 | 10.2 |
| 6509 | 10.6 |
| 6510 | 11 |
| 6511 | 11.4 |
| 6512 | 11.7 |
| 6513 | 11.8 |
| 6514 | 11.7 |
| 6515 | 11.8 |
| 6516 | 12.2 |
| 6517 | 11.9 |
| 6518 | 11.7 |
| 6519 | 11.7 |
| 6520 | 11.5 |
| 6521 | 11.6 |
| 6522 | 11.9 |
| 6523 | 11.8 |
| 6524 | 12.2 |
| 6525 | 12.5 |
| 6526 | 12.2 |
| 6527 | 11.8 |
| 6528 | 9.2 |
| 6529 | 8.7 |
| 6530 | 8 |
| 6531 | 7.7 |
| 6532 | 7.7 |
| 6533 | 7.5 |
| 6534 | 8.9 |
| 6535 | 9.2 |
| 6536 | 9.2 |
| 6537 | 8.7 |
| 6538 | 7.8 |
| 6539 | 7 |
| 6540 | 7.1 |
| 6541 | 7.4 |
| 6542 | 7.6 |
| 6543 | 7.4 |
| 6544 | 6.2 |
| 6545 | 6 |
| 6546 | 6.4 |
| 6547 | 7.4 |
| 6548 | 7.2 |
| 6549 | 6.3 |
| 6550 | 5.9 |
| 6551 | 4.8 |
| 6552 | 2 |
| 6553 | 2.1 |
| 6554 | 1.8 |
| 6555 | 1.8 |
| 6556 | 2.3 |
| 6557 | 3.5 |
| 6558 | 4.6 |
| 6559 | 4.2 |
| 6560 | 3.4 |
| 6561 | 3.3 |
| 6562 | 3.2 |
| 6563 | 2.7 |
| 6564 | 1.9 |
| 6565 | 1.1 |
| 6566 | 1.1 |
| 6567 | 1.3 |
| 6568 | 1.2 |
| 6569 | 1.1 |
| 6570 | 1.1 |
| 6571 | 1.6 |
| 6572 | 2.3 |
| 6573 | 2.8 |
| 6574 | 2.9 |
| 6575 | 2.9 |
| 6576 | 0.7 |
| 6577 | 0.9 |
| 6578 | 1.6 |
| 6579 | 1.7 |
| 6580 | 2.3 |
| 6581 | 3.3 |
| 6582 | 4.4 |
| 6583 | 4.8 |
| 6584 | 4.8 |
| 6585 | 4.3 |
| 6586 | 4.4 |
| 6587 | 4.4 |
| 6588 | 3.9 |
| 6589 | 3.2 |
| 6590 | 3.3 |
| 6591 | 4.4 |
| 6592 | 5.2 |
| 6593 | 6.2 |
| 6594 | 6.8 |
| 6595 | 7.2 |
| 6596 | 7.8 |
| 6597 | 8.3 |
| 6598 | 8.4 |
| 6599 | 8.2 |
| 6600 | 13.2 |
| 6601 | 14 |
| 6602 | 8.6 |
| 6603 | 6.7 |
| 6604 | 6.1 |
| 6605 | 5 |
| 6606 | 5 |
| 6607 | 6.3 |
| 6608 | 6.5 |
| 6609 | 6.4 |
| 6610 | 6.7 |
| 6611 | 7 |
| 6612 | 7.6 |
| 6613 | 8 |
| 6614 | 8.4 |
| 6615 | 7.8 |
| 6616 | 8 |
| 6617 | 7.1 |
| 6618 | 8 |
| 6619 | 7.7 |
| 6620 | 7.8 |
| 6621 | 8.7 |
| 6622 | 7.8 |
| 6623 | 7.7 |
| 6624 | 7.3 |
| 6625 | 7.1 |
| 6626 | 8.1 |
| 6627 | 8.1 |
| 6628 | 8.3 |
| 6629 | 8.6 |
| 6630 | 8.4 |
| 6631 | 8.5 |
| 6632 | 9.7 |
| 6633 | 9.8 |
| 6634 | 9.6 |
| 6635 | 9.8 |
| 6636 | 9.5 |
| 6637 | 9.1 |
| 6638 | 9.3 |
| 6639 | 9.1 |
| 6640 | 9 |
| 6641 | 8 |
| 6642 | 7.3 |
| 6643 | 7.7 |
| 6644 | 7.1 |
| 6645 | 6.4 |
| 6646 | 6.4 |
| 6647 | 5.4 |
| 6648 | 5.7 |
| 6649 | 6.2 |
| 6650 | 5.8 |
| 6651 | 5.4 |
| 6652 | 5.8 |
| 6653 | 6.6 |
| 6654 | 7 |
| 6655 | 7.8 |
| 6656 | 9.1 |
| 6657 | 8.7 |
| 6658 | 7.7 |
| 6659 | 7.3 |
| 6660 | 7.8 |
| 6661 | 9.1 |
| 6662 | 9.3 |
| 6663 | 10.4 |
| 6664 | 11.6 |
| 6665 | 12 |
| 6666 | 11.7 |
| 6667 | 12 |
| 6668 | 11.9 |
| 6669 | 11.9 |
| 6670 | 11.3 |
| 6671 | 8.6 |
| 6672 | 12 |
| 6673 | 10.4 |
| 6674 | 9.8 |
| 6675 | 8.3 |
| 6676 | 9 |
| 6677 | 8.9 |
| 6678 | 10.3 |
| 6679 | 12.8 |
| 6680 | 15.8 |
| 6681 | 17 |
| 6682 | 18.1 |
| 6683 | 18.4 |
| 6684 | 18.2 |
| 6685 | 18.8 |
| 6686 | 18.8 |
| 6687 | 18.8 |
| 6688 | 18.3 |
| 6689 | 18.5 |
| 6690 | 18.9 |
| 6691 | 17.4 |
| 6692 | 16.7 |
| 6693 | 16.4 |
| 6694 | 14.8 |
| 6695 | 15.7 |
| 6696 | 3.4 |
| 6697 | 4 |
| 6698 | 4.6 |
| 6699 | 5.1 |
| 6700 | 5.1 |
| 6701 | 5.8 |
| 6702 | 6.3 |
| 6703 | 6 |
| 6704 | 5.7 |
| 6705 | 5.7 |
| 6706 | 5.2 |
| 6707 | 5.4 |
| 6708 | 5.1 |
| 6709 | 5 |
| 6710 | 5 |
| 6711 | 4.6 |
| 6712 | 4.5 |
| 6713 | 4.3 |
| 6714 | 3.3 |
| 6715 | 3 |
| 6716 | 3.3 |
| 6717 | 3 |
| 6718 | 2.2 |
| 6719 | 1.4 |
| 6720 | 1.3 |
| 6721 | 2.1 |
| 6722 | 2.9 |
| 6723 | 3.3 |
| 6724 | 3.5 |
| 6725 | 3.7 |
| 6726 | 4.2 |
| 6727 | 3.7 |
| 6728 | 3.1 |
| 6729 | 2.8 |
| 6730 | 2.7 |
| 6731 | 3.3 |
| 6732 | 3.9 |
| 6733 | 4.4 |
| 6734 | 4.5 |
| 6735 | 4.6 |
| 6736 | 4.8 |
| 6737 | 4.7 |
| 6738 | 4.7 |
| 6739 | 4.5 |
| 6740 | 4 |
| 6741 | 3.7 |
| 6742 | 3.8 |
| 6743 | 4.1 |
| 6744 | 3.8 |
| 6745 | 4.5 |
| 6746 | 4.8 |
| 6747 | 3.9 |
| 6748 | 4.6 |
| 6749 | 4.6 |
| 6750 | 5 |
| 6751 | 4.7 |
| 6752 | 5.2 |
| 6753 | 5.3 |
| 6754 | 5.5 |
| 6755 | 5.3 |
| 6756 | 4.9 |
| 6757 | 5.1 |
| 6758 | 4.6 |
| 6759 | 4.4 |
| 6760 | 5 |
| 6761 | 5.1 |
| 6762 | 4.7 |
| 6763 | 4.6 |
| 6764 | 5.4 |
| 6765 | 5.1 |
| 6766 | 5.1 |
| 6767 | 5.7 |
| 6768 | 4.5 |
| 6769 | 4.5 |
| 6770 | 4.5 |
| 6771 | 4.8 |
| 6772 | 5.2 |
| 6773 | 5.4 |
| 6774 | 5.6 |
| 6775 | 5.3 |
| 6776 | 4.7 |
| 6777 | 5.2 |
| 6778 | 5.5 |
| 6779 | 5.2 |
| 6780 | 4.6 |
| 6781 | 4.4 |
| 6782 | 4.1 |
| 6783 | 4.3 |
| 6784 | 4.6 |
| 6785 | 4.8 |
| 6786 | 3.9 |
| 6787 | 4.2 |
| 6788 | 4.6 |
| 6789 | 5.1 |
| 6790 | 5.3 |
| 6791 | 4.6 |
| 6792 | 2.2 |
| 6793 | 2.5 |
| 6794 | 2.6 |
| 6795 | 2.6 |
| 6796 | 2.9 |
| 6797 | 2.6 |
| 6798 | 4.2 |
| 6799 | 4.7 |
| 6800 | 4.7 |
| 6801 | 4.9 |
| 6802 | 4.9 |
| 6803 | 4.8 |
| 6804 | 4.7 |
| 6805 | 4.7 |
| 6806 | 4.6 |
| 6807 | 4.8 |
| 6808 | 5 |
| 6809 | 4.1 |
| 6810 | 3.5 |
| 6811 | 2.7 |
| 6812 | 2.2 |
| 6813 | 1.2 |
| 6814 | 0.6 |
| 6815 | 1.3 |
| 6816 | 4 |
| 6817 | 2.7 |
| 6818 | 3 |
| 6819 | 3.7 |
| 6820 | 4.8 |
| 6821 | 4.8 |
| 6822 | 4.2 |
| 6823 | 2.6 |
| 6824 | 1.7 |
| 6825 | 3.7 |
| 6826 | 4.4 |
| 6827 | 4.9 |
| 6828 | 6.5 |
| 6829 | 7.4 |
| 6830 | 7.1 |
| 6831 | 6.5 |
| 6832 | 7.1 |
| 6833 | 6.2 |
| 6834 | 4.8 |
| 6835 | 6.4 |
| 6836 | 5.6 |
| 6837 | 4.9 |
| 6838 | 3.7 |
| 6839 | 3.2 |
| 6840 | 5.4 |
| 6841 | 4.8 |
| 6842 | 5.1 |
| 6843 | 5.1 |
| 6844 | 5 |
| 6845 | 4.8 |
| 6846 | 4.5 |
| 6847 | 4.8 |
| 6848 | 2.4 |
| 6849 | 3.4 |
| 6850 | 5.4 |
| 6851 | 4.9 |
| 6852 | 3.7 |
| 6853 | 3.7 |
| 6854 | 4.3 |
| 6855 | 4.7 |
| 6856 | 3.8 |
| 6857 | 2.1 |
| 6858 | 1.8 |
| 6859 | 2 |
| 6860 | 2.7 |
| 6861 | 2.1 |
| 6862 | 1.9 |
| 6863 | 2.5 |
| 6864 | 2.8 |
| 6865 | 3.1 |
| 6866 | 3.7 |
| 6867 | 4.6 |
| 6868 | 5.3 |
| 6869 | 6.5 |
| 6870 | 7 |
| 6871 | 8.5 |
| 6872 | 9.8 |
| 6873 | 10.5 |
| 6874 | 11.3 |
| 6875 | 11.8 |
| 6876 | 11.3 |
| 6877 | 11 |
| 6878 | 11.3 |
| 6879 | 11.6 |
| 6880 | 12 |
| 6881 | 11.2 |
| 6882 | 10.2 |
| 6883 | 9.6 |
| 6884 | 9.4 |
| 6885 | 9.2 |
| 6886 | 9.9 |
| 6887 | 9.7 |
| 6888 | 12.9 |
| 6889 | 12.8 |
| 6890 | 12.5 |
| 6891 | 12.5 |
| 6892 | 12.8 |
| 6893 | 11.8 |
| 6894 | 10.3 |
| 6895 | 9.5 |
| 6896 | 9 |
| 6897 | 8.9 |
| 6898 | 9.7 |
| 6899 | 10.8 |
| 6900 | 11.5 |
| 6901 | 10.8 |
| 6902 | 8.7 |
| 6903 | 7.6 |
| 6904 | 6.5 |
| 6905 | 5.8 |
| 6906 | 8 |
| 6907 | 12.1 |
| 6908 | 13 |
| 6909 | 12.2 |
| 6910 | 10.3 |
| 6911 | 9.2 |
| 6912 | 4.9 |
| 6913 | 4.6 |
| 6914 | 4.7 |
| 6915 | 5.1 |
| 6916 | 5.2 |
| 6917 | 4.4 |
| 6918 | 3.7 |
| 6919 | 5 |
| 6920 | 2.8 |
| 6921 | 2.4 |
| 6922 | 3.3 |
| 6923 | 3.7 |
| 6924 | 3.8 |
| 6925 | 3.7 |
| 6926 | 3.4 |
| 6927 | 3.5 |
| 6928 | 4.5 |
| 6929 | 4 |
| 6930 | 3.6 |
| 6931 | 3.1 |
| 6932 | 1.9 |
| 6933 | 2.3 |
| 6934 | 2.9 |
| 6935 | 3.4 |
| 6936 | 5.4 |
| 6937 | 5 |
| 6938 | 4.9 |
| 6939 | 5.6 |
| 6940 | 6.2 |
| 6941 | 6.1 |
| 6942 | 6.1 |
| 6943 | 6 |
| 6944 | 6.1 |
| 6945 | 6.5 |
| 6946 | 6.7 |
| 6947 | 6.4 |
| 6948 | 6.2 |
| 6949 | 6.2 |
| 6950 | 6 |
| 6951 | 5.5 |
| 6952 | 5.7 |
| 6953 | 6.2 |
| 6954 | 6.2 |
| 6955 | 6 |
| 6956 | 6 |
| 6957 | 5.8 |
| 6958 | 4.5 |
| 6959 | 3.2 |
| 6960 | 6.5 |
| 6961 | 5.3 |
| 6962 | 4.1 |
| 6963 | 3.6 |
| 6964 | 3.9 |
| 6965 | 5.1 |
| 6966 | 5.8 |
| 6967 | 6.6 |
| 6968 | 6.2 |
| 6969 | 6.2 |
| 6970 | 6.4 |
| 6971 | 6.4 |
| 6972 | 6.8 |
| 6973 | 8.2 |
| 6974 | 9.2 |
| 6975 | 9.2 |
| 6976 | 8.8 |
| 6977 | 8.2 |
| 6978 | 7.3 |
| 6979 | 7 |
| 6980 | 7.2 |
| 6981 | 4.7 |
| 6982 | 4.5 |
| 6983 | 3.7 |
| 6984 | 4 |
| 6985 | 3.3 |
| 6986 | 2.6 |
| 6987 | 1.8 |
| 6988 | 1.8 |
| 6989 | 2.5 |
| 6990 | 3.6 |
| 6991 | 3.9 |
| 6992 | 4.2 |
| 6993 | 4.2 |
| 6994 | 4.2 |
| 6995 | 4.2 |
| 6996 | 3.6 |
| 6997 | 3.9 |
| 6998 | 4 |
| 6999 | 3.8 |
| 7000 | 4.8 |
| 7001 | 4.3 |
| 7002 | 3.8 |
| 7003 | 3.4 |
| 7004 | 3.6 |
| 7005 | 4.1 |
| 7006 | 4.4 |
| 7007 | 5.1 |
| 7008 | 9.3 |
| 7009 | 9.4 |
| 7010 | 9.5 |
| 7011 | 9.1 |
| 7012 | 10.4 |
| 7013 | 10.3 |
| 7014 | 9.9 |
| 7015 | 8.9 |
| 7016 | 8.9 |
| 7017 | 10.6 |
| 7018 | 11.4 |
| 7019 | 12.6 |
| 7020 | 13 |
| 7021 | 12.4 |
| 7022 | 12.3 |
| 7023 | 12.4 |
| 7024 | 12.7 |
| 7025 | 12.7 |
| 7026 | 12.8 |
| 7027 | 13.3 |
| 7028 | 13.2 |
| 7029 | 12.9 |
| 7030 | 12.3 |
| 7031 | 12.9 |
| 7032 | 13.8 |
| 7033 | 13.7 |
| 7034 | 14.2 |
| 7035 | 14 |
| 7036 | 13.4 |
| 7037 | 12.2 |
| 7038 | 11.8 |
| 7039 | 12.3 |
| 7040 | 13.3 |
| 7041 | 13.2 |
| 7042 | 11.7 |
| 7043 | 10.9 |
| 7044 | 10.4 |
| 7045 | 11 |
| 7046 | 11 |
| 7047 | 10.4 |
| 7048 | 9.6 |
| 7049 | 8 |
| 7050 | 7.4 |
| 7051 | 8.4 |
| 7052 | 9.1 |
| 7053 | 10.2 |
| 7054 | 10.7 |
| 7055 | 10.2 |
| 7056 | 9.6 |
| 7057 | 9.6 |
| 7058 | 9.4 |
| 7059 | 9 |
| 7060 | 9.5 |
| 7061 | 7.9 |
| 7062 | 8.2 |
| 7063 | 7.1 |
| 7064 | 8.5 |
| 7065 | 10.9 |
| 7066 | 11.8 |
| 7067 | 13.7 |
| 7068 | 10.7 |
| 7069 | 9.1 |
| 7070 | 8.3 |
| 7071 | 7.1 |
| 7072 | 7.2 |
| 7073 | 7.1 |
| 7074 | 5 |
| 7075 | 6 |
| 7076 | 7.2 |
| 7077 | 7.3 |
| 7078 | 7.3 |
| 7079 | 6.4 |
| 7080 | 7.9 |
| 7081 | 6.9 |
| 7082 | 5.4 |
| 7083 | 5.4 |
| 7084 | 6.6 |
| 7085 | 6.2 |
| 7086 | 5.4 |
| 7087 | 4.4 |
| 7088 | 4.9 |
| 7089 | 4.9 |
| 7090 | 4.3 |
| 7091 | 3.6 |
| 7092 | 1.8 |
| 7093 | 3.2 |
| 7094 | 2.5 |
| 7095 | 7.9 |
| 7096 | 1.4 |
| 7097 | 2.3 |
| 7098 | 4.3 |
| 7099 | 1.6 |
| 7100 | 2.8 |
| 7101 | 3.4 |
| 7102 | 2.7 |
| 7103 | 2.7 |
| 7104 | 1.7 |
| 7105 | 2.5 |
| 7106 | 2.4 |
| 7107 | 1.9 |
| 7108 | 1 |
| 7109 | 1.9 |
| 7110 | 3.4 |
| 7111 | 2.9 |
| 7112 | 3.4 |
| 7113 | 3.1 |
| 7114 | 3.2 |
| 7115 | 3.6 |
| 7116 | 3.5 |
| 7117 | 2.5 |
| 7118 | 2.6 |
| 7119 | 4.6 |
| 7120 | 4.3 |
| 7121 | 4.5 |
| 7122 | 5.3 |
| 7123 | 6.4 |
| 7124 | 6.4 |
| 7125 | 4.1 |
| 7126 | 4 |
| 7127 | 5.6 |
| 7128 | 5.4 |
| 7129 | 7 |
| 7130 | 7.5 |
| 7131 | 7.2 |
| 7132 | 5.3 |
| 7133 | 5.1 |
| 7134 | 5.2 |
| 7135 | 5.5 |
| 7136 | 5.4 |
| 7137 | 5.5 |
| 7138 | 5.3 |
| 7139 | 5.1 |
| 7140 | 5.6 |
| 7141 | 6 |
| 7142 | 4.9 |
| 7143 | 5.3 |
| 7144 | 4.4 |
| 7145 | 5.4 |
| 7146 | 4.9 |
| 7147 | 5.5 |
| 7148 | 5.2 |
| 7149 | 5.4 |
| 7150 | 6.1 |
| 7151 | 7.9 |
| 7152 | 9.4 |
| 7153 | 9 |
| 7154 | 8.9 |
| 7155 | 8.8 |
| 7156 | 8.2 |
| 7157 | 7.8 |
| 7158 | 7.9 |
| 7159 | 7.7 |
| 7160 | 6.3 |
| 7161 | 6.2 |
| 7162 | 5.2 |
| 7163 | 5.7 |
| 7164 | 7.3 |
| 7165 | 7.4 |
| 7166 | 5.8 |
| 7167 | 7.3 |
| 7168 | 5.7 |
| 7169 | 5.9 |
| 7170 | 5.9 |
| 7171 | 5.7 |
| 7172 | 6.1 |
| 7173 | 5.7 |
| 7174 | 6.2 |
| 7175 | 6.6 |
| 7176 | 7 |
| 7177 | 6.5 |
| 7178 | 6.7 |
| 7179 | 7.3 |
| 7180 | 7.6 |
| 7181 | 7.1 |
| 7182 | 8 |
| 7183 | 8.8 |
| 7184 | 8.4 |
| 7185 | 7.4 |
| 7186 | 6.4 |
| 7187 | 6.5 |
| 7188 | 5.6 |
| 7189 | 6.6 |
| 7190 | 6.6 |
| 7191 | 8 |
| 7192 | 8.5 |
| 7193 | 7.6 |
| 7194 | 6 |
| 7195 | 5.7 |
| 7196 | 5.4 |
| 7197 | 5.7 |
| 7198 | 5.8 |
| 7199 | 4.9 |
| 7200 | 6.2 |
| 7201 | 7.1 |
| 7202 | 6.2 |
| 7203 | 5.3 |
| 7204 | 5.3 |
| 7205 | 5.9 |
| 7206 | 7.4 |
| 7207 | 8.6 |
| 7208 | 7.8 |
| 7209 | 5.1 |
| 7210 | 4.7 |
| 7211 | 5.1 |
| 7212 | 5 |
| 7213 | 5.3 |
| 7214 | 5.4 |
| 7215 | 5.6 |
| 7216 | 5.9 |
| 7217 | 6.6 |
| 7218 | 7.9 |
| 7219 | 7.4 |
| 7220 | 6.8 |
| 7221 | 6.9 |
| 7222 | 7.2 |
| 7223 | 7.6 |
| 7224 | 5 |
| 7225 | 5.1 |
| 7226 | 5.8 |
| 7227 | 6 |
| 7228 | 5.5 |
| 7229 | 4.7 |
| 7230 | 5.4 |
| 7231 | 5.9 |
| 7232 | 6.3 |
| 7233 | 6.3 |
| 7234 | 7.1 |
| 7235 | 7.3 |
| 7236 | 7.5 |
| 7237 | 7.6 |
| 7238 | 7.9 |
| 7239 | 7.4 |
| 7240 | 6.7 |
| 7241 | 6.8 |
| 7242 | 6.5 |
| 7243 | 6.5 |
| 7244 | 6.3 |
| 7245 | 5.8 |
| 7246 | 5.3 |
| 7247 | 5 |
| 7248 | 1.5 |
| 7249 | 1.3 |
| 7250 | 1.2 |
| 7251 | 1.1 |
| 7252 | 1.4 |
| 7253 | 1.6 |
| 7254 | 1.6 |
| 7255 | 1.5 |
| 7256 | 1.7 |
| 7257 | 2.2 |
| 7258 | 2 |
| 7259 | 1.9 |
| 7260 | 2.2 |
| 7261 | 2.5 |
| 7262 | 2.5 |
| 7263 | 3.1 |
| 7264 | 4.9 |
| 7265 | 6.6 |
| 7266 | 7 |
| 7267 | 7.2 |
| 7268 | 7.4 |
| 7269 | 7.3 |
| 7270 | 7.1 |
| 7271 | 6.9 |
| 7272 | 6.6 |
| 7273 | 6.6 |
| 7274 | 6.3 |
| 7275 | 6 |
| 7276 | 6.2 |
| 7277 | 6.3 |
| 7278 | 5.9 |
| 7279 | 5.4 |
| 7280 | 5 |
| 7281 | 4.8 |
| 7282 | 4.9 |
| 7283 | 4.8 |
| 7284 | 4.5 |
| 7285 | 3.8 |
| 7286 | 3.1 |
| 7287 | 2.7 |
| 7288 | 3.2 |
| 7289 | 3.9 |
| 7290 | 3.9 |
| 7291 | 3.9 |
| 7292 | 4.2 |
| 7293 | 4.4 |
| 7294 | 3.9 |
| 7295 | 3.7 |
| 7296 | 6.2 |
| 7297 | 6.5 |
| 7298 | 6.3 |
| 7299 | 6.1 |
| 7300 | 6.7 |
| 7301 | 7.7 |
| 7302 | 5.8 |
| 7303 | 5.3 |
| 7304 | 4.4 |
| 7305 | 5.2 |
| 7306 | 6.2 |
| 7307 | 6.4 |
| 7308 | 6.3 |
| 7309 | 6.4 |
| 7310 | 6.1 |
| 7311 | 6.9 |
| 7312 | 7.5 |
| 7313 | 7.6 |
| 7314 | 8.6 |
| 7315 | 8.8 |
| 7316 | 9.3 |
| 7317 | 9.3 |
| 7318 | 10.2 |
| 7319 | 10.6 |
| 7320 | 12 |
| 7321 | 11.3 |
| 7322 | 10.8 |
| 7323 | 10 |
| 7324 | 9.3 |
| 7325 | 8.9 |
| 7326 | 9.2 |
| 7327 | 8.8 |
| 7328 | 9 |
| 7329 | 9.1 |
| 7330 | 8.8 |
| 7331 | 7.9 |
| 7332 | 7.7 |
| 7333 | 7.6 |
| 7334 | 7.5 |
| 7335 | 7.1 |
| 7336 | 6 |
| 7337 | 5.3 |
| 7338 | 5.1 |
| 7339 | 6 |
| 7340 | 6.7 |
| 7341 | 6.6 |
| 7342 | 7.3 |
| 7343 | 7.8 |
| 7344 | 5.9 |
| 7345 | 5 |
| 7346 | 4.4 |
| 7347 | 4.1 |
| 7348 | 4.4 |
| 7349 | 5.6 |
| 7350 | 6.8 |
| 7351 | 6.7 |
| 7352 | 6.2 |
| 7353 | 5.8 |
| 7354 | 5.6 |
| 7355 | 5.8 |
| 7356 | 6.7 |
| 7357 | 6.9 |
| 7358 | 6.7 |
| 7359 | 6 |
| 7360 | 4.9 |
| 7361 | 4.1 |
| 7362 | 3.6 |
| 7363 | 4 |
| 7364 | 4.3 |
| 7365 | 4.6 |
| 7366 | 4.2 |
| 7367 | 4.2 |
| 7368 | 5.4 |
| 7369 | 5.5 |
| 7370 | 5.5 |
| 7371 | 5.3 |
| 7372 | 4.8 |
| 7373 | 4.3 |
| 7374 | 4.1 |
| 7375 | 4.2 |
| 7376 | 6 |
| 7377 | 8.2 |
| 7378 | 9 |
| 7379 | 8.9 |
| 7380 | 9.2 |
| 7381 | 10.2 |
| 7382 | 11.2 |
| 7383 | 11.2 |
| 7384 | 10.7 |
| 7385 | 10.1 |
| 7386 | 9.6 |
| 7387 | 9.3 |
| 7388 | 9 |
| 7389 | 8.3 |
| 7390 | 7.7 |
| 7391 | 6.9 |
| 7392 | 7 |
| 7393 | 5.4 |
| 7394 | 4.6 |
| 7395 | 4.8 |
| 7396 | 4.8 |
| 7397 | 4.6 |
| 7398 | 4.6 |
| 7399 | 4.7 |
| 7400 | 5.6 |
| 7401 | 6.3 |
| 7402 | 7.2 |
| 7403 | 8.1 |
| 7404 | 8.2 |
| 7405 | 8.2 |
| 7406 | 8.5 |
| 7407 | 8.6 |
| 7408 | 9 |
| 7409 | 9.6 |
| 7410 | 10.2 |
| 7411 | 10.4 |
| 7412 | 10.4 |
| 7413 | 10.2 |
| 7414 | 10.3 |
| 7415 | 9.9 |
| 7416 | 7.1 |
| 7417 | 5.7 |
| 7418 | 4.7 |
| 7419 | 4.1 |
| 7420 | 3.6 |
| 7421 | 3.5 |
| 7422 | 3.5 |
| 7423 | 3.7 |
| 7424 | 4.7 |
| 7425 | 6.1 |
| 7426 | 6.4 |
| 7427 | 6.5 |
| 7428 | 6.9 |
| 7429 | 7.6 |
| 7430 | 8.5 |
| 7431 | 9.2 |
| 7432 | 9.6 |
| 7433 | 9.8 |
| 7434 | 10 |
| 7435 | 9.9 |
| 7436 | 9.6 |
| 7437 | 8.8 |
| 7438 | 7.9 |
| 7439 | 6.9 |
| 7440 | 3.2 |
| 7441 | 2.3 |
| 7442 | 3.5 |
| 7443 | 4.6 |
| 7444 | 5.2 |
| 7445 | 6 |
| 7446 | 7.5 |
| 7447 | 7.6 |
| 7448 | 6.8 |
| 7449 | 6.2 |
| 7450 | 6.1 |
| 7451 | 6.1 |
| 7452 | 6 |
| 7453 | 5.7 |
| 7454 | 5.7 |
| 7455 | 5.8 |
| 7456 | 6.1 |
| 7457 | 6.2 |
| 7458 | 5.9 |
| 7459 | 5.8 |
| 7460 | 6 |
| 7461 | 6.1 |
| 7462 | 6.7 |
| 7463 | 7.3 |
| 7464 | 8.4 |
| 7465 | 8.7 |
| 7466 | 9 |
| 7467 | 8.9 |
| 7468 | 8.4 |
| 7469 | 8 |
| 7470 | 8.5 |
| 7471 | 9.5 |
| 7472 | 9.7 |
| 7473 | 9.7 |
| 7474 | 9.2 |
| 7475 | 8.6 |
| 7476 | 8.4 |
| 7477 | 7.6 |
| 7478 | 7.5 |
| 7479 | 7.8 |
| 7480 | 7.8 |
| 7481 | 7.3 |
| 7482 | 6.9 |
| 7483 | 6.9 |
| 7484 | 7.8 |
| 7485 | 8.5 |
| 7486 | 8.1 |
| 7487 | 7.8 |
| 7488 | 9.6 |
| 7489 | 8.5 |
| 7490 | 7.8 |
| 7491 | 7.3 |
| 7492 | 6.6 |
| 7493 | 5.8 |
| 7494 | 6.5 |
| 7495 | 8 |
| 7496 | 9 |
| 7497 | 8.4 |
| 7498 | 8.6 |
| 7499 | 10.2 |
| 7500 | 12.2 |
| 7501 | 12.3 |
| 7502 | 13.4 |
| 7503 | 12.7 |
| 7504 | 11.3 |
| 7505 | 10.3 |
| 7506 | 8.6 |
| 7507 | 7.8 |
| 7508 | 9.7 |
| 7509 | 10.5 |
| 7510 | 10.6 |
| 7511 | 9.9 |
| 7512 | 5 |
| 7513 | 4.1 |
| 7514 | 3.6 |
| 7515 | 3.3 |
| 7516 | 3.3 |
| 7517 | 3.4 |
| 7518 | 3.9 |
| 7519 | 4.6 |
| 7520 | 5.1 |
| 7521 | 5 |
| 7522 | 4.8 |
| 7523 | 4.7 |
| 7524 | 5.1 |
| 7525 | 5.3 |
| 7526 | 5.2 |
| 7527 | 5.9 |
| 7528 | 5.9 |
| 7529 | 5.9 |
| 7530 | 6 |
| 7531 | 6.2 |
| 7532 | 6.2 |
| 7533 | 6.2 |
| 7534 | 5.1 |
| 7535 | 4.3 |
| 7536 | 3.7 |
| 7537 | 4.6 |
| 7538 | 4.8 |
| 7539 | 5.5 |
| 7540 | 6.5 |
| 7541 | 6.7 |
| 7542 | 7 |
| 7543 | 7.6 |
| 7544 | 7.2 |
| 7545 | 6.3 |
| 7546 | 6.3 |
| 7547 | 6 |
| 7548 | 5.6 |
| 7549 | 7.3 |
| 7550 | 8.7 |
| 7551 | 8.3 |
| 7552 | 7.9 |
| 7553 | 7.8 |
| 7554 | 7.3 |
| 7555 | 7.2 |
| 7556 | 7.2 |
| 7557 | 7.6 |
| 7558 | 7.8 |
| 7559 | 7.9 |
| 7560 | 6 |
| 7561 | 6 |
| 7562 | 6.1 |
| 7563 | 5.9 |
| 7564 | 5 |
| 7565 | 5.4 |
| 7566 | 5.9 |
| 7567 | 6.1 |
| 7568 | 6.5 |
| 7569 | 6.6 |
| 7570 | 6.9 |
| 7571 | 7.1 |
| 7572 | 6.6 |
| 7573 | 6.5 |
| 7574 | 6.7 |
| 7575 | 7 |
| 7576 | 7.4 |
| 7577 | 7.3 |
| 7578 | 7.2 |
| 7579 | 7.1 |
| 7580 | 6.6 |
| 7581 | 6.2 |
| 7582 | 5.6 |
| 7583 | 5.3 |
| 7584 | 2.3 |
| 7585 | 2.5 |
| 7586 | 2.9 |
| 7587 | 3.4 |
| 7588 | 4.4 |
| 7589 | 5 |
| 7590 | 5.4 |
| 7591 | 5.6 |
| 7592 | 5.7 |
| 7593 | 6.1 |
| 7594 | 6.7 |
| 7595 | 7.1 |
| 7596 | 8 |
| 7597 | 8.5 |
| 7598 | 8.3 |
| 7599 | 7.6 |
| 7600 | 9.3 |
| 7601 | 10.5 |
| 7602 | 9.5 |
| 7603 | 7.7 |
| 7604 | 7.3 |
| 7605 | 8 |
| 7606 | 8.3 |
| 7607 | 9.2 |
| 7608 | 7.9 |
| 7609 | 10 |
| 7610 | 7.2 |
| 7611 | 8 |
| 7612 | 7.2 |
| 7613 | 7.3 |
| 7614 | 8.7 |
| 7615 | 8.6 |
| 7616 | 6.9 |
| 7617 | 6 |
| 7618 | 5.9 |
| 7619 | 6.8 |
| 7620 | 7.4 |
| 7621 | 6.4 |
| 7622 | 6.7 |
| 7623 | 6.5 |
| 7624 | 9.6 |
| 7625 | 8.3 |
| 7626 | 7.3 |
| 7627 | 6.8 |
| 7628 | 7 |
| 7629 | 9.9 |
| 7630 | 10.9 |
| 7631 | 10.9 |
| 7632 | 11.8 |
| 7633 | 11.4 |
| 7634 | 10.3 |
| 7635 | 10 |
| 7636 | 9.8 |
| 7637 | 7.9 |
| 7638 | 6.7 |
| 7639 | 7.3 |
| 7640 | 7.3 |
| 7641 | 7.7 |
| 7642 | 8.4 |
| 7643 | 8.7 |
| 7644 | 8.4 |
| 7645 | 8.3 |
| 7646 | 7.9 |
| 7647 | 7.9 |
| 7648 | 7.7 |
| 7649 | 8.1 |
| 7650 | 8.9 |
| 7651 | 9.6 |
| 7652 | 9.8 |
| 7653 | 9.1 |
| 7654 | 8.1 |
| 7655 | 7.4 |
| 7656 | 6.5 |
| 7657 | 6.8 |
| 7658 | 7 |
| 7659 | 6.6 |
| 7660 | 5.7 |
| 7661 | 5.3 |
| 7662 | 5.7 |
| 7663 | 6.8 |
| 7664 | 7.7 |
| 7665 | 8.1 |
| 7666 | 7.4 |
| 7667 | 8 |
| 7668 | 8.1 |
| 7669 | 8 |
| 7670 | 10.2 |
| 7671 | 11.1 |
| 7672 | 11.6 |
| 7673 | 11.8 |
| 7674 | 11.3 |
| 7675 | 10 |
| 7676 | 9.2 |
| 7677 | 9.7 |
| 7678 | 8.2 |
| 7679 | 8.3 |
| 7680 | 4.6 |
| 7681 | 3.3 |
| 7682 | 2.5 |
| 7683 | 3.9 |
| 7684 | 3.9 |
| 7685 | 4.4 |
| 7686 | 4.6 |
| 7687 | 4.5 |
| 7688 | 4.4 |
| 7689 | 4.8 |
| 7690 | 5.1 |
| 7691 | 5.6 |
| 7692 | 6 |
| 7693 | 6.1 |
| 7694 | 5.8 |
| 7695 | 5.2 |
| 7696 | 4.8 |
| 7697 | 4.5 |
| 7698 | 4.3 |
| 7699 | 4.8 |
| 7700 | 5.4 |
| 7701 | 6.2 |
| 7702 | 6.2 |
| 7703 | 6.7 |
| 7704 | 10 |
| 7705 | 11 |
| 7706 | 10.9 |
| 7707 | 10.5 |
| 7708 | 7.9 |
| 7709 | 8.7 |
| 7710 | 10.3 |
| 7711 | 9.1 |
| 7712 | 7.9 |
| 7713 | 7.8 |
| 7714 | 7.6 |
| 7715 | 8.3 |
| 7716 | 11.3 |
| 7717 | 12.1 |
| 7718 | 14.3 |
| 7719 | 14.3 |
| 7720 | 11.8 |
| 7721 | 11.5 |
| 7722 | 6.7 |
| 7723 | 7.4 |
| 7724 | 11.4 |
| 7725 | 11.5 |
| 7726 | 7.7 |
| 7727 | 8.6 |
| 7728 | 10.4 |
| 7729 | 12.5 |
| 7730 | 12.4 |
| 7731 | 10.8 |
| 7732 | 8.2 |
| 7733 | 10.6 |
| 7734 | 10.9 |
| 7735 | 8.5 |
| 7736 | 12.1 |
| 7737 | 12.4 |
| 7738 | 12.1 |
| 7739 | 11.1 |
| 7740 | 7 |
| 7741 | 4 |
| 7742 | 3.8 |
| 7743 | 6.4 |
| 7744 | 7.2 |
| 7745 | 7.3 |
| 7746 | 9.4 |
| 7747 | 9 |
| 7748 | 8.8 |
| 7749 | 6.8 |
| 7750 | 5.6 |
| 7751 | 8.6 |
| 7752 | 7 |
| 7753 | 9.3 |
| 7754 | 9.1 |
| 7755 | 9.5 |
| 7756 | 8.7 |
| 7757 | 6.4 |
| 7758 | 5.3 |
| 7759 | 2.9 |
| 7760 | 3.8 |
| 7761 | 2.4 |
| 7762 | 9.6 |
| 7763 | 10.4 |
| 7764 | 9.2 |
| 7765 | 4.3 |
| 7766 | 4.4 |
| 7767 | 10.7 |
| 7768 | 11.4 |
| 7769 | 8.3 |
| 7770 | 8.1 |
| 7771 | 4.3 |
| 7772 | 3.8 |
| 7773 | 8.3 |
| 7774 | 10 |
| 7775 | 9.2 |
| 7776 | 5.1 |
| 7777 | 3.6 |
| 7778 | 4.8 |
| 7779 | 5.2 |
| 7780 | 6.3 |
| 7781 | 5.2 |
| 7782 | 5.9 |
| 7783 | 5.1 |
| 7784 | 5.1 |
| 7785 | 5.1 |
| 7786 | 4.7 |
| 7787 | 4.7 |
| 7788 | 3.6 |
| 7789 | 4.3 |
| 7790 | 5.3 |
| 7791 | 4.7 |
| 7792 | 4.9 |
| 7793 | 4.9 |
| 7794 | 6.8 |
| 7795 | 9.8 |
| 7796 | 8.8 |
| 7797 | 9.4 |
| 7798 | 11 |
| 7799 | 11.3 |
| 7800 | 13.3 |
| 7801 | 12.3 |
| 7802 | 10.7 |
| 7803 | 8.7 |
| 7804 | 6.8 |
| 7805 | 6.1 |
| 7806 | 5.6 |
| 7807 | 4.7 |
| 7808 | 3.5 |
| 7809 | 4.7 |
| 7810 | 3.7 |
| 7811 | 4.7 |
| 7812 | 5.2 |
| 7813 | 6 |
| 7814 | 7.4 |
| 7815 | 8.9 |
| 7816 | 9.1 |
| 7817 | 9.6 |
| 7818 | 10.8 |
| 7819 | 11.6 |
| 7820 | 11.3 |
| 7821 | 11.8 |
| 7822 | 13.2 |
| 7823 | 13.9 |
| 7824 | 12.4 |
| 7825 | 12.6 |
| 7826 | 13.2 |
| 7827 | 14.6 |
| 7828 | 15.3 |
| 7829 | 15.2 |
| 7830 | 14.4 |
| 7831 | 13.1 |
| 7832 | 9.5 |
| 7833 | 6.9 |
| 7834 | 6.8 |
| 7835 | 6.9 |
| 7836 | 6.4 |
| 7837 | 6.9 |
| 7838 | 6.5 |
| 7839 | 7.3 |
| 7840 | 7.7 |
| 7841 | 8.1 |
| 7842 | 8.4 |
| 7843 | 7.4 |
| 7844 | 7.3 |
| 7845 | 7.7 |
| 7846 | 6.3 |
| 7847 | 4.9 |
| 7848 | 9.3 |
| 7849 | 9 |
| 7850 | 9.9 |
| 7851 | 10.6 |
| 7852 | 10.7 |
| 7853 | 10.2 |
| 7854 | 9.3 |
| 7855 | 8.8 |
| 7856 | 8.8 |
| 7857 | 9.3 |
| 7858 | 10.2 |
| 7859 | 9.9 |
| 7860 | 10 |
| 7861 | 9.5 |
| 7862 | 10.1 |
| 7863 | 9.9 |
| 7864 | 9.1 |
| 7865 | 8.5 |
| 7866 | 8.8 |
| 7867 | 8.2 |
| 7868 | 9 |
| 7869 | 8.2 |
| 7870 | 8.2 |
| 7871 | 9.4 |
| 7872 | 10.4 |
| 7873 | 9.1 |
| 7874 | 7.8 |
| 7875 | 7.2 |
| 7876 | 7.8 |
| 7877 | 8.3 |
| 7878 | 8.6 |
| 7879 | 8.6 |
| 7880 | 8.1 |
| 7881 | 8.4 |
| 7882 | 7.6 |
| 7883 | 8.8 |
| 7884 | 8.3 |
| 7885 | 7.4 |
| 7886 | 8 |
| 7887 | 9.5 |
| 7888 | 10.4 |
| 7889 | 11.1 |
| 7890 | 11.5 |
| 7891 | 11.1 |
| 7892 | 10.6 |
| 7893 | 10.2 |
| 7894 | 10.1 |
| 7895 | 10 |
| 7896 | 8.6 |
| 7897 | 8.1 |
| 7898 | 8 |
| 7899 | 8.2 |
| 7900 | 7.8 |
| 7901 | 8.2 |
| 7902 | 8.2 |
| 7903 | 9 |
| 7904 | 9.9 |
| 7905 | 10.9 |
| 7906 | 11.9 |
| 7907 | 12.4 |
| 7908 | 11.8 |
| 7909 | 11.7 |
| 7910 | 11.1 |
| 7911 | 11.1 |
| 7912 | 10.7 |
| 7913 | 10.6 |
| 7914 | 11.1 |
| 7915 | 11.1 |
| 7916 | 11.2 |
| 7917 | 9.7 |
| 7918 | 10.3 |
| 7919 | 10.1 |
| 7920 | 9.1 |
| 7921 | 10.4 |
| 7922 | 9.8 |
| 7923 | 8.5 |
| 7924 | 7.6 |
| 7925 | 7.2 |
| 7926 | 7 |
| 7927 | 7.2 |
| 7928 | 7.5 |
| 7929 | 7.6 |
| 7930 | 7.9 |
| 7931 | 8.4 |
| 7932 | 9.2 |
| 7933 | 7.9 |
| 7934 | 9.8 |
| 7935 | 9.6 |
| 7936 | 9.1 |
| 7937 | 8.5 |
| 7938 | 8.1 |
| 7939 | 7.6 |
| 7940 | 7.1 |
| 7941 | 6 |
| 7942 | 5.2 |
| 7943 | 4.4 |
| 7944 | 6 |
| 7945 | 6.3 |
| 7946 | 5.9 |
| 7947 | 5.3 |
| 7948 | 5.3 |
| 7949 | 5.9 |
| 7950 | 6.1 |
| 7951 | 6.6 |
| 7952 | 6.9 |
| 7953 | 6.6 |
| 7954 | 5.8 |
| 7955 | 5.2 |
| 7956 | 4.4 |
| 7957 | 4.2 |
| 7958 | 4.5 |
| 7959 | 4.9 |
| 7960 | 5.8 |
| 7961 | 5.8 |
| 7962 | 5.6 |
| 7963 | 5.3 |
| 7964 | 5.4 |
| 7965 | 5.2 |
| 7966 | 4.8 |
| 7967 | 4.9 |
| 7968 | 14.6 |
| 7969 | 14.4 |
| 7970 | 14.7 |
| 7971 | 14.8 |
| 7972 | 13 |
| 7973 | 10.4 |
| 7974 | 14.8 |
| 7975 | 15.3 |
| 7976 | 13.1 |
| 7977 | 11.3 |
| 7978 | 9.8 |
| 7979 | 9.8 |
| 7980 | 10.5 |
| 7981 | 10.4 |
| 7982 | 9.8 |
| 7983 | 9.3 |
| 7984 | 9.6 |
| 7985 | 10.8 |
| 7986 | 7.9 |
| 7987 | 8.2 |
| 7988 | 9.2 |
| 7989 | 9.3 |
| 7990 | 8.5 |
| 7991 | 8.3 |
| 7992 | 7.8 |
| 7993 | 8.1 |
| 7994 | 8.1 |
| 7995 | 7.5 |
| 7996 | 6.8 |
| 7997 | 6.5 |
| 7998 | 7.1 |
| 7999 | 7.6 |
| 8000 | 8.5 |
| 8001 | 8.7 |
| 8002 | 8.6 |
| 8003 | 8.6 |
| 8004 | 8.4 |
| 8005 | 8 |
| 8006 | 7.9 |
| 8007 | 7.7 |
| 8008 | 7 |
| 8009 | 7.1 |
| 8010 | 7.1 |
| 8011 | 6.7 |
| 8012 | 6.8 |
| 8013 | 5.4 |
| 8014 | 5.8 |
| 8015 | 6.1 |
| 8016 | 6.7 |
| 8017 | 6.1 |
| 8018 | 6 |
| 8019 | 6 |
| 8020 | 5.9 |
| 8021 | 7.2 |
| 8022 | 9.1 |
| 8023 | 10.9 |
| 8024 | 11.9 |
| 8025 | 12 |
| 8026 | 7.4 |
| 8027 | 7.3 |
| 8028 | 6.6 |
| 8029 | 6 |
| 8030 | 5.7 |
| 8031 | 4.6 |
| 8032 | 3.8 |
| 8033 | 4.7 |
| 8034 | 6.4 |
| 8035 | 6.1 |
| 8036 | 6.4 |
| 8037 | 6.4 |
| 8038 | 5.3 |
| 8039 | 6.3 |
| 8040 | 15.8 |
| 8041 | 15.5 |
| 8042 | 14.4 |
| 8043 | 12.3 |
| 8044 | 11.9 |
| 8045 | 9.4 |
| 8046 | 7.8 |
| 8047 | 5.8 |
| 8048 | 4.8 |
| 8049 | 4.7 |
| 8050 | 6.2 |
| 8051 | 6.9 |
| 8052 | 7.7 |
| 8053 | 8.3 |
| 8054 | 8.8 |
| 8055 | 9.5 |
| 8056 | 9.4 |
| 8057 | 9.3 |
| 8058 | 8.9 |
| 8059 | 8.4 |
| 8060 | 7.3 |
| 8061 | 6.5 |
| 8062 | 7.4 |
| 8063 | 10 |
| 8064 | 6.3 |
| 8065 | 5.2 |
| 8066 | 6.3 |
| 8067 | 6.1 |
| 8068 | 6.6 |
| 8069 | 5.4 |
| 8070 | 3.3 |
| 8071 | 5.7 |
| 8072 | 7.1 |
| 8073 | 5.9 |
| 8074 | 8.4 |
| 8075 | 9.9 |
| 8076 | 11.1 |
| 8077 | 12.4 |
| 8078 | 12.9 |
| 8079 | 13.6 |
| 8080 | 13.3 |
| 8081 | 9.9 |
| 8082 | 10.1 |
| 8083 | 13.5 |
| 8084 | 13.7 |
| 8085 | 11.7 |
| 8086 | 11.1 |
| 8087 | 11.8 |
| 8088 | 10.9 |
| 8089 | 10.5 |
| 8090 | 10.5 |
| 8091 | 9.6 |
| 8092 | 8.4 |
| 8093 | 9 |
| 8094 | 9.6 |
| 8095 | 9.9 |
| 8096 | 9.9 |
| 8097 | 9.1 |
| 8098 | 8.5 |
| 8099 | 9.1 |
| 8100 | 10.5 |
| 8101 | 12.5 |
| 8102 | 12.4 |
| 8103 | 12.2 |
| 8104 | 12 |
| 8105 | 11.2 |
| 8106 | 9.7 |
| 8107 | 9.9 |
| 8108 | 10.3 |
| 8109 | 10.4 |
| 8110 | 11 |
| 8111 | 10.8 |
| 8112 | 7.2 |
| 8113 | 7 |
| 8114 | 6.9 |
| 8115 | 6.6 |
| 8116 | 6.4 |
| 8117 | 6.6 |
| 8118 | 7 |
| 8119 | 6.7 |
| 8120 | 6.6 |
| 8121 | 6.5 |
| 8122 | 6.1 |
| 8123 | 5.7 |
| 8124 | 6.6 |
| 8125 | 6.9 |
| 8126 | 6.6 |
| 8127 | 6.6 |
| 8128 | 6.7 |
| 8129 | 6.6 |
| 8130 | 6.3 |
| 8131 | 6.6 |
| 8132 | 6.8 |
| 8133 | 6.4 |
| 8134 | 6.4 |
| 8135 | 6.4 |
| 8136 | 8.7 |
| 8137 | 8.3 |
| 8138 | 7.5 |
| 8139 | 6.8 |
| 8140 | 6.8 |
| 8141 | 6.3 |
| 8142 | 5.6 |
| 8143 | 5.3 |
| 8144 | 5.2 |
| 8145 | 5.4 |
| 8146 | 6 |
| 8147 | 6.3 |
| 8148 | 6.9 |
| 8149 | 5.6 |
| 8150 | 5.5 |
| 8151 | 5.5 |
| 8152 | 5.5 |
| 8153 | 5.7 |
| 8154 | 5.2 |
| 8155 | 5 |
| 8156 | 5 |
| 8157 | 5.1 |
| 8158 | 5.5 |
| 8159 | 5.6 |
| 8160 | 2.7 |
| 8161 | 2.4 |
| 8162 | 2.3 |
| 8163 | 2.5 |
| 8164 | 2.7 |
| 8165 | 2.1 |
| 8166 | 3 |
| 8167 | 4.2 |
| 8168 | 4.8 |
| 8169 | 5.4 |
| 8170 | 6.6 |
| 8171 | 7.4 |
| 8172 | 7.5 |
| 8173 | 7.6 |
| 8174 | 7.9 |
| 8175 | 8.4 |
| 8176 | 9.1 |
| 8177 | 9.5 |
| 8178 | 9.8 |
| 8179 | 9.9 |
| 8180 | 9.7 |
| 8181 | 9.3 |
| 8182 | 8.6 |
| 8183 | 7.9 |
| 8184 | 4.9 |
| 8185 | 5.3 |
| 8186 | 5.8 |
| 8187 | 6 |
| 8188 | 6.3 |
| 8189 | 7 |
| 8190 | 7.2 |
| 8191 | 7.1 |
| 8192 | 7.5 |
| 8193 | 8.3 |
| 8194 | 9.2 |
| 8195 | 9.8 |
| 8196 | 10.3 |
| 8197 | 10.8 |
| 8198 | 11 |
| 8199 | 11.3 |
| 8200 | 11.6 |
| 8201 | 11.9 |
| 8202 | 11.9 |
| 8203 | 11.5 |
| 8204 | 11 |
| 8205 | 10.7 |
| 8206 | 10.2 |
| 8207 | 9.2 |
| 8208 | 9 |
| 8209 | 8.2 |
| 8210 | 7.2 |
| 8211 | 6.2 |
| 8212 | 5.8 |
| 8213 | 6.1 |
| 8214 | 6 |
| 8215 | 6.3 |
| 8216 | 7.5 |
| 8217 | 9.1 |
| 8218 | 10.6 |
| 8219 | 11.4 |
| 8220 | 12 |
| 8221 | 12.4 |
| 8222 | 12.4 |
| 8223 | 12.5 |
| 8224 | 12.6 |
| 8225 | 12.4 |
| 8226 | 12.2 |
| 8227 | 12.1 |
| 8228 | 12 |
| 8229 | 11.7 |
| 8230 | 11.4 |
| 8231 | 11.1 |
| 8232 | 10.2 |
| 8233 | 9.9 |
| 8234 | 9.7 |
| 8235 | 9.1 |
| 8236 | 9.1 |
| 8237 | 10.5 |
| 8238 | 11.2 |
| 8239 | 11.8 |
| 8240 | 12.1 |
| 8241 | 12.1 |
| 8242 | 11.9 |
| 8243 | 11.7 |
| 8244 | 11.3 |
| 8245 | 11.1 |
| 8246 | 10.8 |
| 8247 | 10.6 |
| 8248 | 10.5 |
| 8249 | 10.4 |
| 8250 | 10.4 |
| 8251 | 10.6 |
| 8252 | 10.8 |
| 8253 | 10.9 |
| 8254 | 10.9 |
| 8255 | 10.7 |
| 8256 | 15 |
| 8257 | 14.4 |
| 8258 | 12.9 |
| 8259 | 10.9 |
| 8260 | 10 |
| 8261 | 10 |
| 8262 | 9.8 |
| 8263 | 9.4 |
| 8264 | 9.3 |
| 8265 | 9.4 |
| 8266 | 9.8 |
| 8267 | 10.3 |
| 8268 | 10.4 |
| 8269 | 10.3 |
| 8270 | 10.8 |
| 8271 | 11.5 |
| 8272 | 11.9 |
| 8273 | 12 |
| 8274 | 11.6 |
| 8275 | 11.2 |
| 8276 | 10.8 |
| 8277 | 10.6 |
| 8278 | 10.3 |
| 8279 | 10 |
| 8280 | 10 |
| 8281 | 8.3 |
| 8282 | 7.5 |
| 8283 | 7.2 |
| 8284 | 7.2 |
| 8285 | 8.1 |
| 8286 | 8.5 |
| 8287 | 8.6 |
| 8288 | 7.9 |
| 8289 | 7 |
| 8290 | 7.2 |
| 8291 | 8.2 |
| 8292 | 8.9 |
| 8293 | 9.1 |
| 8294 | 9.4 |
| 8295 | 10 |
| 8296 | 9.9 |
| 8297 | 9.4 |
| 8298 | 9.4 |
| 8299 | 9.3 |
| 8300 | 9.3 |
| 8301 | 9.3 |
| 8302 | 8.7 |
| 8303 | 8.4 |
| 8304 | 5.7 |
| 8305 | 5 |
| 8306 | 4.6 |
| 8307 | 4.5 |
| 8308 | 4.8 |
| 8309 | 6 |
| 8310 | 6.4 |
| 8311 | 6.2 |
| 8312 | 6.9 |
| 8313 | 7.8 |
| 8314 | 8 |
| 8315 | 8.2 |
| 8316 | 8.4 |
| 8317 | 8.7 |
| 8318 | 9 |
| 8319 | 9.2 |
| 8320 | 9.3 |
| 8321 | 9.3 |
| 8322 | 9 |
| 8323 | 8.5 |
| 8324 | 8.2 |
| 8325 | 7.8 |
| 8326 | 7.1 |
| 8327 | 6.6 |
| 8328 | 5.1 |
| 8329 | 4.4 |
| 8330 | 3.3 |
| 8331 | 2.1 |
| 8332 | 1.2 |
| 8333 | 0.7 |
| 8334 | 1.8 |
| 8335 | 3.5 |
| 8336 | 4.6 |
| 8337 | 5.2 |
| 8338 | 5.6 |
| 8339 | 6.2 |
| 8340 | 6.5 |
| 8341 | 6.1 |
| 8342 | 5.8 |
| 8343 | 5.3 |
| 8344 | 4.9 |
| 8345 | 4.9 |
| 8346 | 5 |
| 8347 | 5.7 |
| 8348 | 6.5 |
| 8349 | 6.3 |
| 8350 | 5.5 |
| 8351 | 4.8 |
| 8352 | 4.5 |
| 8353 | 3.5 |
| 8354 | 2.6 |
| 8355 | 2.1 |
| 8356 | 1.6 |
| 8357 | 1.2 |
| 8358 | 0.3 |
| 8359 | 1.6 |
| 8360 | 3.6 |
| 8361 | 5.7 |
| 8362 | 6.7 |
| 8363 | 6.9 |
| 8364 | 7.4 |
| 8365 | 7.9 |
| 8366 | 8.6 |
| 8367 | 8.8 |
| 8368 | 9.1 |
| 8369 | 9.7 |
| 8370 | 10.5 |
| 8371 | 11.3 |
| 8372 | 11.9 |
| 8373 | 12.3 |
| 8374 | 12.6 |
| 8375 | 12.8 |
| 8376 | 11.6 |
| 8377 | 11.2 |
| 8378 | 11.4 |
| 8379 | 11.5 |
| 8380 | 11.5 |
| 8381 | 12.1 |
| 8382 | 11.1 |
| 8383 | 9.7 |
| 8384 | 11.5 |
| 8385 | 12 |
| 8386 | 10.8 |
| 8387 | 10.7 |
| 8388 | 12.8 |
| 8389 | 14.5 |
| 8390 | 18.1 |
| 8391 | 18.2 |
| 8392 | 19.2 |
| 8393 | 18.8 |
| 8394 | 16 |
| 8395 | 15 |
| 8396 | 15.9 |
| 8397 | 15 |
| 8398 | 12.8 |
| 8399 | 10.2 |
| 8400 | 16.3 |
| 8401 | 15.5 |
| 8402 | 15.6 |
| 8403 | 14.7 |
| 8404 | 14.3 |
| 8405 | 15.1 |
| 8406 | 14.2 |
| 8407 | 13.1 |
| 8408 | 12.7 |
| 8409 | 12.6 |
| 8410 | 12.5 |
| 8411 | 12.5 |
| 8412 | 12.7 |
| 8413 | 12.5 |
| 8414 | 12.5 |
| 8415 | 12.1 |
| 8416 | 11.9 |
| 8417 | 12.4 |
| 8418 | 12.2 |
| 8419 | 11.9 |
| 8420 | 12 |
| 8421 | 11.7 |
| 8422 | 11.8 |
| 8423 | 11.8 |